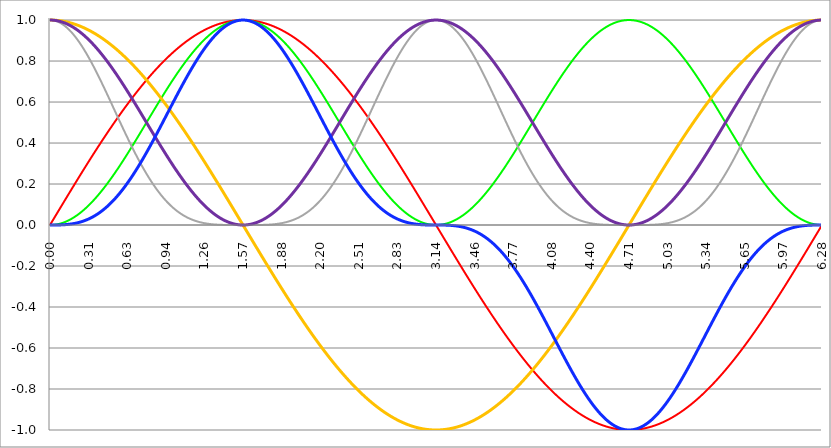
| Category | Series 1 | Series 0 | Series 2 | Series 3 | Series 4 | Series 5 |
|---|---|---|---|---|---|---|
| 0.0 | 0 | 0 | 1 | 1 | 1 | 0 |
| 0.00314159265358979 | 0.003 | 0 | 1 | 1 | 1 | 0 |
| 0.00628318530717958 | 0.006 | 0 | 1 | 1 | 1 | 0 |
| 0.00942477796076938 | 0.009 | 0 | 1 | 1 | 1 | 0 |
| 0.0125663706143592 | 0.013 | 0 | 1 | 1 | 1 | 0 |
| 0.015707963267949 | 0.016 | 0 | 1 | 1 | 1 | 0 |
| 0.0188495559215388 | 0.019 | 0 | 0.999 | 1 | 1 | 0 |
| 0.0219911485751285 | 0.022 | 0 | 0.999 | 1 | 1 | 0 |
| 0.0251327412287183 | 0.025 | 0.001 | 0.999 | 1 | 0.999 | 0 |
| 0.0282743338823081 | 0.028 | 0.001 | 0.998 | 1 | 0.999 | 0 |
| 0.0314159265358979 | 0.031 | 0.001 | 0.998 | 1 | 0.999 | 0 |
| 0.0345575191894877 | 0.035 | 0.001 | 0.998 | 0.999 | 0.999 | 0 |
| 0.0376991118430775 | 0.038 | 0.001 | 0.997 | 0.999 | 0.999 | 0 |
| 0.0408407044966673 | 0.041 | 0.002 | 0.997 | 0.999 | 0.998 | 0 |
| 0.0439822971502571 | 0.044 | 0.002 | 0.996 | 0.999 | 0.998 | 0 |
| 0.0471238898038469 | 0.047 | 0.002 | 0.996 | 0.999 | 0.998 | 0 |
| 0.0502654824574367 | 0.05 | 0.003 | 0.995 | 0.999 | 0.997 | 0 |
| 0.0534070751110265 | 0.053 | 0.003 | 0.994 | 0.999 | 0.997 | 0 |
| 0.0565486677646163 | 0.057 | 0.003 | 0.994 | 0.998 | 0.997 | 0 |
| 0.059690260418206 | 0.06 | 0.004 | 0.993 | 0.998 | 0.996 | 0 |
| 0.0628318530717958 | 0.063 | 0.004 | 0.992 | 0.998 | 0.996 | 0 |
| 0.0659734457253856 | 0.066 | 0.004 | 0.991 | 0.998 | 0.996 | 0 |
| 0.0691150383789754 | 0.069 | 0.005 | 0.99 | 0.998 | 0.995 | 0 |
| 0.0722566310325652 | 0.072 | 0.005 | 0.99 | 0.997 | 0.995 | 0 |
| 0.075398223686155 | 0.075 | 0.006 | 0.989 | 0.997 | 0.994 | 0 |
| 0.0785398163397448 | 0.078 | 0.006 | 0.988 | 0.997 | 0.994 | 0 |
| 0.0816814089933346 | 0.082 | 0.007 | 0.987 | 0.997 | 0.993 | 0.001 |
| 0.0848230016469244 | 0.085 | 0.007 | 0.986 | 0.996 | 0.993 | 0.001 |
| 0.0879645943005142 | 0.088 | 0.008 | 0.985 | 0.996 | 0.992 | 0.001 |
| 0.091106186954104 | 0.091 | 0.008 | 0.984 | 0.996 | 0.992 | 0.001 |
| 0.0942477796076937 | 0.094 | 0.009 | 0.982 | 0.996 | 0.991 | 0.001 |
| 0.0973893722612835 | 0.097 | 0.009 | 0.981 | 0.995 | 0.991 | 0.001 |
| 0.100530964914873 | 0.1 | 0.01 | 0.98 | 0.995 | 0.99 | 0.001 |
| 0.103672557568463 | 0.103 | 0.011 | 0.979 | 0.995 | 0.989 | 0.001 |
| 0.106814150222053 | 0.107 | 0.011 | 0.977 | 0.994 | 0.989 | 0.001 |
| 0.109955742875643 | 0.11 | 0.012 | 0.976 | 0.994 | 0.988 | 0.001 |
| 0.113097335529233 | 0.113 | 0.013 | 0.975 | 0.994 | 0.987 | 0.001 |
| 0.116238928182822 | 0.116 | 0.013 | 0.973 | 0.993 | 0.987 | 0.002 |
| 0.119380520836412 | 0.119 | 0.014 | 0.972 | 0.993 | 0.986 | 0.002 |
| 0.122522113490002 | 0.122 | 0.015 | 0.97 | 0.993 | 0.985 | 0.002 |
| 0.125663706143592 | 0.125 | 0.016 | 0.969 | 0.992 | 0.984 | 0.002 |
| 0.128805298797181 | 0.128 | 0.016 | 0.967 | 0.992 | 0.984 | 0.002 |
| 0.131946891450771 | 0.132 | 0.017 | 0.966 | 0.991 | 0.983 | 0.002 |
| 0.135088484104361 | 0.135 | 0.018 | 0.964 | 0.991 | 0.982 | 0.002 |
| 0.138230076757951 | 0.138 | 0.019 | 0.962 | 0.99 | 0.981 | 0.003 |
| 0.141371669411541 | 0.141 | 0.02 | 0.961 | 0.99 | 0.98 | 0.003 |
| 0.14451326206513 | 0.144 | 0.021 | 0.959 | 0.99 | 0.979 | 0.003 |
| 0.14765485471872 | 0.147 | 0.022 | 0.957 | 0.989 | 0.978 | 0.003 |
| 0.15079644737231 | 0.15 | 0.023 | 0.955 | 0.989 | 0.977 | 0.003 |
| 0.1539380400259 | 0.153 | 0.024 | 0.954 | 0.988 | 0.976 | 0.004 |
| 0.15707963267949 | 0.156 | 0.024 | 0.952 | 0.988 | 0.976 | 0.004 |
| 0.160221225333079 | 0.16 | 0.025 | 0.95 | 0.987 | 0.975 | 0.004 |
| 0.163362817986669 | 0.163 | 0.026 | 0.948 | 0.987 | 0.974 | 0.004 |
| 0.166504410640259 | 0.166 | 0.027 | 0.946 | 0.986 | 0.973 | 0.005 |
| 0.169646003293849 | 0.169 | 0.029 | 0.944 | 0.986 | 0.971 | 0.005 |
| 0.172787595947439 | 0.172 | 0.03 | 0.942 | 0.985 | 0.97 | 0.005 |
| 0.175929188601028 | 0.175 | 0.031 | 0.94 | 0.985 | 0.969 | 0.005 |
| 0.179070781254618 | 0.178 | 0.032 | 0.938 | 0.984 | 0.968 | 0.006 |
| 0.182212373908208 | 0.181 | 0.033 | 0.935 | 0.983 | 0.967 | 0.006 |
| 0.185353966561798 | 0.184 | 0.034 | 0.933 | 0.983 | 0.966 | 0.006 |
| 0.188495559215388 | 0.187 | 0.035 | 0.931 | 0.982 | 0.965 | 0.007 |
| 0.191637151868977 | 0.19 | 0.036 | 0.929 | 0.982 | 0.964 | 0.007 |
| 0.194778744522567 | 0.194 | 0.037 | 0.926 | 0.981 | 0.963 | 0.007 |
| 0.197920337176157 | 0.197 | 0.039 | 0.924 | 0.98 | 0.961 | 0.008 |
| 0.201061929829747 | 0.2 | 0.04 | 0.922 | 0.98 | 0.96 | 0.008 |
| 0.204203522483336 | 0.203 | 0.041 | 0.919 | 0.979 | 0.959 | 0.008 |
| 0.207345115136926 | 0.206 | 0.042 | 0.917 | 0.979 | 0.958 | 0.009 |
| 0.210486707790516 | 0.209 | 0.044 | 0.915 | 0.978 | 0.956 | 0.009 |
| 0.213628300444106 | 0.212 | 0.045 | 0.912 | 0.977 | 0.955 | 0.01 |
| 0.216769893097696 | 0.215 | 0.046 | 0.91 | 0.977 | 0.954 | 0.01 |
| 0.219911485751285 | 0.218 | 0.048 | 0.907 | 0.976 | 0.952 | 0.01 |
| 0.223053078404875 | 0.221 | 0.049 | 0.905 | 0.975 | 0.951 | 0.011 |
| 0.226194671058465 | 0.224 | 0.05 | 0.902 | 0.975 | 0.95 | 0.011 |
| 0.229336263712055 | 0.227 | 0.052 | 0.899 | 0.974 | 0.948 | 0.012 |
| 0.232477856365645 | 0.23 | 0.053 | 0.897 | 0.973 | 0.947 | 0.012 |
| 0.235619449019234 | 0.233 | 0.054 | 0.894 | 0.972 | 0.946 | 0.013 |
| 0.238761041672824 | 0.236 | 0.056 | 0.891 | 0.972 | 0.944 | 0.013 |
| 0.241902634326414 | 0.24 | 0.057 | 0.889 | 0.971 | 0.943 | 0.014 |
| 0.245044226980004 | 0.243 | 0.059 | 0.886 | 0.97 | 0.941 | 0.014 |
| 0.248185819633594 | 0.246 | 0.06 | 0.883 | 0.969 | 0.94 | 0.015 |
| 0.251327412287183 | 0.249 | 0.062 | 0.88 | 0.969 | 0.938 | 0.015 |
| 0.254469004940773 | 0.252 | 0.063 | 0.877 | 0.968 | 0.937 | 0.016 |
| 0.257610597594363 | 0.255 | 0.065 | 0.874 | 0.967 | 0.935 | 0.017 |
| 0.260752190247953 | 0.258 | 0.066 | 0.871 | 0.966 | 0.934 | 0.017 |
| 0.263893782901543 | 0.261 | 0.068 | 0.869 | 0.965 | 0.932 | 0.018 |
| 0.267035375555132 | 0.264 | 0.07 | 0.866 | 0.965 | 0.93 | 0.018 |
| 0.270176968208722 | 0.267 | 0.071 | 0.863 | 0.964 | 0.929 | 0.019 |
| 0.273318560862312 | 0.27 | 0.073 | 0.86 | 0.963 | 0.927 | 0.02 |
| 0.276460153515902 | 0.273 | 0.075 | 0.857 | 0.962 | 0.925 | 0.02 |
| 0.279601746169492 | 0.276 | 0.076 | 0.853 | 0.961 | 0.924 | 0.021 |
| 0.282743338823082 | 0.279 | 0.078 | 0.85 | 0.96 | 0.922 | 0.022 |
| 0.285884931476671 | 0.282 | 0.08 | 0.847 | 0.959 | 0.92 | 0.022 |
| 0.289026524130261 | 0.285 | 0.081 | 0.844 | 0.959 | 0.919 | 0.023 |
| 0.292168116783851 | 0.288 | 0.083 | 0.841 | 0.958 | 0.917 | 0.024 |
| 0.295309709437441 | 0.291 | 0.085 | 0.838 | 0.957 | 0.915 | 0.025 |
| 0.298451302091031 | 0.294 | 0.086 | 0.835 | 0.956 | 0.914 | 0.025 |
| 0.30159289474462 | 0.297 | 0.088 | 0.831 | 0.955 | 0.912 | 0.026 |
| 0.30473448739821 | 0.3 | 0.09 | 0.828 | 0.954 | 0.91 | 0.027 |
| 0.3078760800518 | 0.303 | 0.092 | 0.825 | 0.953 | 0.908 | 0.028 |
| 0.31101767270539 | 0.306 | 0.094 | 0.821 | 0.952 | 0.906 | 0.029 |
| 0.31415926535898 | 0.309 | 0.095 | 0.818 | 0.951 | 0.905 | 0.03 |
| 0.31730085801257 | 0.312 | 0.097 | 0.815 | 0.95 | 0.903 | 0.03 |
| 0.320442450666159 | 0.315 | 0.099 | 0.811 | 0.949 | 0.901 | 0.031 |
| 0.323584043319749 | 0.318 | 0.101 | 0.808 | 0.948 | 0.899 | 0.032 |
| 0.326725635973339 | 0.321 | 0.103 | 0.805 | 0.947 | 0.897 | 0.033 |
| 0.329867228626929 | 0.324 | 0.105 | 0.801 | 0.946 | 0.895 | 0.034 |
| 0.333008821280519 | 0.327 | 0.107 | 0.798 | 0.945 | 0.893 | 0.035 |
| 0.336150413934108 | 0.33 | 0.109 | 0.794 | 0.944 | 0.891 | 0.036 |
| 0.339292006587698 | 0.333 | 0.111 | 0.791 | 0.943 | 0.889 | 0.037 |
| 0.342433599241288 | 0.336 | 0.113 | 0.787 | 0.942 | 0.887 | 0.038 |
| 0.345575191894878 | 0.339 | 0.115 | 0.784 | 0.941 | 0.885 | 0.039 |
| 0.348716784548468 | 0.342 | 0.117 | 0.78 | 0.94 | 0.883 | 0.04 |
| 0.351858377202058 | 0.345 | 0.119 | 0.777 | 0.939 | 0.881 | 0.041 |
| 0.354999969855647 | 0.348 | 0.121 | 0.773 | 0.938 | 0.879 | 0.042 |
| 0.358141562509237 | 0.351 | 0.123 | 0.769 | 0.937 | 0.877 | 0.043 |
| 0.361283155162827 | 0.353 | 0.125 | 0.766 | 0.935 | 0.875 | 0.044 |
| 0.364424747816417 | 0.356 | 0.127 | 0.762 | 0.934 | 0.873 | 0.045 |
| 0.367566340470007 | 0.359 | 0.129 | 0.758 | 0.933 | 0.871 | 0.046 |
| 0.370707933123597 | 0.362 | 0.131 | 0.755 | 0.932 | 0.869 | 0.048 |
| 0.373849525777186 | 0.365 | 0.133 | 0.751 | 0.931 | 0.867 | 0.049 |
| 0.376991118430776 | 0.368 | 0.136 | 0.747 | 0.93 | 0.864 | 0.05 |
| 0.380132711084366 | 0.371 | 0.138 | 0.744 | 0.929 | 0.862 | 0.051 |
| 0.383274303737956 | 0.374 | 0.14 | 0.74 | 0.927 | 0.86 | 0.052 |
| 0.386415896391546 | 0.377 | 0.142 | 0.736 | 0.926 | 0.858 | 0.054 |
| 0.389557489045135 | 0.38 | 0.144 | 0.732 | 0.925 | 0.856 | 0.055 |
| 0.392699081698725 | 0.383 | 0.146 | 0.729 | 0.924 | 0.854 | 0.056 |
| 0.395840674352315 | 0.386 | 0.149 | 0.725 | 0.923 | 0.851 | 0.057 |
| 0.398982267005905 | 0.388 | 0.151 | 0.721 | 0.921 | 0.849 | 0.059 |
| 0.402123859659495 | 0.391 | 0.153 | 0.717 | 0.92 | 0.847 | 0.06 |
| 0.405265452313085 | 0.394 | 0.155 | 0.713 | 0.919 | 0.845 | 0.061 |
| 0.408407044966674 | 0.397 | 0.158 | 0.709 | 0.918 | 0.842 | 0.063 |
| 0.411548637620264 | 0.4 | 0.16 | 0.706 | 0.917 | 0.84 | 0.064 |
| 0.414690230273854 | 0.403 | 0.162 | 0.702 | 0.915 | 0.838 | 0.065 |
| 0.417831822927444 | 0.406 | 0.165 | 0.698 | 0.914 | 0.835 | 0.067 |
| 0.420973415581034 | 0.409 | 0.167 | 0.694 | 0.913 | 0.833 | 0.068 |
| 0.424115008234623 | 0.412 | 0.169 | 0.69 | 0.911 | 0.831 | 0.07 |
| 0.427256600888213 | 0.414 | 0.172 | 0.686 | 0.91 | 0.828 | 0.071 |
| 0.430398193541803 | 0.417 | 0.174 | 0.682 | 0.909 | 0.826 | 0.073 |
| 0.433539786195393 | 0.42 | 0.176 | 0.678 | 0.907 | 0.824 | 0.074 |
| 0.436681378848983 | 0.423 | 0.179 | 0.674 | 0.906 | 0.821 | 0.076 |
| 0.439822971502573 | 0.426 | 0.181 | 0.67 | 0.905 | 0.819 | 0.077 |
| 0.442964564156162 | 0.429 | 0.184 | 0.666 | 0.903 | 0.816 | 0.079 |
| 0.446106156809752 | 0.431 | 0.186 | 0.662 | 0.902 | 0.814 | 0.08 |
| 0.449247749463342 | 0.434 | 0.189 | 0.658 | 0.901 | 0.811 | 0.082 |
| 0.452389342116932 | 0.437 | 0.191 | 0.654 | 0.899 | 0.809 | 0.084 |
| 0.455530934770522 | 0.44 | 0.194 | 0.65 | 0.898 | 0.806 | 0.085 |
| 0.458672527424111 | 0.443 | 0.196 | 0.646 | 0.897 | 0.804 | 0.087 |
| 0.461814120077701 | 0.446 | 0.199 | 0.642 | 0.895 | 0.801 | 0.088 |
| 0.464955712731291 | 0.448 | 0.201 | 0.638 | 0.894 | 0.799 | 0.09 |
| 0.468097305384881 | 0.451 | 0.204 | 0.634 | 0.892 | 0.796 | 0.092 |
| 0.471238898038471 | 0.454 | 0.206 | 0.63 | 0.891 | 0.794 | 0.094 |
| 0.474380490692061 | 0.457 | 0.209 | 0.626 | 0.89 | 0.791 | 0.095 |
| 0.47752208334565 | 0.46 | 0.211 | 0.622 | 0.888 | 0.789 | 0.097 |
| 0.48066367599924 | 0.462 | 0.214 | 0.618 | 0.887 | 0.786 | 0.099 |
| 0.48380526865283 | 0.465 | 0.216 | 0.614 | 0.885 | 0.784 | 0.101 |
| 0.48694686130642 | 0.468 | 0.219 | 0.61 | 0.884 | 0.781 | 0.102 |
| 0.49008845396001 | 0.471 | 0.222 | 0.606 | 0.882 | 0.778 | 0.104 |
| 0.493230046613599 | 0.473 | 0.224 | 0.602 | 0.881 | 0.776 | 0.106 |
| 0.496371639267189 | 0.476 | 0.227 | 0.598 | 0.879 | 0.773 | 0.108 |
| 0.499513231920779 | 0.479 | 0.229 | 0.594 | 0.878 | 0.771 | 0.11 |
| 0.502654824574369 | 0.482 | 0.232 | 0.59 | 0.876 | 0.768 | 0.112 |
| 0.505796417227959 | 0.485 | 0.235 | 0.586 | 0.875 | 0.765 | 0.114 |
| 0.508938009881549 | 0.487 | 0.237 | 0.582 | 0.873 | 0.763 | 0.116 |
| 0.512079602535138 | 0.49 | 0.24 | 0.577 | 0.872 | 0.76 | 0.118 |
| 0.515221195188728 | 0.493 | 0.243 | 0.573 | 0.87 | 0.757 | 0.12 |
| 0.518362787842318 | 0.495 | 0.245 | 0.569 | 0.869 | 0.755 | 0.122 |
| 0.521504380495908 | 0.498 | 0.248 | 0.565 | 0.867 | 0.752 | 0.124 |
| 0.524645973149498 | 0.501 | 0.251 | 0.561 | 0.866 | 0.749 | 0.126 |
| 0.527787565803087 | 0.504 | 0.254 | 0.557 | 0.864 | 0.746 | 0.128 |
| 0.530929158456677 | 0.506 | 0.256 | 0.553 | 0.862 | 0.744 | 0.13 |
| 0.534070751110267 | 0.509 | 0.259 | 0.549 | 0.861 | 0.741 | 0.132 |
| 0.537212343763857 | 0.512 | 0.262 | 0.545 | 0.859 | 0.738 | 0.134 |
| 0.540353936417447 | 0.514 | 0.265 | 0.541 | 0.858 | 0.735 | 0.136 |
| 0.543495529071037 | 0.517 | 0.267 | 0.537 | 0.856 | 0.733 | 0.138 |
| 0.546637121724626 | 0.52 | 0.27 | 0.533 | 0.854 | 0.73 | 0.14 |
| 0.549778714378216 | 0.522 | 0.273 | 0.529 | 0.853 | 0.727 | 0.143 |
| 0.552920307031806 | 0.525 | 0.276 | 0.524 | 0.851 | 0.724 | 0.145 |
| 0.556061899685396 | 0.528 | 0.279 | 0.52 | 0.849 | 0.721 | 0.147 |
| 0.559203492338986 | 0.531 | 0.281 | 0.516 | 0.848 | 0.719 | 0.149 |
| 0.562345084992576 | 0.533 | 0.284 | 0.512 | 0.846 | 0.716 | 0.152 |
| 0.565486677646165 | 0.536 | 0.287 | 0.508 | 0.844 | 0.713 | 0.154 |
| 0.568628270299755 | 0.538 | 0.29 | 0.504 | 0.843 | 0.71 | 0.156 |
| 0.571769862953345 | 0.541 | 0.293 | 0.5 | 0.841 | 0.707 | 0.158 |
| 0.574911455606935 | 0.544 | 0.296 | 0.496 | 0.839 | 0.704 | 0.161 |
| 0.578053048260525 | 0.546 | 0.299 | 0.492 | 0.838 | 0.701 | 0.163 |
| 0.581194640914114 | 0.549 | 0.301 | 0.488 | 0.836 | 0.699 | 0.165 |
| 0.584336233567704 | 0.552 | 0.304 | 0.484 | 0.834 | 0.696 | 0.168 |
| 0.587477826221294 | 0.554 | 0.307 | 0.48 | 0.832 | 0.693 | 0.17 |
| 0.590619418874884 | 0.557 | 0.31 | 0.476 | 0.831 | 0.69 | 0.173 |
| 0.593761011528474 | 0.559 | 0.313 | 0.472 | 0.829 | 0.687 | 0.175 |
| 0.596902604182064 | 0.562 | 0.316 | 0.468 | 0.827 | 0.684 | 0.178 |
| 0.600044196835653 | 0.565 | 0.319 | 0.464 | 0.825 | 0.681 | 0.18 |
| 0.603185789489243 | 0.567 | 0.322 | 0.46 | 0.824 | 0.678 | 0.183 |
| 0.606327382142833 | 0.57 | 0.325 | 0.456 | 0.822 | 0.675 | 0.185 |
| 0.609468974796423 | 0.572 | 0.328 | 0.452 | 0.82 | 0.672 | 0.188 |
| 0.612610567450013 | 0.575 | 0.331 | 0.448 | 0.818 | 0.669 | 0.19 |
| 0.615752160103602 | 0.578 | 0.334 | 0.444 | 0.816 | 0.666 | 0.193 |
| 0.618893752757192 | 0.58 | 0.337 | 0.44 | 0.815 | 0.663 | 0.195 |
| 0.622035345410782 | 0.583 | 0.34 | 0.436 | 0.813 | 0.66 | 0.198 |
| 0.625176938064372 | 0.585 | 0.343 | 0.432 | 0.811 | 0.657 | 0.2 |
| 0.628318530717962 | 0.588 | 0.345 | 0.428 | 0.809 | 0.655 | 0.203 |
| 0.631460123371551 | 0.59 | 0.348 | 0.424 | 0.807 | 0.652 | 0.206 |
| 0.634601716025141 | 0.593 | 0.351 | 0.421 | 0.805 | 0.649 | 0.208 |
| 0.637743308678731 | 0.595 | 0.354 | 0.417 | 0.803 | 0.646 | 0.211 |
| 0.640884901332321 | 0.598 | 0.357 | 0.413 | 0.802 | 0.643 | 0.214 |
| 0.644026493985911 | 0.6 | 0.361 | 0.409 | 0.8 | 0.639 | 0.216 |
| 0.647168086639501 | 0.603 | 0.364 | 0.405 | 0.798 | 0.636 | 0.219 |
| 0.65030967929309 | 0.605 | 0.367 | 0.401 | 0.796 | 0.633 | 0.222 |
| 0.65345127194668 | 0.608 | 0.37 | 0.397 | 0.794 | 0.63 | 0.225 |
| 0.65659286460027 | 0.61 | 0.373 | 0.394 | 0.792 | 0.627 | 0.227 |
| 0.65973445725386 | 0.613 | 0.376 | 0.39 | 0.79 | 0.624 | 0.23 |
| 0.66287604990745 | 0.615 | 0.379 | 0.386 | 0.788 | 0.621 | 0.233 |
| 0.666017642561039 | 0.618 | 0.382 | 0.382 | 0.786 | 0.618 | 0.236 |
| 0.669159235214629 | 0.62 | 0.385 | 0.378 | 0.784 | 0.615 | 0.239 |
| 0.672300827868219 | 0.623 | 0.388 | 0.375 | 0.782 | 0.612 | 0.242 |
| 0.675442420521809 | 0.625 | 0.391 | 0.371 | 0.78 | 0.609 | 0.244 |
| 0.678584013175399 | 0.628 | 0.394 | 0.367 | 0.778 | 0.606 | 0.247 |
| 0.681725605828989 | 0.63 | 0.397 | 0.364 | 0.776 | 0.603 | 0.25 |
| 0.684867198482578 | 0.633 | 0.4 | 0.36 | 0.775 | 0.6 | 0.253 |
| 0.688008791136168 | 0.635 | 0.403 | 0.356 | 0.773 | 0.597 | 0.256 |
| 0.691150383789758 | 0.637 | 0.406 | 0.352 | 0.771 | 0.594 | 0.259 |
| 0.694291976443348 | 0.64 | 0.409 | 0.349 | 0.769 | 0.591 | 0.262 |
| 0.697433569096938 | 0.642 | 0.412 | 0.345 | 0.766 | 0.588 | 0.265 |
| 0.700575161750528 | 0.645 | 0.416 | 0.342 | 0.764 | 0.584 | 0.268 |
| 0.703716754404117 | 0.647 | 0.419 | 0.338 | 0.762 | 0.581 | 0.271 |
| 0.706858347057707 | 0.649 | 0.422 | 0.334 | 0.76 | 0.578 | 0.274 |
| 0.709999939711297 | 0.652 | 0.425 | 0.331 | 0.758 | 0.575 | 0.277 |
| 0.713141532364887 | 0.654 | 0.428 | 0.327 | 0.756 | 0.572 | 0.28 |
| 0.716283125018477 | 0.657 | 0.431 | 0.324 | 0.754 | 0.569 | 0.283 |
| 0.719424717672066 | 0.659 | 0.434 | 0.32 | 0.752 | 0.566 | 0.286 |
| 0.722566310325656 | 0.661 | 0.437 | 0.317 | 0.75 | 0.563 | 0.289 |
| 0.725707902979246 | 0.664 | 0.44 | 0.313 | 0.748 | 0.56 | 0.292 |
| 0.728849495632836 | 0.666 | 0.444 | 0.31 | 0.746 | 0.556 | 0.295 |
| 0.731991088286426 | 0.668 | 0.447 | 0.306 | 0.744 | 0.553 | 0.299 |
| 0.735132680940016 | 0.671 | 0.45 | 0.303 | 0.742 | 0.55 | 0.302 |
| 0.738274273593605 | 0.673 | 0.453 | 0.299 | 0.74 | 0.547 | 0.305 |
| 0.741415866247195 | 0.675 | 0.456 | 0.296 | 0.738 | 0.544 | 0.308 |
| 0.744557458900785 | 0.678 | 0.459 | 0.292 | 0.735 | 0.541 | 0.311 |
| 0.747699051554375 | 0.68 | 0.462 | 0.289 | 0.733 | 0.538 | 0.314 |
| 0.750840644207965 | 0.682 | 0.465 | 0.286 | 0.731 | 0.535 | 0.318 |
| 0.753982236861554 | 0.685 | 0.469 | 0.282 | 0.729 | 0.531 | 0.321 |
| 0.757123829515144 | 0.687 | 0.472 | 0.279 | 0.727 | 0.528 | 0.324 |
| 0.760265422168734 | 0.689 | 0.475 | 0.276 | 0.725 | 0.525 | 0.327 |
| 0.763407014822324 | 0.691 | 0.478 | 0.272 | 0.722 | 0.522 | 0.33 |
| 0.766548607475914 | 0.694 | 0.481 | 0.269 | 0.72 | 0.519 | 0.334 |
| 0.769690200129504 | 0.696 | 0.484 | 0.266 | 0.718 | 0.516 | 0.337 |
| 0.772831792783093 | 0.698 | 0.487 | 0.263 | 0.716 | 0.513 | 0.34 |
| 0.775973385436683 | 0.7 | 0.491 | 0.26 | 0.714 | 0.509 | 0.344 |
| 0.779114978090273 | 0.703 | 0.494 | 0.256 | 0.712 | 0.506 | 0.347 |
| 0.782256570743863 | 0.705 | 0.497 | 0.253 | 0.709 | 0.503 | 0.35 |
| 0.785398163397453 | 0.707 | 0.5 | 0.25 | 0.707 | 0.5 | 0.354 |
| 0.788539756051042 | 0.709 | 0.503 | 0.247 | 0.705 | 0.497 | 0.357 |
| 0.791681348704632 | 0.712 | 0.506 | 0.244 | 0.703 | 0.494 | 0.36 |
| 0.794822941358222 | 0.714 | 0.509 | 0.241 | 0.7 | 0.491 | 0.364 |
| 0.797964534011812 | 0.716 | 0.513 | 0.238 | 0.698 | 0.487 | 0.367 |
| 0.801106126665402 | 0.718 | 0.516 | 0.235 | 0.696 | 0.484 | 0.37 |
| 0.804247719318992 | 0.72 | 0.519 | 0.232 | 0.694 | 0.481 | 0.374 |
| 0.807389311972581 | 0.722 | 0.522 | 0.228 | 0.691 | 0.478 | 0.377 |
| 0.810530904626171 | 0.725 | 0.525 | 0.226 | 0.689 | 0.475 | 0.381 |
| 0.813672497279761 | 0.727 | 0.528 | 0.223 | 0.687 | 0.472 | 0.384 |
| 0.816814089933351 | 0.729 | 0.531 | 0.22 | 0.685 | 0.469 | 0.387 |
| 0.819955682586941 | 0.731 | 0.535 | 0.217 | 0.682 | 0.465 | 0.391 |
| 0.823097275240531 | 0.733 | 0.538 | 0.214 | 0.68 | 0.462 | 0.394 |
| 0.82623886789412 | 0.735 | 0.541 | 0.211 | 0.678 | 0.459 | 0.398 |
| 0.82938046054771 | 0.738 | 0.544 | 0.208 | 0.675 | 0.456 | 0.401 |
| 0.8325220532013 | 0.74 | 0.547 | 0.205 | 0.673 | 0.453 | 0.405 |
| 0.83566364585489 | 0.742 | 0.55 | 0.202 | 0.671 | 0.45 | 0.408 |
| 0.83880523850848 | 0.744 | 0.553 | 0.2 | 0.668 | 0.447 | 0.412 |
| 0.841946831162069 | 0.746 | 0.556 | 0.197 | 0.666 | 0.444 | 0.415 |
| 0.845088423815659 | 0.748 | 0.56 | 0.194 | 0.664 | 0.44 | 0.419 |
| 0.848230016469249 | 0.75 | 0.563 | 0.191 | 0.661 | 0.437 | 0.422 |
| 0.851371609122839 | 0.752 | 0.566 | 0.189 | 0.659 | 0.434 | 0.426 |
| 0.854513201776429 | 0.754 | 0.569 | 0.186 | 0.657 | 0.431 | 0.429 |
| 0.857654794430019 | 0.756 | 0.572 | 0.183 | 0.654 | 0.428 | 0.433 |
| 0.860796387083608 | 0.758 | 0.575 | 0.181 | 0.652 | 0.425 | 0.436 |
| 0.863937979737198 | 0.76 | 0.578 | 0.178 | 0.649 | 0.422 | 0.44 |
| 0.867079572390788 | 0.762 | 0.581 | 0.175 | 0.647 | 0.419 | 0.443 |
| 0.870221165044378 | 0.764 | 0.584 | 0.173 | 0.645 | 0.416 | 0.447 |
| 0.873362757697968 | 0.766 | 0.588 | 0.17 | 0.642 | 0.412 | 0.45 |
| 0.876504350351557 | 0.769 | 0.591 | 0.168 | 0.64 | 0.409 | 0.454 |
| 0.879645943005147 | 0.771 | 0.594 | 0.165 | 0.637 | 0.406 | 0.457 |
| 0.882787535658737 | 0.773 | 0.597 | 0.163 | 0.635 | 0.403 | 0.461 |
| 0.885929128312327 | 0.775 | 0.6 | 0.16 | 0.633 | 0.4 | 0.465 |
| 0.889070720965917 | 0.776 | 0.603 | 0.158 | 0.63 | 0.397 | 0.468 |
| 0.892212313619507 | 0.778 | 0.606 | 0.155 | 0.628 | 0.394 | 0.472 |
| 0.895353906273096 | 0.78 | 0.609 | 0.153 | 0.625 | 0.391 | 0.475 |
| 0.898495498926686 | 0.782 | 0.612 | 0.15 | 0.623 | 0.388 | 0.479 |
| 0.901637091580276 | 0.784 | 0.615 | 0.148 | 0.62 | 0.385 | 0.483 |
| 0.904778684233866 | 0.786 | 0.618 | 0.146 | 0.618 | 0.382 | 0.486 |
| 0.907920276887456 | 0.788 | 0.621 | 0.143 | 0.615 | 0.379 | 0.49 |
| 0.911061869541045 | 0.79 | 0.624 | 0.141 | 0.613 | 0.376 | 0.493 |
| 0.914203462194635 | 0.792 | 0.627 | 0.139 | 0.61 | 0.373 | 0.497 |
| 0.917345054848225 | 0.794 | 0.63 | 0.137 | 0.608 | 0.37 | 0.501 |
| 0.920486647501815 | 0.796 | 0.633 | 0.134 | 0.605 | 0.367 | 0.504 |
| 0.923628240155405 | 0.798 | 0.636 | 0.132 | 0.603 | 0.364 | 0.508 |
| 0.926769832808995 | 0.8 | 0.639 | 0.13 | 0.6 | 0.361 | 0.511 |
| 0.929911425462584 | 0.802 | 0.643 | 0.128 | 0.598 | 0.357 | 0.515 |
| 0.933053018116174 | 0.803 | 0.646 | 0.126 | 0.595 | 0.354 | 0.519 |
| 0.936194610769764 | 0.805 | 0.649 | 0.124 | 0.593 | 0.351 | 0.522 |
| 0.939336203423354 | 0.807 | 0.652 | 0.121 | 0.59 | 0.348 | 0.526 |
| 0.942477796076944 | 0.809 | 0.655 | 0.119 | 0.588 | 0.345 | 0.53 |
| 0.945619388730533 | 0.811 | 0.657 | 0.117 | 0.585 | 0.343 | 0.533 |
| 0.948760981384123 | 0.813 | 0.66 | 0.115 | 0.583 | 0.34 | 0.537 |
| 0.951902574037713 | 0.815 | 0.663 | 0.113 | 0.58 | 0.337 | 0.54 |
| 0.955044166691303 | 0.816 | 0.666 | 0.111 | 0.578 | 0.334 | 0.544 |
| 0.958185759344893 | 0.818 | 0.669 | 0.109 | 0.575 | 0.331 | 0.548 |
| 0.961327351998483 | 0.82 | 0.672 | 0.107 | 0.572 | 0.328 | 0.551 |
| 0.964468944652072 | 0.822 | 0.675 | 0.105 | 0.57 | 0.325 | 0.555 |
| 0.967610537305662 | 0.824 | 0.678 | 0.104 | 0.567 | 0.322 | 0.559 |
| 0.970752129959252 | 0.825 | 0.681 | 0.102 | 0.565 | 0.319 | 0.562 |
| 0.973893722612842 | 0.827 | 0.684 | 0.1 | 0.562 | 0.316 | 0.566 |
| 0.977035315266432 | 0.829 | 0.687 | 0.098 | 0.559 | 0.313 | 0.569 |
| 0.980176907920022 | 0.831 | 0.69 | 0.096 | 0.557 | 0.31 | 0.573 |
| 0.983318500573611 | 0.832 | 0.693 | 0.094 | 0.554 | 0.307 | 0.577 |
| 0.986460093227201 | 0.834 | 0.696 | 0.093 | 0.552 | 0.304 | 0.58 |
| 0.989601685880791 | 0.836 | 0.699 | 0.091 | 0.549 | 0.301 | 0.584 |
| 0.992743278534381 | 0.838 | 0.701 | 0.089 | 0.546 | 0.299 | 0.587 |
| 0.995884871187971 | 0.839 | 0.704 | 0.087 | 0.544 | 0.296 | 0.591 |
| 0.99902646384156 | 0.841 | 0.707 | 0.086 | 0.541 | 0.293 | 0.595 |
| 1.00216805649515 | 0.843 | 0.71 | 0.084 | 0.538 | 0.29 | 0.598 |
| 1.00530964914874 | 0.844 | 0.713 | 0.082 | 0.536 | 0.287 | 0.602 |
| 1.00845124180233 | 0.846 | 0.716 | 0.081 | 0.533 | 0.284 | 0.606 |
| 1.01159283445592 | 0.848 | 0.719 | 0.079 | 0.531 | 0.281 | 0.609 |
| 1.01473442710951 | 0.849 | 0.721 | 0.078 | 0.528 | 0.279 | 0.613 |
| 1.017876019763099 | 0.851 | 0.724 | 0.076 | 0.525 | 0.276 | 0.616 |
| 1.021017612416689 | 0.853 | 0.727 | 0.075 | 0.522 | 0.273 | 0.62 |
| 1.02415920507028 | 0.854 | 0.73 | 0.073 | 0.52 | 0.27 | 0.623 |
| 1.027300797723869 | 0.856 | 0.733 | 0.072 | 0.517 | 0.267 | 0.627 |
| 1.030442390377459 | 0.858 | 0.735 | 0.07 | 0.514 | 0.265 | 0.631 |
| 1.033583983031048 | 0.859 | 0.738 | 0.069 | 0.512 | 0.262 | 0.634 |
| 1.036725575684638 | 0.861 | 0.741 | 0.067 | 0.509 | 0.259 | 0.638 |
| 1.039867168338228 | 0.862 | 0.744 | 0.066 | 0.506 | 0.256 | 0.641 |
| 1.043008760991818 | 0.864 | 0.746 | 0.064 | 0.504 | 0.254 | 0.645 |
| 1.046150353645408 | 0.866 | 0.749 | 0.063 | 0.501 | 0.251 | 0.648 |
| 1.049291946298998 | 0.867 | 0.752 | 0.062 | 0.498 | 0.248 | 0.652 |
| 1.052433538952587 | 0.869 | 0.755 | 0.06 | 0.495 | 0.245 | 0.655 |
| 1.055575131606177 | 0.87 | 0.757 | 0.059 | 0.493 | 0.243 | 0.659 |
| 1.058716724259767 | 0.872 | 0.76 | 0.058 | 0.49 | 0.24 | 0.662 |
| 1.061858316913357 | 0.873 | 0.763 | 0.056 | 0.487 | 0.237 | 0.666 |
| 1.064999909566947 | 0.875 | 0.765 | 0.055 | 0.485 | 0.235 | 0.669 |
| 1.068141502220536 | 0.876 | 0.768 | 0.054 | 0.482 | 0.232 | 0.673 |
| 1.071283094874126 | 0.878 | 0.771 | 0.053 | 0.479 | 0.229 | 0.676 |
| 1.074424687527716 | 0.879 | 0.773 | 0.051 | 0.476 | 0.227 | 0.68 |
| 1.077566280181306 | 0.881 | 0.776 | 0.05 | 0.473 | 0.224 | 0.683 |
| 1.080707872834896 | 0.882 | 0.778 | 0.049 | 0.471 | 0.222 | 0.687 |
| 1.083849465488486 | 0.884 | 0.781 | 0.048 | 0.468 | 0.219 | 0.69 |
| 1.086991058142075 | 0.885 | 0.784 | 0.047 | 0.465 | 0.216 | 0.694 |
| 1.090132650795665 | 0.887 | 0.786 | 0.046 | 0.462 | 0.214 | 0.697 |
| 1.093274243449255 | 0.888 | 0.789 | 0.045 | 0.46 | 0.211 | 0.701 |
| 1.096415836102845 | 0.89 | 0.791 | 0.044 | 0.457 | 0.209 | 0.704 |
| 1.099557428756435 | 0.891 | 0.794 | 0.042 | 0.454 | 0.206 | 0.707 |
| 1.102699021410025 | 0.892 | 0.796 | 0.041 | 0.451 | 0.204 | 0.711 |
| 1.105840614063614 | 0.894 | 0.799 | 0.04 | 0.448 | 0.201 | 0.714 |
| 1.108982206717204 | 0.895 | 0.801 | 0.039 | 0.446 | 0.199 | 0.718 |
| 1.112123799370794 | 0.897 | 0.804 | 0.038 | 0.443 | 0.196 | 0.721 |
| 1.115265392024384 | 0.898 | 0.806 | 0.037 | 0.44 | 0.194 | 0.724 |
| 1.118406984677974 | 0.899 | 0.809 | 0.037 | 0.437 | 0.191 | 0.728 |
| 1.121548577331563 | 0.901 | 0.811 | 0.036 | 0.434 | 0.189 | 0.731 |
| 1.124690169985153 | 0.902 | 0.814 | 0.035 | 0.431 | 0.186 | 0.734 |
| 1.127831762638743 | 0.903 | 0.816 | 0.034 | 0.429 | 0.184 | 0.738 |
| 1.130973355292333 | 0.905 | 0.819 | 0.033 | 0.426 | 0.181 | 0.741 |
| 1.134114947945923 | 0.906 | 0.821 | 0.032 | 0.423 | 0.179 | 0.744 |
| 1.137256540599513 | 0.907 | 0.824 | 0.031 | 0.42 | 0.176 | 0.747 |
| 1.140398133253102 | 0.909 | 0.826 | 0.03 | 0.417 | 0.174 | 0.751 |
| 1.143539725906692 | 0.91 | 0.828 | 0.029 | 0.414 | 0.172 | 0.754 |
| 1.146681318560282 | 0.911 | 0.831 | 0.029 | 0.412 | 0.169 | 0.757 |
| 1.149822911213872 | 0.913 | 0.833 | 0.028 | 0.409 | 0.167 | 0.76 |
| 1.152964503867462 | 0.914 | 0.835 | 0.027 | 0.406 | 0.165 | 0.763 |
| 1.156106096521051 | 0.915 | 0.838 | 0.026 | 0.403 | 0.162 | 0.767 |
| 1.159247689174641 | 0.917 | 0.84 | 0.026 | 0.4 | 0.16 | 0.77 |
| 1.162389281828231 | 0.918 | 0.842 | 0.025 | 0.397 | 0.158 | 0.773 |
| 1.165530874481821 | 0.919 | 0.845 | 0.024 | 0.394 | 0.155 | 0.776 |
| 1.168672467135411 | 0.92 | 0.847 | 0.023 | 0.391 | 0.153 | 0.779 |
| 1.171814059789001 | 0.921 | 0.849 | 0.023 | 0.388 | 0.151 | 0.782 |
| 1.17495565244259 | 0.923 | 0.851 | 0.022 | 0.386 | 0.149 | 0.785 |
| 1.17809724509618 | 0.924 | 0.854 | 0.021 | 0.383 | 0.146 | 0.789 |
| 1.18123883774977 | 0.925 | 0.856 | 0.021 | 0.38 | 0.144 | 0.792 |
| 1.18438043040336 | 0.926 | 0.858 | 0.02 | 0.377 | 0.142 | 0.795 |
| 1.18752202305695 | 0.927 | 0.86 | 0.02 | 0.374 | 0.14 | 0.798 |
| 1.190663615710539 | 0.929 | 0.862 | 0.019 | 0.371 | 0.138 | 0.801 |
| 1.193805208364129 | 0.93 | 0.864 | 0.018 | 0.368 | 0.136 | 0.804 |
| 1.19694680101772 | 0.931 | 0.867 | 0.018 | 0.365 | 0.133 | 0.807 |
| 1.200088393671309 | 0.932 | 0.869 | 0.017 | 0.362 | 0.131 | 0.81 |
| 1.203229986324899 | 0.933 | 0.871 | 0.017 | 0.359 | 0.129 | 0.813 |
| 1.206371578978489 | 0.934 | 0.873 | 0.016 | 0.356 | 0.127 | 0.816 |
| 1.209513171632078 | 0.935 | 0.875 | 0.016 | 0.353 | 0.125 | 0.819 |
| 1.212654764285668 | 0.937 | 0.877 | 0.015 | 0.351 | 0.123 | 0.821 |
| 1.215796356939258 | 0.938 | 0.879 | 0.015 | 0.348 | 0.121 | 0.824 |
| 1.218937949592848 | 0.939 | 0.881 | 0.014 | 0.345 | 0.119 | 0.827 |
| 1.222079542246438 | 0.94 | 0.883 | 0.014 | 0.342 | 0.117 | 0.83 |
| 1.225221134900027 | 0.941 | 0.885 | 0.013 | 0.339 | 0.115 | 0.833 |
| 1.228362727553617 | 0.942 | 0.887 | 0.013 | 0.336 | 0.113 | 0.836 |
| 1.231504320207207 | 0.943 | 0.889 | 0.012 | 0.333 | 0.111 | 0.839 |
| 1.234645912860797 | 0.944 | 0.891 | 0.012 | 0.33 | 0.109 | 0.841 |
| 1.237787505514387 | 0.945 | 0.893 | 0.011 | 0.327 | 0.107 | 0.844 |
| 1.240929098167977 | 0.946 | 0.895 | 0.011 | 0.324 | 0.105 | 0.847 |
| 1.244070690821566 | 0.947 | 0.897 | 0.011 | 0.321 | 0.103 | 0.85 |
| 1.247212283475156 | 0.948 | 0.899 | 0.01 | 0.318 | 0.101 | 0.852 |
| 1.250353876128746 | 0.949 | 0.901 | 0.01 | 0.315 | 0.099 | 0.855 |
| 1.253495468782336 | 0.95 | 0.903 | 0.009 | 0.312 | 0.097 | 0.858 |
| 1.256637061435926 | 0.951 | 0.905 | 0.009 | 0.309 | 0.095 | 0.86 |
| 1.259778654089515 | 0.952 | 0.906 | 0.009 | 0.306 | 0.094 | 0.863 |
| 1.262920246743105 | 0.953 | 0.908 | 0.008 | 0.303 | 0.092 | 0.865 |
| 1.266061839396695 | 0.954 | 0.91 | 0.008 | 0.3 | 0.09 | 0.868 |
| 1.269203432050285 | 0.955 | 0.912 | 0.008 | 0.297 | 0.088 | 0.871 |
| 1.272345024703875 | 0.956 | 0.914 | 0.007 | 0.294 | 0.086 | 0.873 |
| 1.275486617357465 | 0.957 | 0.915 | 0.007 | 0.291 | 0.085 | 0.876 |
| 1.278628210011054 | 0.958 | 0.917 | 0.007 | 0.288 | 0.083 | 0.878 |
| 1.281769802664644 | 0.959 | 0.919 | 0.007 | 0.285 | 0.081 | 0.881 |
| 1.284911395318234 | 0.959 | 0.92 | 0.006 | 0.282 | 0.08 | 0.883 |
| 1.288052987971824 | 0.96 | 0.922 | 0.006 | 0.279 | 0.078 | 0.886 |
| 1.291194580625414 | 0.961 | 0.924 | 0.006 | 0.276 | 0.076 | 0.888 |
| 1.294336173279003 | 0.962 | 0.925 | 0.006 | 0.273 | 0.075 | 0.89 |
| 1.297477765932593 | 0.963 | 0.927 | 0.005 | 0.27 | 0.073 | 0.893 |
| 1.300619358586183 | 0.964 | 0.929 | 0.005 | 0.267 | 0.071 | 0.895 |
| 1.303760951239773 | 0.965 | 0.93 | 0.005 | 0.264 | 0.07 | 0.897 |
| 1.306902543893363 | 0.965 | 0.932 | 0.005 | 0.261 | 0.068 | 0.9 |
| 1.310044136546953 | 0.966 | 0.934 | 0.004 | 0.258 | 0.066 | 0.902 |
| 1.313185729200542 | 0.967 | 0.935 | 0.004 | 0.255 | 0.065 | 0.904 |
| 1.316327321854132 | 0.968 | 0.937 | 0.004 | 0.252 | 0.063 | 0.906 |
| 1.319468914507722 | 0.969 | 0.938 | 0.004 | 0.249 | 0.062 | 0.909 |
| 1.322610507161312 | 0.969 | 0.94 | 0.004 | 0.246 | 0.06 | 0.911 |
| 1.325752099814902 | 0.97 | 0.941 | 0.003 | 0.243 | 0.059 | 0.913 |
| 1.328893692468491 | 0.971 | 0.943 | 0.003 | 0.24 | 0.057 | 0.915 |
| 1.332035285122081 | 0.972 | 0.944 | 0.003 | 0.236 | 0.056 | 0.917 |
| 1.335176877775671 | 0.972 | 0.946 | 0.003 | 0.233 | 0.054 | 0.919 |
| 1.338318470429261 | 0.973 | 0.947 | 0.003 | 0.23 | 0.053 | 0.921 |
| 1.341460063082851 | 0.974 | 0.948 | 0.003 | 0.227 | 0.052 | 0.923 |
| 1.344601655736441 | 0.975 | 0.95 | 0.003 | 0.224 | 0.05 | 0.926 |
| 1.34774324839003 | 0.975 | 0.951 | 0.002 | 0.221 | 0.049 | 0.928 |
| 1.35088484104362 | 0.976 | 0.952 | 0.002 | 0.218 | 0.048 | 0.929 |
| 1.35402643369721 | 0.977 | 0.954 | 0.002 | 0.215 | 0.046 | 0.931 |
| 1.3571680263508 | 0.977 | 0.955 | 0.002 | 0.212 | 0.045 | 0.933 |
| 1.36030961900439 | 0.978 | 0.956 | 0.002 | 0.209 | 0.044 | 0.935 |
| 1.363451211657979 | 0.979 | 0.958 | 0.002 | 0.206 | 0.042 | 0.937 |
| 1.36659280431157 | 0.979 | 0.959 | 0.002 | 0.203 | 0.041 | 0.939 |
| 1.369734396965159 | 0.98 | 0.96 | 0.002 | 0.2 | 0.04 | 0.941 |
| 1.372875989618749 | 0.98 | 0.961 | 0.001 | 0.197 | 0.039 | 0.943 |
| 1.376017582272339 | 0.981 | 0.963 | 0.001 | 0.194 | 0.037 | 0.944 |
| 1.379159174925929 | 0.982 | 0.964 | 0.001 | 0.19 | 0.036 | 0.946 |
| 1.382300767579518 | 0.982 | 0.965 | 0.001 | 0.187 | 0.035 | 0.948 |
| 1.385442360233108 | 0.983 | 0.966 | 0.001 | 0.184 | 0.034 | 0.949 |
| 1.388583952886698 | 0.983 | 0.967 | 0.001 | 0.181 | 0.033 | 0.951 |
| 1.391725545540288 | 0.984 | 0.968 | 0.001 | 0.178 | 0.032 | 0.953 |
| 1.394867138193878 | 0.985 | 0.969 | 0.001 | 0.175 | 0.031 | 0.954 |
| 1.398008730847468 | 0.985 | 0.97 | 0.001 | 0.172 | 0.03 | 0.956 |
| 1.401150323501057 | 0.986 | 0.971 | 0.001 | 0.169 | 0.029 | 0.958 |
| 1.404291916154647 | 0.986 | 0.973 | 0.001 | 0.166 | 0.027 | 0.959 |
| 1.407433508808237 | 0.987 | 0.974 | 0.001 | 0.163 | 0.026 | 0.961 |
| 1.410575101461827 | 0.987 | 0.975 | 0.001 | 0.16 | 0.025 | 0.962 |
| 1.413716694115417 | 0.988 | 0.976 | 0.001 | 0.156 | 0.024 | 0.964 |
| 1.416858286769006 | 0.988 | 0.976 | 0.001 | 0.153 | 0.024 | 0.965 |
| 1.419999879422596 | 0.989 | 0.977 | 0.001 | 0.15 | 0.023 | 0.966 |
| 1.423141472076186 | 0.989 | 0.978 | 0 | 0.147 | 0.022 | 0.968 |
| 1.426283064729776 | 0.99 | 0.979 | 0 | 0.144 | 0.021 | 0.969 |
| 1.429424657383366 | 0.99 | 0.98 | 0 | 0.141 | 0.02 | 0.97 |
| 1.432566250036956 | 0.99 | 0.981 | 0 | 0.138 | 0.019 | 0.972 |
| 1.435707842690545 | 0.991 | 0.982 | 0 | 0.135 | 0.018 | 0.973 |
| 1.438849435344135 | 0.991 | 0.983 | 0 | 0.132 | 0.017 | 0.974 |
| 1.441991027997725 | 0.992 | 0.984 | 0 | 0.128 | 0.016 | 0.975 |
| 1.445132620651315 | 0.992 | 0.984 | 0 | 0.125 | 0.016 | 0.977 |
| 1.448274213304905 | 0.993 | 0.985 | 0 | 0.122 | 0.015 | 0.978 |
| 1.451415805958494 | 0.993 | 0.986 | 0 | 0.119 | 0.014 | 0.979 |
| 1.454557398612084 | 0.993 | 0.987 | 0 | 0.116 | 0.013 | 0.98 |
| 1.457698991265674 | 0.994 | 0.987 | 0 | 0.113 | 0.013 | 0.981 |
| 1.460840583919264 | 0.994 | 0.988 | 0 | 0.11 | 0.012 | 0.982 |
| 1.463982176572854 | 0.994 | 0.989 | 0 | 0.107 | 0.011 | 0.983 |
| 1.467123769226444 | 0.995 | 0.989 | 0 | 0.103 | 0.011 | 0.984 |
| 1.470265361880033 | 0.995 | 0.99 | 0 | 0.1 | 0.01 | 0.985 |
| 1.473406954533623 | 0.995 | 0.991 | 0 | 0.097 | 0.009 | 0.986 |
| 1.476548547187213 | 0.996 | 0.991 | 0 | 0.094 | 0.009 | 0.987 |
| 1.479690139840803 | 0.996 | 0.992 | 0 | 0.091 | 0.008 | 0.988 |
| 1.482831732494393 | 0.996 | 0.992 | 0 | 0.088 | 0.008 | 0.988 |
| 1.485973325147982 | 0.996 | 0.993 | 0 | 0.085 | 0.007 | 0.989 |
| 1.489114917801572 | 0.997 | 0.993 | 0 | 0.082 | 0.007 | 0.99 |
| 1.492256510455162 | 0.997 | 0.994 | 0 | 0.078 | 0.006 | 0.991 |
| 1.495398103108752 | 0.997 | 0.994 | 0 | 0.075 | 0.006 | 0.992 |
| 1.498539695762342 | 0.997 | 0.995 | 0 | 0.072 | 0.005 | 0.992 |
| 1.501681288415932 | 0.998 | 0.995 | 0 | 0.069 | 0.005 | 0.993 |
| 1.504822881069521 | 0.998 | 0.996 | 0 | 0.066 | 0.004 | 0.993 |
| 1.507964473723111 | 0.998 | 0.996 | 0 | 0.063 | 0.004 | 0.994 |
| 1.511106066376701 | 0.998 | 0.996 | 0 | 0.06 | 0.004 | 0.995 |
| 1.514247659030291 | 0.998 | 0.997 | 0 | 0.057 | 0.003 | 0.995 |
| 1.517389251683881 | 0.999 | 0.997 | 0 | 0.053 | 0.003 | 0.996 |
| 1.520530844337471 | 0.999 | 0.997 | 0 | 0.05 | 0.003 | 0.996 |
| 1.52367243699106 | 0.999 | 0.998 | 0 | 0.047 | 0.002 | 0.997 |
| 1.52681402964465 | 0.999 | 0.998 | 0 | 0.044 | 0.002 | 0.997 |
| 1.52995562229824 | 0.999 | 0.998 | 0 | 0.041 | 0.002 | 0.998 |
| 1.53309721495183 | 0.999 | 0.999 | 0 | 0.038 | 0.001 | 0.998 |
| 1.53623880760542 | 0.999 | 0.999 | 0 | 0.035 | 0.001 | 0.998 |
| 1.539380400259009 | 1 | 0.999 | 0 | 0.031 | 0.001 | 0.999 |
| 1.542521992912599 | 1 | 0.999 | 0 | 0.028 | 0.001 | 0.999 |
| 1.545663585566189 | 1 | 0.999 | 0 | 0.025 | 0.001 | 0.999 |
| 1.548805178219779 | 1 | 1 | 0 | 0.022 | 0 | 0.999 |
| 1.551946770873369 | 1 | 1 | 0 | 0.019 | 0 | 0.999 |
| 1.555088363526959 | 1 | 1 | 0 | 0.016 | 0 | 1 |
| 1.558229956180548 | 1 | 1 | 0 | 0.013 | 0 | 1 |
| 1.561371548834138 | 1 | 1 | 0 | 0.009 | 0 | 1 |
| 1.564513141487728 | 1 | 1 | 0 | 0.006 | 0 | 1 |
| 1.567654734141318 | 1 | 1 | 0 | 0.003 | 0 | 1 |
| 1.570796326794908 | 1 | 1 | 0 | 0 | 0 | 1 |
| 1.573937919448497 | 1 | 1 | 0 | -0.003 | 0 | 1 |
| 1.577079512102087 | 1 | 1 | 0 | -0.006 | 0 | 1 |
| 1.580221104755677 | 1 | 1 | 0 | -0.009 | 0 | 1 |
| 1.583362697409267 | 1 | 1 | 0 | -0.013 | 0 | 1 |
| 1.586504290062857 | 1 | 1 | 0 | -0.016 | 0 | 1 |
| 1.589645882716447 | 1 | 1 | 0 | -0.019 | 0 | 0.999 |
| 1.592787475370036 | 1 | 1 | 0 | -0.022 | 0 | 0.999 |
| 1.595929068023626 | 1 | 0.999 | 0 | -0.025 | 0.001 | 0.999 |
| 1.599070660677216 | 1 | 0.999 | 0 | -0.028 | 0.001 | 0.999 |
| 1.602212253330806 | 1 | 0.999 | 0 | -0.031 | 0.001 | 0.999 |
| 1.605353845984396 | 0.999 | 0.999 | 0 | -0.035 | 0.001 | 0.998 |
| 1.608495438637985 | 0.999 | 0.999 | 0 | -0.038 | 0.001 | 0.998 |
| 1.611637031291575 | 0.999 | 0.998 | 0 | -0.041 | 0.002 | 0.998 |
| 1.614778623945165 | 0.999 | 0.998 | 0 | -0.044 | 0.002 | 0.997 |
| 1.617920216598755 | 0.999 | 0.998 | 0 | -0.047 | 0.002 | 0.997 |
| 1.621061809252345 | 0.999 | 0.997 | 0 | -0.05 | 0.003 | 0.996 |
| 1.624203401905935 | 0.999 | 0.997 | 0 | -0.053 | 0.003 | 0.996 |
| 1.627344994559524 | 0.998 | 0.997 | 0 | -0.057 | 0.003 | 0.995 |
| 1.630486587213114 | 0.998 | 0.996 | 0 | -0.06 | 0.004 | 0.995 |
| 1.633628179866704 | 0.998 | 0.996 | 0 | -0.063 | 0.004 | 0.994 |
| 1.636769772520294 | 0.998 | 0.996 | 0 | -0.066 | 0.004 | 0.993 |
| 1.639911365173884 | 0.998 | 0.995 | 0 | -0.069 | 0.005 | 0.993 |
| 1.643052957827473 | 0.997 | 0.995 | 0 | -0.072 | 0.005 | 0.992 |
| 1.646194550481063 | 0.997 | 0.994 | 0 | -0.075 | 0.006 | 0.992 |
| 1.649336143134653 | 0.997 | 0.994 | 0 | -0.078 | 0.006 | 0.991 |
| 1.652477735788243 | 0.997 | 0.993 | 0 | -0.082 | 0.007 | 0.99 |
| 1.655619328441833 | 0.996 | 0.993 | 0 | -0.085 | 0.007 | 0.989 |
| 1.658760921095423 | 0.996 | 0.992 | 0 | -0.088 | 0.008 | 0.988 |
| 1.661902513749012 | 0.996 | 0.992 | 0 | -0.091 | 0.008 | 0.988 |
| 1.665044106402602 | 0.996 | 0.991 | 0 | -0.094 | 0.009 | 0.987 |
| 1.668185699056192 | 0.995 | 0.991 | 0 | -0.097 | 0.009 | 0.986 |
| 1.671327291709782 | 0.995 | 0.99 | 0 | -0.1 | 0.01 | 0.985 |
| 1.674468884363372 | 0.995 | 0.989 | 0 | -0.103 | 0.011 | 0.984 |
| 1.677610477016961 | 0.994 | 0.989 | 0 | -0.107 | 0.011 | 0.983 |
| 1.680752069670551 | 0.994 | 0.988 | 0 | -0.11 | 0.012 | 0.982 |
| 1.683893662324141 | 0.994 | 0.987 | 0 | -0.113 | 0.013 | 0.981 |
| 1.687035254977731 | 0.993 | 0.987 | 0 | -0.116 | 0.013 | 0.98 |
| 1.690176847631321 | 0.993 | 0.986 | 0 | -0.119 | 0.014 | 0.979 |
| 1.693318440284911 | 0.993 | 0.985 | 0 | -0.122 | 0.015 | 0.978 |
| 1.6964600329385 | 0.992 | 0.984 | 0 | -0.125 | 0.016 | 0.977 |
| 1.69960162559209 | 0.992 | 0.984 | 0 | -0.128 | 0.016 | 0.975 |
| 1.70274321824568 | 0.991 | 0.983 | 0 | -0.132 | 0.017 | 0.974 |
| 1.70588481089927 | 0.991 | 0.982 | 0 | -0.135 | 0.018 | 0.973 |
| 1.70902640355286 | 0.99 | 0.981 | 0 | -0.138 | 0.019 | 0.972 |
| 1.712167996206449 | 0.99 | 0.98 | 0 | -0.141 | 0.02 | 0.97 |
| 1.715309588860039 | 0.99 | 0.979 | 0 | -0.144 | 0.021 | 0.969 |
| 1.71845118151363 | 0.989 | 0.978 | 0 | -0.147 | 0.022 | 0.968 |
| 1.721592774167219 | 0.989 | 0.977 | 0.001 | -0.15 | 0.023 | 0.966 |
| 1.724734366820809 | 0.988 | 0.976 | 0.001 | -0.153 | 0.024 | 0.965 |
| 1.727875959474399 | 0.988 | 0.976 | 0.001 | -0.156 | 0.024 | 0.964 |
| 1.731017552127988 | 0.987 | 0.975 | 0.001 | -0.16 | 0.025 | 0.962 |
| 1.734159144781578 | 0.987 | 0.974 | 0.001 | -0.163 | 0.026 | 0.961 |
| 1.737300737435168 | 0.986 | 0.973 | 0.001 | -0.166 | 0.027 | 0.959 |
| 1.740442330088758 | 0.986 | 0.971 | 0.001 | -0.169 | 0.029 | 0.958 |
| 1.743583922742348 | 0.985 | 0.97 | 0.001 | -0.172 | 0.03 | 0.956 |
| 1.746725515395937 | 0.985 | 0.969 | 0.001 | -0.175 | 0.031 | 0.954 |
| 1.749867108049527 | 0.984 | 0.968 | 0.001 | -0.178 | 0.032 | 0.953 |
| 1.753008700703117 | 0.983 | 0.967 | 0.001 | -0.181 | 0.033 | 0.951 |
| 1.756150293356707 | 0.983 | 0.966 | 0.001 | -0.184 | 0.034 | 0.949 |
| 1.759291886010297 | 0.982 | 0.965 | 0.001 | -0.187 | 0.035 | 0.948 |
| 1.762433478663887 | 0.982 | 0.964 | 0.001 | -0.19 | 0.036 | 0.946 |
| 1.765575071317476 | 0.981 | 0.963 | 0.001 | -0.194 | 0.037 | 0.944 |
| 1.768716663971066 | 0.98 | 0.961 | 0.001 | -0.197 | 0.039 | 0.943 |
| 1.771858256624656 | 0.98 | 0.96 | 0.002 | -0.2 | 0.04 | 0.941 |
| 1.774999849278246 | 0.979 | 0.959 | 0.002 | -0.203 | 0.041 | 0.939 |
| 1.778141441931836 | 0.979 | 0.958 | 0.002 | -0.206 | 0.042 | 0.937 |
| 1.781283034585426 | 0.978 | 0.956 | 0.002 | -0.209 | 0.044 | 0.935 |
| 1.784424627239015 | 0.977 | 0.955 | 0.002 | -0.212 | 0.045 | 0.933 |
| 1.787566219892605 | 0.977 | 0.954 | 0.002 | -0.215 | 0.046 | 0.931 |
| 1.790707812546195 | 0.976 | 0.952 | 0.002 | -0.218 | 0.048 | 0.929 |
| 1.793849405199785 | 0.975 | 0.951 | 0.002 | -0.221 | 0.049 | 0.928 |
| 1.796990997853375 | 0.975 | 0.95 | 0.003 | -0.224 | 0.05 | 0.926 |
| 1.800132590506964 | 0.974 | 0.948 | 0.003 | -0.227 | 0.052 | 0.923 |
| 1.803274183160554 | 0.973 | 0.947 | 0.003 | -0.23 | 0.053 | 0.921 |
| 1.806415775814144 | 0.972 | 0.946 | 0.003 | -0.233 | 0.054 | 0.919 |
| 1.809557368467734 | 0.972 | 0.944 | 0.003 | -0.236 | 0.056 | 0.917 |
| 1.812698961121324 | 0.971 | 0.943 | 0.003 | -0.24 | 0.057 | 0.915 |
| 1.815840553774914 | 0.97 | 0.941 | 0.003 | -0.243 | 0.059 | 0.913 |
| 1.818982146428503 | 0.969 | 0.94 | 0.004 | -0.246 | 0.06 | 0.911 |
| 1.822123739082093 | 0.969 | 0.938 | 0.004 | -0.249 | 0.062 | 0.909 |
| 1.825265331735683 | 0.968 | 0.937 | 0.004 | -0.252 | 0.063 | 0.906 |
| 1.828406924389273 | 0.967 | 0.935 | 0.004 | -0.255 | 0.065 | 0.904 |
| 1.831548517042863 | 0.966 | 0.934 | 0.004 | -0.258 | 0.066 | 0.902 |
| 1.834690109696452 | 0.965 | 0.932 | 0.005 | -0.261 | 0.068 | 0.9 |
| 1.837831702350042 | 0.965 | 0.93 | 0.005 | -0.264 | 0.07 | 0.897 |
| 1.840973295003632 | 0.964 | 0.929 | 0.005 | -0.267 | 0.071 | 0.895 |
| 1.844114887657222 | 0.963 | 0.927 | 0.005 | -0.27 | 0.073 | 0.893 |
| 1.847256480310812 | 0.962 | 0.925 | 0.006 | -0.273 | 0.075 | 0.89 |
| 1.850398072964402 | 0.961 | 0.924 | 0.006 | -0.276 | 0.076 | 0.888 |
| 1.853539665617991 | 0.96 | 0.922 | 0.006 | -0.279 | 0.078 | 0.886 |
| 1.856681258271581 | 0.959 | 0.92 | 0.006 | -0.282 | 0.08 | 0.883 |
| 1.859822850925171 | 0.959 | 0.919 | 0.007 | -0.285 | 0.081 | 0.881 |
| 1.862964443578761 | 0.958 | 0.917 | 0.007 | -0.288 | 0.083 | 0.878 |
| 1.866106036232351 | 0.957 | 0.915 | 0.007 | -0.291 | 0.085 | 0.876 |
| 1.86924762888594 | 0.956 | 0.914 | 0.007 | -0.294 | 0.086 | 0.873 |
| 1.87238922153953 | 0.955 | 0.912 | 0.008 | -0.297 | 0.088 | 0.871 |
| 1.87553081419312 | 0.954 | 0.91 | 0.008 | -0.3 | 0.09 | 0.868 |
| 1.87867240684671 | 0.953 | 0.908 | 0.008 | -0.303 | 0.092 | 0.865 |
| 1.8818139995003 | 0.952 | 0.906 | 0.009 | -0.306 | 0.094 | 0.863 |
| 1.88495559215389 | 0.951 | 0.905 | 0.009 | -0.309 | 0.095 | 0.86 |
| 1.888097184807479 | 0.95 | 0.903 | 0.009 | -0.312 | 0.097 | 0.858 |
| 1.891238777461069 | 0.949 | 0.901 | 0.01 | -0.315 | 0.099 | 0.855 |
| 1.89438037011466 | 0.948 | 0.899 | 0.01 | -0.318 | 0.101 | 0.852 |
| 1.897521962768249 | 0.947 | 0.897 | 0.011 | -0.321 | 0.103 | 0.85 |
| 1.900663555421839 | 0.946 | 0.895 | 0.011 | -0.324 | 0.105 | 0.847 |
| 1.903805148075429 | 0.945 | 0.893 | 0.011 | -0.327 | 0.107 | 0.844 |
| 1.906946740729018 | 0.944 | 0.891 | 0.012 | -0.33 | 0.109 | 0.841 |
| 1.910088333382608 | 0.943 | 0.889 | 0.012 | -0.333 | 0.111 | 0.839 |
| 1.913229926036198 | 0.942 | 0.887 | 0.013 | -0.336 | 0.113 | 0.836 |
| 1.916371518689788 | 0.941 | 0.885 | 0.013 | -0.339 | 0.115 | 0.833 |
| 1.919513111343378 | 0.94 | 0.883 | 0.014 | -0.342 | 0.117 | 0.83 |
| 1.922654703996967 | 0.939 | 0.881 | 0.014 | -0.345 | 0.119 | 0.827 |
| 1.925796296650557 | 0.938 | 0.879 | 0.015 | -0.348 | 0.121 | 0.824 |
| 1.928937889304147 | 0.937 | 0.877 | 0.015 | -0.351 | 0.123 | 0.821 |
| 1.932079481957737 | 0.935 | 0.875 | 0.016 | -0.353 | 0.125 | 0.819 |
| 1.935221074611327 | 0.934 | 0.873 | 0.016 | -0.356 | 0.127 | 0.816 |
| 1.938362667264917 | 0.933 | 0.871 | 0.017 | -0.359 | 0.129 | 0.813 |
| 1.941504259918506 | 0.932 | 0.869 | 0.017 | -0.362 | 0.131 | 0.81 |
| 1.944645852572096 | 0.931 | 0.867 | 0.018 | -0.365 | 0.133 | 0.807 |
| 1.947787445225686 | 0.93 | 0.864 | 0.018 | -0.368 | 0.136 | 0.804 |
| 1.950929037879276 | 0.929 | 0.862 | 0.019 | -0.371 | 0.138 | 0.801 |
| 1.954070630532866 | 0.927 | 0.86 | 0.02 | -0.374 | 0.14 | 0.798 |
| 1.957212223186455 | 0.926 | 0.858 | 0.02 | -0.377 | 0.142 | 0.795 |
| 1.960353815840045 | 0.925 | 0.856 | 0.021 | -0.38 | 0.144 | 0.792 |
| 1.963495408493635 | 0.924 | 0.854 | 0.021 | -0.383 | 0.146 | 0.789 |
| 1.966637001147225 | 0.923 | 0.851 | 0.022 | -0.386 | 0.149 | 0.785 |
| 1.969778593800815 | 0.921 | 0.849 | 0.023 | -0.388 | 0.151 | 0.782 |
| 1.972920186454405 | 0.92 | 0.847 | 0.023 | -0.391 | 0.153 | 0.779 |
| 1.976061779107994 | 0.919 | 0.845 | 0.024 | -0.394 | 0.155 | 0.776 |
| 1.979203371761584 | 0.918 | 0.842 | 0.025 | -0.397 | 0.158 | 0.773 |
| 1.982344964415174 | 0.917 | 0.84 | 0.026 | -0.4 | 0.16 | 0.77 |
| 1.985486557068764 | 0.915 | 0.838 | 0.026 | -0.403 | 0.162 | 0.767 |
| 1.988628149722354 | 0.914 | 0.835 | 0.027 | -0.406 | 0.165 | 0.763 |
| 1.991769742375943 | 0.913 | 0.833 | 0.028 | -0.409 | 0.167 | 0.76 |
| 1.994911335029533 | 0.911 | 0.831 | 0.029 | -0.412 | 0.169 | 0.757 |
| 1.998052927683123 | 0.91 | 0.828 | 0.029 | -0.414 | 0.172 | 0.754 |
| 2.001194520336712 | 0.909 | 0.826 | 0.03 | -0.417 | 0.174 | 0.751 |
| 2.004336112990302 | 0.907 | 0.824 | 0.031 | -0.42 | 0.176 | 0.747 |
| 2.007477705643892 | 0.906 | 0.821 | 0.032 | -0.423 | 0.179 | 0.744 |
| 2.010619298297482 | 0.905 | 0.819 | 0.033 | -0.426 | 0.181 | 0.741 |
| 2.013760890951071 | 0.903 | 0.816 | 0.034 | -0.429 | 0.184 | 0.738 |
| 2.016902483604661 | 0.902 | 0.814 | 0.035 | -0.431 | 0.186 | 0.734 |
| 2.02004407625825 | 0.901 | 0.811 | 0.036 | -0.434 | 0.189 | 0.731 |
| 2.02318566891184 | 0.899 | 0.809 | 0.037 | -0.437 | 0.191 | 0.728 |
| 2.02632726156543 | 0.898 | 0.806 | 0.037 | -0.44 | 0.194 | 0.724 |
| 2.029468854219019 | 0.897 | 0.804 | 0.038 | -0.443 | 0.196 | 0.721 |
| 2.032610446872609 | 0.895 | 0.801 | 0.039 | -0.446 | 0.199 | 0.718 |
| 2.035752039526198 | 0.894 | 0.799 | 0.04 | -0.448 | 0.201 | 0.714 |
| 2.038893632179788 | 0.892 | 0.796 | 0.041 | -0.451 | 0.204 | 0.711 |
| 2.042035224833378 | 0.891 | 0.794 | 0.042 | -0.454 | 0.206 | 0.707 |
| 2.045176817486967 | 0.89 | 0.791 | 0.044 | -0.457 | 0.209 | 0.704 |
| 2.048318410140557 | 0.888 | 0.789 | 0.045 | -0.46 | 0.211 | 0.701 |
| 2.051460002794146 | 0.887 | 0.786 | 0.046 | -0.462 | 0.214 | 0.697 |
| 2.054601595447736 | 0.885 | 0.784 | 0.047 | -0.465 | 0.216 | 0.694 |
| 2.057743188101325 | 0.884 | 0.781 | 0.048 | -0.468 | 0.219 | 0.69 |
| 2.060884780754915 | 0.882 | 0.778 | 0.049 | -0.471 | 0.222 | 0.687 |
| 2.064026373408505 | 0.881 | 0.776 | 0.05 | -0.473 | 0.224 | 0.683 |
| 2.067167966062094 | 0.879 | 0.773 | 0.051 | -0.476 | 0.227 | 0.68 |
| 2.070309558715684 | 0.878 | 0.771 | 0.053 | -0.479 | 0.229 | 0.676 |
| 2.073451151369273 | 0.876 | 0.768 | 0.054 | -0.482 | 0.232 | 0.673 |
| 2.076592744022863 | 0.875 | 0.765 | 0.055 | -0.485 | 0.235 | 0.669 |
| 2.079734336676452 | 0.873 | 0.763 | 0.056 | -0.487 | 0.237 | 0.666 |
| 2.082875929330042 | 0.872 | 0.76 | 0.058 | -0.49 | 0.24 | 0.662 |
| 2.086017521983632 | 0.87 | 0.757 | 0.059 | -0.493 | 0.243 | 0.659 |
| 2.089159114637221 | 0.869 | 0.755 | 0.06 | -0.495 | 0.245 | 0.655 |
| 2.092300707290811 | 0.867 | 0.752 | 0.062 | -0.498 | 0.248 | 0.652 |
| 2.095442299944401 | 0.866 | 0.749 | 0.063 | -0.501 | 0.251 | 0.648 |
| 2.09858389259799 | 0.864 | 0.746 | 0.064 | -0.504 | 0.254 | 0.645 |
| 2.10172548525158 | 0.862 | 0.744 | 0.066 | -0.506 | 0.256 | 0.641 |
| 2.104867077905169 | 0.861 | 0.741 | 0.067 | -0.509 | 0.259 | 0.638 |
| 2.108008670558759 | 0.859 | 0.738 | 0.069 | -0.512 | 0.262 | 0.634 |
| 2.111150263212349 | 0.858 | 0.735 | 0.07 | -0.514 | 0.265 | 0.631 |
| 2.114291855865938 | 0.856 | 0.733 | 0.072 | -0.517 | 0.267 | 0.627 |
| 2.117433448519528 | 0.854 | 0.73 | 0.073 | -0.52 | 0.27 | 0.623 |
| 2.120575041173117 | 0.853 | 0.727 | 0.075 | -0.522 | 0.273 | 0.62 |
| 2.123716633826707 | 0.851 | 0.724 | 0.076 | -0.525 | 0.276 | 0.616 |
| 2.126858226480297 | 0.849 | 0.721 | 0.078 | -0.528 | 0.279 | 0.613 |
| 2.129999819133886 | 0.848 | 0.719 | 0.079 | -0.531 | 0.281 | 0.609 |
| 2.133141411787476 | 0.846 | 0.716 | 0.081 | -0.533 | 0.284 | 0.606 |
| 2.136283004441065 | 0.844 | 0.713 | 0.082 | -0.536 | 0.287 | 0.602 |
| 2.139424597094655 | 0.843 | 0.71 | 0.084 | -0.538 | 0.29 | 0.598 |
| 2.142566189748245 | 0.841 | 0.707 | 0.086 | -0.541 | 0.293 | 0.595 |
| 2.145707782401834 | 0.839 | 0.704 | 0.087 | -0.544 | 0.296 | 0.591 |
| 2.148849375055424 | 0.838 | 0.701 | 0.089 | -0.546 | 0.299 | 0.587 |
| 2.151990967709013 | 0.836 | 0.699 | 0.091 | -0.549 | 0.301 | 0.584 |
| 2.155132560362603 | 0.834 | 0.696 | 0.093 | -0.552 | 0.304 | 0.58 |
| 2.158274153016193 | 0.832 | 0.693 | 0.094 | -0.554 | 0.307 | 0.577 |
| 2.161415745669782 | 0.831 | 0.69 | 0.096 | -0.557 | 0.31 | 0.573 |
| 2.164557338323372 | 0.829 | 0.687 | 0.098 | -0.559 | 0.313 | 0.569 |
| 2.167698930976961 | 0.827 | 0.684 | 0.1 | -0.562 | 0.316 | 0.566 |
| 2.170840523630551 | 0.825 | 0.681 | 0.102 | -0.565 | 0.319 | 0.562 |
| 2.173982116284141 | 0.824 | 0.678 | 0.104 | -0.567 | 0.322 | 0.559 |
| 2.17712370893773 | 0.822 | 0.675 | 0.105 | -0.57 | 0.325 | 0.555 |
| 2.18026530159132 | 0.82 | 0.672 | 0.107 | -0.572 | 0.328 | 0.551 |
| 2.183406894244909 | 0.818 | 0.669 | 0.109 | -0.575 | 0.331 | 0.548 |
| 2.186548486898499 | 0.816 | 0.666 | 0.111 | -0.578 | 0.334 | 0.544 |
| 2.189690079552089 | 0.815 | 0.663 | 0.113 | -0.58 | 0.337 | 0.54 |
| 2.192831672205678 | 0.813 | 0.66 | 0.115 | -0.583 | 0.34 | 0.537 |
| 2.195973264859268 | 0.811 | 0.657 | 0.117 | -0.585 | 0.343 | 0.533 |
| 2.199114857512857 | 0.809 | 0.655 | 0.119 | -0.588 | 0.345 | 0.53 |
| 2.202256450166447 | 0.807 | 0.652 | 0.121 | -0.59 | 0.348 | 0.526 |
| 2.205398042820036 | 0.805 | 0.649 | 0.124 | -0.593 | 0.351 | 0.522 |
| 2.208539635473626 | 0.803 | 0.646 | 0.126 | -0.595 | 0.354 | 0.519 |
| 2.211681228127216 | 0.802 | 0.643 | 0.128 | -0.598 | 0.357 | 0.515 |
| 2.214822820780805 | 0.8 | 0.639 | 0.13 | -0.6 | 0.361 | 0.511 |
| 2.217964413434395 | 0.798 | 0.636 | 0.132 | -0.603 | 0.364 | 0.508 |
| 2.221106006087984 | 0.796 | 0.633 | 0.134 | -0.605 | 0.367 | 0.504 |
| 2.224247598741574 | 0.794 | 0.63 | 0.137 | -0.608 | 0.37 | 0.501 |
| 2.227389191395164 | 0.792 | 0.627 | 0.139 | -0.61 | 0.373 | 0.497 |
| 2.230530784048753 | 0.79 | 0.624 | 0.141 | -0.613 | 0.376 | 0.493 |
| 2.233672376702343 | 0.788 | 0.621 | 0.143 | -0.615 | 0.379 | 0.49 |
| 2.236813969355933 | 0.786 | 0.618 | 0.146 | -0.618 | 0.382 | 0.486 |
| 2.239955562009522 | 0.784 | 0.615 | 0.148 | -0.62 | 0.385 | 0.483 |
| 2.243097154663112 | 0.782 | 0.612 | 0.15 | -0.623 | 0.388 | 0.479 |
| 2.246238747316701 | 0.78 | 0.609 | 0.153 | -0.625 | 0.391 | 0.475 |
| 2.249380339970291 | 0.778 | 0.606 | 0.155 | -0.628 | 0.394 | 0.472 |
| 2.252521932623881 | 0.776 | 0.603 | 0.158 | -0.63 | 0.397 | 0.468 |
| 2.25566352527747 | 0.775 | 0.6 | 0.16 | -0.633 | 0.4 | 0.465 |
| 2.25880511793106 | 0.773 | 0.597 | 0.163 | -0.635 | 0.403 | 0.461 |
| 2.261946710584649 | 0.771 | 0.594 | 0.165 | -0.637 | 0.406 | 0.457 |
| 2.265088303238239 | 0.769 | 0.591 | 0.168 | -0.64 | 0.409 | 0.454 |
| 2.268229895891829 | 0.766 | 0.588 | 0.17 | -0.642 | 0.412 | 0.45 |
| 2.271371488545418 | 0.764 | 0.584 | 0.173 | -0.645 | 0.416 | 0.447 |
| 2.274513081199008 | 0.762 | 0.581 | 0.175 | -0.647 | 0.419 | 0.443 |
| 2.277654673852597 | 0.76 | 0.578 | 0.178 | -0.649 | 0.422 | 0.44 |
| 2.280796266506186 | 0.758 | 0.575 | 0.181 | -0.652 | 0.425 | 0.436 |
| 2.283937859159776 | 0.756 | 0.572 | 0.183 | -0.654 | 0.428 | 0.433 |
| 2.287079451813366 | 0.754 | 0.569 | 0.186 | -0.657 | 0.431 | 0.429 |
| 2.290221044466955 | 0.752 | 0.566 | 0.189 | -0.659 | 0.434 | 0.426 |
| 2.293362637120545 | 0.75 | 0.563 | 0.191 | -0.661 | 0.437 | 0.422 |
| 2.296504229774135 | 0.748 | 0.56 | 0.194 | -0.664 | 0.44 | 0.419 |
| 2.299645822427724 | 0.746 | 0.556 | 0.197 | -0.666 | 0.444 | 0.415 |
| 2.302787415081314 | 0.744 | 0.553 | 0.2 | -0.668 | 0.447 | 0.412 |
| 2.305929007734904 | 0.742 | 0.55 | 0.202 | -0.671 | 0.45 | 0.408 |
| 2.309070600388493 | 0.74 | 0.547 | 0.205 | -0.673 | 0.453 | 0.405 |
| 2.312212193042083 | 0.738 | 0.544 | 0.208 | -0.675 | 0.456 | 0.401 |
| 2.315353785695672 | 0.735 | 0.541 | 0.211 | -0.678 | 0.459 | 0.398 |
| 2.318495378349262 | 0.733 | 0.538 | 0.214 | -0.68 | 0.462 | 0.394 |
| 2.321636971002852 | 0.731 | 0.535 | 0.217 | -0.682 | 0.465 | 0.391 |
| 2.324778563656441 | 0.729 | 0.531 | 0.22 | -0.685 | 0.469 | 0.387 |
| 2.327920156310031 | 0.727 | 0.528 | 0.223 | -0.687 | 0.472 | 0.384 |
| 2.33106174896362 | 0.725 | 0.525 | 0.226 | -0.689 | 0.475 | 0.381 |
| 2.33420334161721 | 0.722 | 0.522 | 0.228 | -0.691 | 0.478 | 0.377 |
| 2.3373449342708 | 0.72 | 0.519 | 0.232 | -0.694 | 0.481 | 0.374 |
| 2.340486526924389 | 0.718 | 0.516 | 0.235 | -0.696 | 0.484 | 0.37 |
| 2.343628119577979 | 0.716 | 0.513 | 0.238 | -0.698 | 0.487 | 0.367 |
| 2.346769712231568 | 0.714 | 0.509 | 0.241 | -0.7 | 0.491 | 0.364 |
| 2.349911304885158 | 0.712 | 0.506 | 0.244 | -0.703 | 0.494 | 0.36 |
| 2.353052897538748 | 0.709 | 0.503 | 0.247 | -0.705 | 0.497 | 0.357 |
| 2.356194490192337 | 0.707 | 0.5 | 0.25 | -0.707 | 0.5 | 0.354 |
| 2.359336082845927 | 0.705 | 0.497 | 0.253 | -0.709 | 0.503 | 0.35 |
| 2.362477675499516 | 0.703 | 0.494 | 0.256 | -0.712 | 0.506 | 0.347 |
| 2.365619268153106 | 0.7 | 0.491 | 0.26 | -0.714 | 0.509 | 0.344 |
| 2.368760860806696 | 0.698 | 0.487 | 0.263 | -0.716 | 0.513 | 0.34 |
| 2.371902453460285 | 0.696 | 0.484 | 0.266 | -0.718 | 0.516 | 0.337 |
| 2.375044046113875 | 0.694 | 0.481 | 0.269 | -0.72 | 0.519 | 0.334 |
| 2.378185638767464 | 0.691 | 0.478 | 0.272 | -0.722 | 0.522 | 0.33 |
| 2.381327231421054 | 0.689 | 0.475 | 0.276 | -0.725 | 0.525 | 0.327 |
| 2.384468824074644 | 0.687 | 0.472 | 0.279 | -0.727 | 0.528 | 0.324 |
| 2.387610416728233 | 0.685 | 0.469 | 0.282 | -0.729 | 0.531 | 0.321 |
| 2.390752009381823 | 0.682 | 0.465 | 0.286 | -0.731 | 0.535 | 0.318 |
| 2.393893602035412 | 0.68 | 0.462 | 0.289 | -0.733 | 0.538 | 0.314 |
| 2.397035194689002 | 0.678 | 0.459 | 0.292 | -0.735 | 0.541 | 0.311 |
| 2.400176787342591 | 0.675 | 0.456 | 0.296 | -0.738 | 0.544 | 0.308 |
| 2.403318379996181 | 0.673 | 0.453 | 0.299 | -0.74 | 0.547 | 0.305 |
| 2.406459972649771 | 0.671 | 0.45 | 0.303 | -0.742 | 0.55 | 0.302 |
| 2.40960156530336 | 0.668 | 0.447 | 0.306 | -0.744 | 0.553 | 0.299 |
| 2.41274315795695 | 0.666 | 0.444 | 0.31 | -0.746 | 0.556 | 0.295 |
| 2.41588475061054 | 0.664 | 0.44 | 0.313 | -0.748 | 0.56 | 0.292 |
| 2.419026343264129 | 0.661 | 0.437 | 0.317 | -0.75 | 0.563 | 0.289 |
| 2.422167935917719 | 0.659 | 0.434 | 0.32 | -0.752 | 0.566 | 0.286 |
| 2.425309528571308 | 0.657 | 0.431 | 0.324 | -0.754 | 0.569 | 0.283 |
| 2.428451121224898 | 0.654 | 0.428 | 0.327 | -0.756 | 0.572 | 0.28 |
| 2.431592713878488 | 0.652 | 0.425 | 0.331 | -0.758 | 0.575 | 0.277 |
| 2.434734306532077 | 0.649 | 0.422 | 0.334 | -0.76 | 0.578 | 0.274 |
| 2.437875899185667 | 0.647 | 0.419 | 0.338 | -0.762 | 0.581 | 0.271 |
| 2.441017491839256 | 0.645 | 0.416 | 0.342 | -0.764 | 0.584 | 0.268 |
| 2.444159084492846 | 0.642 | 0.412 | 0.345 | -0.766 | 0.588 | 0.265 |
| 2.447300677146435 | 0.64 | 0.409 | 0.349 | -0.769 | 0.591 | 0.262 |
| 2.450442269800025 | 0.637 | 0.406 | 0.352 | -0.771 | 0.594 | 0.259 |
| 2.453583862453615 | 0.635 | 0.403 | 0.356 | -0.773 | 0.597 | 0.256 |
| 2.456725455107204 | 0.633 | 0.4 | 0.36 | -0.775 | 0.6 | 0.253 |
| 2.459867047760794 | 0.63 | 0.397 | 0.364 | -0.776 | 0.603 | 0.25 |
| 2.463008640414384 | 0.628 | 0.394 | 0.367 | -0.778 | 0.606 | 0.247 |
| 2.466150233067973 | 0.625 | 0.391 | 0.371 | -0.78 | 0.609 | 0.244 |
| 2.469291825721563 | 0.623 | 0.388 | 0.375 | -0.782 | 0.612 | 0.242 |
| 2.472433418375152 | 0.62 | 0.385 | 0.378 | -0.784 | 0.615 | 0.239 |
| 2.475575011028742 | 0.618 | 0.382 | 0.382 | -0.786 | 0.618 | 0.236 |
| 2.478716603682332 | 0.615 | 0.379 | 0.386 | -0.788 | 0.621 | 0.233 |
| 2.481858196335921 | 0.613 | 0.376 | 0.39 | -0.79 | 0.624 | 0.23 |
| 2.48499978898951 | 0.61 | 0.373 | 0.394 | -0.792 | 0.627 | 0.227 |
| 2.4881413816431 | 0.608 | 0.37 | 0.397 | -0.794 | 0.63 | 0.225 |
| 2.49128297429669 | 0.605 | 0.367 | 0.401 | -0.796 | 0.633 | 0.222 |
| 2.49442456695028 | 0.603 | 0.364 | 0.405 | -0.798 | 0.636 | 0.219 |
| 2.497566159603869 | 0.6 | 0.361 | 0.409 | -0.8 | 0.639 | 0.216 |
| 2.500707752257458 | 0.598 | 0.357 | 0.413 | -0.802 | 0.643 | 0.214 |
| 2.503849344911048 | 0.595 | 0.354 | 0.417 | -0.803 | 0.646 | 0.211 |
| 2.506990937564638 | 0.593 | 0.351 | 0.421 | -0.805 | 0.649 | 0.208 |
| 2.510132530218228 | 0.59 | 0.348 | 0.424 | -0.807 | 0.652 | 0.206 |
| 2.513274122871817 | 0.588 | 0.345 | 0.428 | -0.809 | 0.655 | 0.203 |
| 2.516415715525407 | 0.585 | 0.343 | 0.432 | -0.811 | 0.657 | 0.2 |
| 2.519557308178996 | 0.583 | 0.34 | 0.436 | -0.813 | 0.66 | 0.198 |
| 2.522698900832586 | 0.58 | 0.337 | 0.44 | -0.815 | 0.663 | 0.195 |
| 2.525840493486176 | 0.578 | 0.334 | 0.444 | -0.816 | 0.666 | 0.193 |
| 2.528982086139765 | 0.575 | 0.331 | 0.448 | -0.818 | 0.669 | 0.19 |
| 2.532123678793355 | 0.572 | 0.328 | 0.452 | -0.82 | 0.672 | 0.188 |
| 2.535265271446944 | 0.57 | 0.325 | 0.456 | -0.822 | 0.675 | 0.185 |
| 2.538406864100534 | 0.567 | 0.322 | 0.46 | -0.824 | 0.678 | 0.183 |
| 2.541548456754124 | 0.565 | 0.319 | 0.464 | -0.825 | 0.681 | 0.18 |
| 2.544690049407713 | 0.562 | 0.316 | 0.468 | -0.827 | 0.684 | 0.178 |
| 2.547831642061302 | 0.559 | 0.313 | 0.472 | -0.829 | 0.687 | 0.175 |
| 2.550973234714892 | 0.557 | 0.31 | 0.476 | -0.831 | 0.69 | 0.173 |
| 2.554114827368482 | 0.554 | 0.307 | 0.48 | -0.832 | 0.693 | 0.17 |
| 2.557256420022072 | 0.552 | 0.304 | 0.484 | -0.834 | 0.696 | 0.168 |
| 2.560398012675661 | 0.549 | 0.301 | 0.488 | -0.836 | 0.699 | 0.165 |
| 2.563539605329251 | 0.546 | 0.299 | 0.492 | -0.838 | 0.701 | 0.163 |
| 2.56668119798284 | 0.544 | 0.296 | 0.496 | -0.839 | 0.704 | 0.161 |
| 2.56982279063643 | 0.541 | 0.293 | 0.5 | -0.841 | 0.707 | 0.158 |
| 2.57296438329002 | 0.538 | 0.29 | 0.504 | -0.843 | 0.71 | 0.156 |
| 2.576105975943609 | 0.536 | 0.287 | 0.508 | -0.844 | 0.713 | 0.154 |
| 2.579247568597199 | 0.533 | 0.284 | 0.512 | -0.846 | 0.716 | 0.152 |
| 2.582389161250788 | 0.531 | 0.281 | 0.516 | -0.848 | 0.719 | 0.149 |
| 2.585530753904377 | 0.528 | 0.279 | 0.52 | -0.849 | 0.721 | 0.147 |
| 2.588672346557967 | 0.525 | 0.276 | 0.524 | -0.851 | 0.724 | 0.145 |
| 2.591813939211557 | 0.522 | 0.273 | 0.529 | -0.853 | 0.727 | 0.143 |
| 2.594955531865147 | 0.52 | 0.27 | 0.533 | -0.854 | 0.73 | 0.14 |
| 2.598097124518736 | 0.517 | 0.267 | 0.537 | -0.856 | 0.733 | 0.138 |
| 2.601238717172326 | 0.514 | 0.265 | 0.541 | -0.858 | 0.735 | 0.136 |
| 2.604380309825915 | 0.512 | 0.262 | 0.545 | -0.859 | 0.738 | 0.134 |
| 2.607521902479505 | 0.509 | 0.259 | 0.549 | -0.861 | 0.741 | 0.132 |
| 2.610663495133095 | 0.506 | 0.256 | 0.553 | -0.862 | 0.744 | 0.13 |
| 2.613805087786684 | 0.504 | 0.254 | 0.557 | -0.864 | 0.746 | 0.128 |
| 2.616946680440274 | 0.501 | 0.251 | 0.561 | -0.866 | 0.749 | 0.126 |
| 2.620088273093863 | 0.498 | 0.248 | 0.565 | -0.867 | 0.752 | 0.124 |
| 2.623229865747452 | 0.495 | 0.245 | 0.569 | -0.869 | 0.755 | 0.122 |
| 2.626371458401042 | 0.493 | 0.243 | 0.573 | -0.87 | 0.757 | 0.12 |
| 2.629513051054632 | 0.49 | 0.24 | 0.577 | -0.872 | 0.76 | 0.118 |
| 2.632654643708222 | 0.487 | 0.237 | 0.582 | -0.873 | 0.763 | 0.116 |
| 2.635796236361811 | 0.485 | 0.235 | 0.586 | -0.875 | 0.765 | 0.114 |
| 2.638937829015401 | 0.482 | 0.232 | 0.59 | -0.876 | 0.768 | 0.112 |
| 2.642079421668991 | 0.479 | 0.229 | 0.594 | -0.878 | 0.771 | 0.11 |
| 2.64522101432258 | 0.476 | 0.227 | 0.598 | -0.879 | 0.773 | 0.108 |
| 2.64836260697617 | 0.473 | 0.224 | 0.602 | -0.881 | 0.776 | 0.106 |
| 2.651504199629759 | 0.471 | 0.222 | 0.606 | -0.882 | 0.778 | 0.104 |
| 2.654645792283349 | 0.468 | 0.219 | 0.61 | -0.884 | 0.781 | 0.102 |
| 2.657787384936938 | 0.465 | 0.216 | 0.614 | -0.885 | 0.784 | 0.101 |
| 2.660928977590528 | 0.462 | 0.214 | 0.618 | -0.887 | 0.786 | 0.099 |
| 2.664070570244118 | 0.46 | 0.211 | 0.622 | -0.888 | 0.789 | 0.097 |
| 2.667212162897707 | 0.457 | 0.209 | 0.626 | -0.89 | 0.791 | 0.095 |
| 2.670353755551297 | 0.454 | 0.206 | 0.63 | -0.891 | 0.794 | 0.094 |
| 2.673495348204887 | 0.451 | 0.204 | 0.634 | -0.892 | 0.796 | 0.092 |
| 2.676636940858476 | 0.448 | 0.201 | 0.638 | -0.894 | 0.799 | 0.09 |
| 2.679778533512066 | 0.446 | 0.199 | 0.642 | -0.895 | 0.801 | 0.088 |
| 2.682920126165655 | 0.443 | 0.196 | 0.646 | -0.897 | 0.804 | 0.087 |
| 2.686061718819245 | 0.44 | 0.194 | 0.65 | -0.898 | 0.806 | 0.085 |
| 2.689203311472835 | 0.437 | 0.191 | 0.654 | -0.899 | 0.809 | 0.084 |
| 2.692344904126424 | 0.434 | 0.189 | 0.658 | -0.901 | 0.811 | 0.082 |
| 2.695486496780014 | 0.431 | 0.186 | 0.662 | -0.902 | 0.814 | 0.08 |
| 2.698628089433603 | 0.429 | 0.184 | 0.666 | -0.903 | 0.816 | 0.079 |
| 2.701769682087193 | 0.426 | 0.181 | 0.67 | -0.905 | 0.819 | 0.077 |
| 2.704911274740782 | 0.423 | 0.179 | 0.674 | -0.906 | 0.821 | 0.076 |
| 2.708052867394372 | 0.42 | 0.176 | 0.678 | -0.907 | 0.824 | 0.074 |
| 2.711194460047962 | 0.417 | 0.174 | 0.682 | -0.909 | 0.826 | 0.073 |
| 2.714336052701551 | 0.414 | 0.172 | 0.686 | -0.91 | 0.828 | 0.071 |
| 2.717477645355141 | 0.412 | 0.169 | 0.69 | -0.911 | 0.831 | 0.07 |
| 2.720619238008731 | 0.409 | 0.167 | 0.694 | -0.913 | 0.833 | 0.068 |
| 2.72376083066232 | 0.406 | 0.165 | 0.698 | -0.914 | 0.835 | 0.067 |
| 2.72690242331591 | 0.403 | 0.162 | 0.702 | -0.915 | 0.838 | 0.065 |
| 2.730044015969499 | 0.4 | 0.16 | 0.706 | -0.917 | 0.84 | 0.064 |
| 2.733185608623089 | 0.397 | 0.158 | 0.709 | -0.918 | 0.842 | 0.063 |
| 2.736327201276678 | 0.394 | 0.155 | 0.713 | -0.919 | 0.845 | 0.061 |
| 2.739468793930268 | 0.391 | 0.153 | 0.717 | -0.92 | 0.847 | 0.06 |
| 2.742610386583858 | 0.388 | 0.151 | 0.721 | -0.921 | 0.849 | 0.059 |
| 2.745751979237447 | 0.386 | 0.149 | 0.725 | -0.923 | 0.851 | 0.057 |
| 2.748893571891036 | 0.383 | 0.146 | 0.729 | -0.924 | 0.854 | 0.056 |
| 2.752035164544627 | 0.38 | 0.144 | 0.732 | -0.925 | 0.856 | 0.055 |
| 2.755176757198216 | 0.377 | 0.142 | 0.736 | -0.926 | 0.858 | 0.054 |
| 2.758318349851806 | 0.374 | 0.14 | 0.74 | -0.927 | 0.86 | 0.052 |
| 2.761459942505395 | 0.371 | 0.138 | 0.744 | -0.929 | 0.862 | 0.051 |
| 2.764601535158985 | 0.368 | 0.136 | 0.747 | -0.93 | 0.864 | 0.05 |
| 2.767743127812574 | 0.365 | 0.133 | 0.751 | -0.931 | 0.867 | 0.049 |
| 2.770884720466164 | 0.362 | 0.131 | 0.755 | -0.932 | 0.869 | 0.048 |
| 2.774026313119754 | 0.359 | 0.129 | 0.758 | -0.933 | 0.871 | 0.046 |
| 2.777167905773343 | 0.356 | 0.127 | 0.762 | -0.934 | 0.873 | 0.045 |
| 2.780309498426932 | 0.353 | 0.125 | 0.766 | -0.935 | 0.875 | 0.044 |
| 2.783451091080522 | 0.351 | 0.123 | 0.769 | -0.937 | 0.877 | 0.043 |
| 2.786592683734112 | 0.348 | 0.121 | 0.773 | -0.938 | 0.879 | 0.042 |
| 2.789734276387701 | 0.345 | 0.119 | 0.777 | -0.939 | 0.881 | 0.041 |
| 2.792875869041291 | 0.342 | 0.117 | 0.78 | -0.94 | 0.883 | 0.04 |
| 2.796017461694881 | 0.339 | 0.115 | 0.784 | -0.941 | 0.885 | 0.039 |
| 2.79915905434847 | 0.336 | 0.113 | 0.787 | -0.942 | 0.887 | 0.038 |
| 2.80230064700206 | 0.333 | 0.111 | 0.791 | -0.943 | 0.889 | 0.037 |
| 2.80544223965565 | 0.33 | 0.109 | 0.794 | -0.944 | 0.891 | 0.036 |
| 2.808583832309239 | 0.327 | 0.107 | 0.798 | -0.945 | 0.893 | 0.035 |
| 2.811725424962829 | 0.324 | 0.105 | 0.801 | -0.946 | 0.895 | 0.034 |
| 2.814867017616419 | 0.321 | 0.103 | 0.805 | -0.947 | 0.897 | 0.033 |
| 2.818008610270008 | 0.318 | 0.101 | 0.808 | -0.948 | 0.899 | 0.032 |
| 2.821150202923598 | 0.315 | 0.099 | 0.811 | -0.949 | 0.901 | 0.031 |
| 2.824291795577187 | 0.312 | 0.097 | 0.815 | -0.95 | 0.903 | 0.03 |
| 2.827433388230777 | 0.309 | 0.095 | 0.818 | -0.951 | 0.905 | 0.03 |
| 2.830574980884366 | 0.306 | 0.094 | 0.821 | -0.952 | 0.906 | 0.029 |
| 2.833716573537956 | 0.303 | 0.092 | 0.825 | -0.953 | 0.908 | 0.028 |
| 2.836858166191546 | 0.3 | 0.09 | 0.828 | -0.954 | 0.91 | 0.027 |
| 2.839999758845135 | 0.297 | 0.088 | 0.831 | -0.955 | 0.912 | 0.026 |
| 2.843141351498725 | 0.294 | 0.086 | 0.835 | -0.956 | 0.914 | 0.025 |
| 2.846282944152314 | 0.291 | 0.085 | 0.838 | -0.957 | 0.915 | 0.025 |
| 2.849424536805904 | 0.288 | 0.083 | 0.841 | -0.958 | 0.917 | 0.024 |
| 2.852566129459494 | 0.285 | 0.081 | 0.844 | -0.959 | 0.919 | 0.023 |
| 2.855707722113083 | 0.282 | 0.08 | 0.847 | -0.959 | 0.92 | 0.022 |
| 2.858849314766673 | 0.279 | 0.078 | 0.85 | -0.96 | 0.922 | 0.022 |
| 2.861990907420262 | 0.276 | 0.076 | 0.853 | -0.961 | 0.924 | 0.021 |
| 2.865132500073852 | 0.273 | 0.075 | 0.857 | -0.962 | 0.925 | 0.02 |
| 2.868274092727442 | 0.27 | 0.073 | 0.86 | -0.963 | 0.927 | 0.02 |
| 2.871415685381031 | 0.267 | 0.071 | 0.863 | -0.964 | 0.929 | 0.019 |
| 2.874557278034621 | 0.264 | 0.07 | 0.866 | -0.965 | 0.93 | 0.018 |
| 2.87769887068821 | 0.261 | 0.068 | 0.869 | -0.965 | 0.932 | 0.018 |
| 2.8808404633418 | 0.258 | 0.066 | 0.871 | -0.966 | 0.934 | 0.017 |
| 2.88398205599539 | 0.255 | 0.065 | 0.874 | -0.967 | 0.935 | 0.017 |
| 2.88712364864898 | 0.252 | 0.063 | 0.877 | -0.968 | 0.937 | 0.016 |
| 2.890265241302569 | 0.249 | 0.062 | 0.88 | -0.969 | 0.938 | 0.015 |
| 2.893406833956158 | 0.246 | 0.06 | 0.883 | -0.969 | 0.94 | 0.015 |
| 2.896548426609748 | 0.243 | 0.059 | 0.886 | -0.97 | 0.941 | 0.014 |
| 2.899690019263338 | 0.24 | 0.057 | 0.889 | -0.971 | 0.943 | 0.014 |
| 2.902831611916927 | 0.236 | 0.056 | 0.891 | -0.972 | 0.944 | 0.013 |
| 2.905973204570517 | 0.233 | 0.054 | 0.894 | -0.972 | 0.946 | 0.013 |
| 2.909114797224106 | 0.23 | 0.053 | 0.897 | -0.973 | 0.947 | 0.012 |
| 2.912256389877696 | 0.227 | 0.052 | 0.899 | -0.974 | 0.948 | 0.012 |
| 2.915397982531286 | 0.224 | 0.05 | 0.902 | -0.975 | 0.95 | 0.011 |
| 2.918539575184875 | 0.221 | 0.049 | 0.905 | -0.975 | 0.951 | 0.011 |
| 2.921681167838465 | 0.218 | 0.048 | 0.907 | -0.976 | 0.952 | 0.01 |
| 2.924822760492054 | 0.215 | 0.046 | 0.91 | -0.977 | 0.954 | 0.01 |
| 2.927964353145644 | 0.212 | 0.045 | 0.912 | -0.977 | 0.955 | 0.01 |
| 2.931105945799234 | 0.209 | 0.044 | 0.915 | -0.978 | 0.956 | 0.009 |
| 2.934247538452823 | 0.206 | 0.042 | 0.917 | -0.979 | 0.958 | 0.009 |
| 2.937389131106413 | 0.203 | 0.041 | 0.919 | -0.979 | 0.959 | 0.008 |
| 2.940530723760002 | 0.2 | 0.04 | 0.922 | -0.98 | 0.96 | 0.008 |
| 2.943672316413592 | 0.197 | 0.039 | 0.924 | -0.98 | 0.961 | 0.008 |
| 2.946813909067182 | 0.194 | 0.037 | 0.926 | -0.981 | 0.963 | 0.007 |
| 2.949955501720771 | 0.19 | 0.036 | 0.929 | -0.982 | 0.964 | 0.007 |
| 2.953097094374361 | 0.187 | 0.035 | 0.931 | -0.982 | 0.965 | 0.007 |
| 2.95623868702795 | 0.184 | 0.034 | 0.933 | -0.983 | 0.966 | 0.006 |
| 2.95938027968154 | 0.181 | 0.033 | 0.935 | -0.983 | 0.967 | 0.006 |
| 2.96252187233513 | 0.178 | 0.032 | 0.938 | -0.984 | 0.968 | 0.006 |
| 2.965663464988719 | 0.175 | 0.031 | 0.94 | -0.985 | 0.969 | 0.005 |
| 2.968805057642309 | 0.172 | 0.03 | 0.942 | -0.985 | 0.97 | 0.005 |
| 2.971946650295898 | 0.169 | 0.029 | 0.944 | -0.986 | 0.971 | 0.005 |
| 2.975088242949488 | 0.166 | 0.027 | 0.946 | -0.986 | 0.973 | 0.005 |
| 2.978229835603078 | 0.163 | 0.026 | 0.948 | -0.987 | 0.974 | 0.004 |
| 2.981371428256667 | 0.16 | 0.025 | 0.95 | -0.987 | 0.975 | 0.004 |
| 2.984513020910257 | 0.156 | 0.024 | 0.952 | -0.988 | 0.976 | 0.004 |
| 2.987654613563846 | 0.153 | 0.024 | 0.954 | -0.988 | 0.976 | 0.004 |
| 2.990796206217436 | 0.15 | 0.023 | 0.955 | -0.989 | 0.977 | 0.003 |
| 2.993937798871025 | 0.147 | 0.022 | 0.957 | -0.989 | 0.978 | 0.003 |
| 2.997079391524615 | 0.144 | 0.021 | 0.959 | -0.99 | 0.979 | 0.003 |
| 3.000220984178205 | 0.141 | 0.02 | 0.961 | -0.99 | 0.98 | 0.003 |
| 3.003362576831794 | 0.138 | 0.019 | 0.962 | -0.99 | 0.981 | 0.003 |
| 3.006504169485384 | 0.135 | 0.018 | 0.964 | -0.991 | 0.982 | 0.002 |
| 3.009645762138974 | 0.132 | 0.017 | 0.966 | -0.991 | 0.983 | 0.002 |
| 3.012787354792563 | 0.128 | 0.016 | 0.967 | -0.992 | 0.984 | 0.002 |
| 3.015928947446153 | 0.125 | 0.016 | 0.969 | -0.992 | 0.984 | 0.002 |
| 3.019070540099742 | 0.122 | 0.015 | 0.97 | -0.993 | 0.985 | 0.002 |
| 3.022212132753332 | 0.119 | 0.014 | 0.972 | -0.993 | 0.986 | 0.002 |
| 3.025353725406922 | 0.116 | 0.013 | 0.973 | -0.993 | 0.987 | 0.002 |
| 3.028495318060511 | 0.113 | 0.013 | 0.975 | -0.994 | 0.987 | 0.001 |
| 3.031636910714101 | 0.11 | 0.012 | 0.976 | -0.994 | 0.988 | 0.001 |
| 3.03477850336769 | 0.107 | 0.011 | 0.977 | -0.994 | 0.989 | 0.001 |
| 3.03792009602128 | 0.103 | 0.011 | 0.979 | -0.995 | 0.989 | 0.001 |
| 3.04106168867487 | 0.1 | 0.01 | 0.98 | -0.995 | 0.99 | 0.001 |
| 3.04420328132846 | 0.097 | 0.009 | 0.981 | -0.995 | 0.991 | 0.001 |
| 3.047344873982049 | 0.094 | 0.009 | 0.982 | -0.996 | 0.991 | 0.001 |
| 3.050486466635638 | 0.091 | 0.008 | 0.984 | -0.996 | 0.992 | 0.001 |
| 3.053628059289228 | 0.088 | 0.008 | 0.985 | -0.996 | 0.992 | 0.001 |
| 3.056769651942818 | 0.085 | 0.007 | 0.986 | -0.996 | 0.993 | 0.001 |
| 3.059911244596407 | 0.082 | 0.007 | 0.987 | -0.997 | 0.993 | 0.001 |
| 3.063052837249997 | 0.078 | 0.006 | 0.988 | -0.997 | 0.994 | 0 |
| 3.066194429903586 | 0.075 | 0.006 | 0.989 | -0.997 | 0.994 | 0 |
| 3.069336022557176 | 0.072 | 0.005 | 0.99 | -0.997 | 0.995 | 0 |
| 3.072477615210766 | 0.069 | 0.005 | 0.99 | -0.998 | 0.995 | 0 |
| 3.075619207864355 | 0.066 | 0.004 | 0.991 | -0.998 | 0.996 | 0 |
| 3.078760800517945 | 0.063 | 0.004 | 0.992 | -0.998 | 0.996 | 0 |
| 3.081902393171534 | 0.06 | 0.004 | 0.993 | -0.998 | 0.996 | 0 |
| 3.085043985825124 | 0.057 | 0.003 | 0.994 | -0.998 | 0.997 | 0 |
| 3.088185578478713 | 0.053 | 0.003 | 0.994 | -0.999 | 0.997 | 0 |
| 3.091327171132303 | 0.05 | 0.003 | 0.995 | -0.999 | 0.997 | 0 |
| 3.094468763785893 | 0.047 | 0.002 | 0.996 | -0.999 | 0.998 | 0 |
| 3.097610356439482 | 0.044 | 0.002 | 0.996 | -0.999 | 0.998 | 0 |
| 3.100751949093072 | 0.041 | 0.002 | 0.997 | -0.999 | 0.998 | 0 |
| 3.103893541746661 | 0.038 | 0.001 | 0.997 | -0.999 | 0.999 | 0 |
| 3.107035134400251 | 0.035 | 0.001 | 0.998 | -0.999 | 0.999 | 0 |
| 3.110176727053841 | 0.031 | 0.001 | 0.998 | -1 | 0.999 | 0 |
| 3.11331831970743 | 0.028 | 0.001 | 0.998 | -1 | 0.999 | 0 |
| 3.11645991236102 | 0.025 | 0.001 | 0.999 | -1 | 0.999 | 0 |
| 3.11960150501461 | 0.022 | 0 | 0.999 | -1 | 1 | 0 |
| 3.122743097668199 | 0.019 | 0 | 0.999 | -1 | 1 | 0 |
| 3.125884690321789 | 0.016 | 0 | 1 | -1 | 1 | 0 |
| 3.129026282975378 | 0.013 | 0 | 1 | -1 | 1 | 0 |
| 3.132167875628968 | 0.009 | 0 | 1 | -1 | 1 | 0 |
| 3.135309468282557 | 0.006 | 0 | 1 | -1 | 1 | 0 |
| 3.138451060936147 | 0.003 | 0 | 1 | -1 | 1 | 0 |
| 3.141592653589737 | 0 | 0 | 1 | -1 | 1 | 0 |
| 3.144734246243326 | -0.003 | 0 | 1 | -1 | 1 | 0 |
| 3.147875838896916 | -0.006 | 0 | 1 | -1 | 1 | 0 |
| 3.151017431550505 | -0.009 | 0 | 1 | -1 | 1 | 0 |
| 3.154159024204095 | -0.013 | 0 | 1 | -1 | 1 | 0 |
| 3.157300616857685 | -0.016 | 0 | 1 | -1 | 1 | 0 |
| 3.160442209511274 | -0.019 | 0 | 0.999 | -1 | 1 | 0 |
| 3.163583802164864 | -0.022 | 0 | 0.999 | -1 | 1 | 0 |
| 3.166725394818453 | -0.025 | 0.001 | 0.999 | -1 | 0.999 | 0 |
| 3.169866987472043 | -0.028 | 0.001 | 0.998 | -1 | 0.999 | 0 |
| 3.173008580125633 | -0.031 | 0.001 | 0.998 | -1 | 0.999 | 0 |
| 3.176150172779222 | -0.035 | 0.001 | 0.998 | -0.999 | 0.999 | 0 |
| 3.179291765432812 | -0.038 | 0.001 | 0.997 | -0.999 | 0.999 | 0 |
| 3.182433358086401 | -0.041 | 0.002 | 0.997 | -0.999 | 0.998 | 0 |
| 3.185574950739991 | -0.044 | 0.002 | 0.996 | -0.999 | 0.998 | 0 |
| 3.188716543393581 | -0.047 | 0.002 | 0.996 | -0.999 | 0.998 | 0 |
| 3.19185813604717 | -0.05 | 0.003 | 0.995 | -0.999 | 0.997 | 0 |
| 3.19499972870076 | -0.053 | 0.003 | 0.994 | -0.999 | 0.997 | 0 |
| 3.198141321354349 | -0.057 | 0.003 | 0.994 | -0.998 | 0.997 | 0 |
| 3.20128291400794 | -0.06 | 0.004 | 0.993 | -0.998 | 0.996 | 0 |
| 3.204424506661528 | -0.063 | 0.004 | 0.992 | -0.998 | 0.996 | 0 |
| 3.207566099315118 | -0.066 | 0.004 | 0.991 | -0.998 | 0.996 | 0 |
| 3.210707691968708 | -0.069 | 0.005 | 0.99 | -0.998 | 0.995 | 0 |
| 3.213849284622297 | -0.072 | 0.005 | 0.99 | -0.997 | 0.995 | 0 |
| 3.216990877275887 | -0.075 | 0.006 | 0.989 | -0.997 | 0.994 | 0 |
| 3.220132469929476 | -0.078 | 0.006 | 0.988 | -0.997 | 0.994 | 0 |
| 3.223274062583066 | -0.082 | 0.007 | 0.987 | -0.997 | 0.993 | -0.001 |
| 3.226415655236656 | -0.085 | 0.007 | 0.986 | -0.996 | 0.993 | -0.001 |
| 3.229557247890245 | -0.088 | 0.008 | 0.985 | -0.996 | 0.992 | -0.001 |
| 3.232698840543835 | -0.091 | 0.008 | 0.984 | -0.996 | 0.992 | -0.001 |
| 3.235840433197425 | -0.094 | 0.009 | 0.982 | -0.996 | 0.991 | -0.001 |
| 3.238982025851014 | -0.097 | 0.009 | 0.981 | -0.995 | 0.991 | -0.001 |
| 3.242123618504604 | -0.1 | 0.01 | 0.98 | -0.995 | 0.99 | -0.001 |
| 3.245265211158193 | -0.103 | 0.011 | 0.979 | -0.995 | 0.989 | -0.001 |
| 3.248406803811783 | -0.107 | 0.011 | 0.977 | -0.994 | 0.989 | -0.001 |
| 3.251548396465373 | -0.11 | 0.012 | 0.976 | -0.994 | 0.988 | -0.001 |
| 3.254689989118962 | -0.113 | 0.013 | 0.975 | -0.994 | 0.987 | -0.001 |
| 3.257831581772551 | -0.116 | 0.013 | 0.973 | -0.993 | 0.987 | -0.002 |
| 3.260973174426141 | -0.119 | 0.014 | 0.972 | -0.993 | 0.986 | -0.002 |
| 3.26411476707973 | -0.122 | 0.015 | 0.97 | -0.993 | 0.985 | -0.002 |
| 3.267256359733321 | -0.125 | 0.016 | 0.969 | -0.992 | 0.984 | -0.002 |
| 3.27039795238691 | -0.128 | 0.016 | 0.967 | -0.992 | 0.984 | -0.002 |
| 3.2735395450405 | -0.132 | 0.017 | 0.966 | -0.991 | 0.983 | -0.002 |
| 3.276681137694089 | -0.135 | 0.018 | 0.964 | -0.991 | 0.982 | -0.002 |
| 3.279822730347679 | -0.138 | 0.019 | 0.962 | -0.99 | 0.981 | -0.003 |
| 3.282964323001269 | -0.141 | 0.02 | 0.961 | -0.99 | 0.98 | -0.003 |
| 3.286105915654858 | -0.144 | 0.021 | 0.959 | -0.99 | 0.979 | -0.003 |
| 3.289247508308448 | -0.147 | 0.022 | 0.957 | -0.989 | 0.978 | -0.003 |
| 3.292389100962037 | -0.15 | 0.023 | 0.955 | -0.989 | 0.977 | -0.003 |
| 3.295530693615627 | -0.153 | 0.024 | 0.954 | -0.988 | 0.976 | -0.004 |
| 3.298672286269217 | -0.156 | 0.024 | 0.952 | -0.988 | 0.976 | -0.004 |
| 3.301813878922806 | -0.16 | 0.025 | 0.95 | -0.987 | 0.975 | -0.004 |
| 3.304955471576396 | -0.163 | 0.026 | 0.948 | -0.987 | 0.974 | -0.004 |
| 3.308097064229985 | -0.166 | 0.027 | 0.946 | -0.986 | 0.973 | -0.005 |
| 3.311238656883575 | -0.169 | 0.029 | 0.944 | -0.986 | 0.971 | -0.005 |
| 3.314380249537165 | -0.172 | 0.03 | 0.942 | -0.985 | 0.97 | -0.005 |
| 3.317521842190754 | -0.175 | 0.031 | 0.94 | -0.985 | 0.969 | -0.005 |
| 3.320663434844344 | -0.178 | 0.032 | 0.938 | -0.984 | 0.968 | -0.006 |
| 3.323805027497933 | -0.181 | 0.033 | 0.935 | -0.983 | 0.967 | -0.006 |
| 3.326946620151523 | -0.184 | 0.034 | 0.933 | -0.983 | 0.966 | -0.006 |
| 3.330088212805113 | -0.187 | 0.035 | 0.931 | -0.982 | 0.965 | -0.007 |
| 3.333229805458702 | -0.19 | 0.036 | 0.929 | -0.982 | 0.964 | -0.007 |
| 3.336371398112292 | -0.194 | 0.037 | 0.926 | -0.981 | 0.963 | -0.007 |
| 3.339512990765881 | -0.197 | 0.039 | 0.924 | -0.98 | 0.961 | -0.008 |
| 3.342654583419471 | -0.2 | 0.04 | 0.922 | -0.98 | 0.96 | -0.008 |
| 3.345796176073061 | -0.203 | 0.041 | 0.919 | -0.979 | 0.959 | -0.008 |
| 3.34893776872665 | -0.206 | 0.042 | 0.917 | -0.979 | 0.958 | -0.009 |
| 3.35207936138024 | -0.209 | 0.044 | 0.915 | -0.978 | 0.956 | -0.009 |
| 3.355220954033829 | -0.212 | 0.045 | 0.912 | -0.977 | 0.955 | -0.01 |
| 3.358362546687419 | -0.215 | 0.046 | 0.91 | -0.977 | 0.954 | -0.01 |
| 3.361504139341009 | -0.218 | 0.048 | 0.907 | -0.976 | 0.952 | -0.01 |
| 3.364645731994598 | -0.221 | 0.049 | 0.905 | -0.975 | 0.951 | -0.011 |
| 3.367787324648188 | -0.224 | 0.05 | 0.902 | -0.975 | 0.95 | -0.011 |
| 3.370928917301777 | -0.227 | 0.052 | 0.899 | -0.974 | 0.948 | -0.012 |
| 3.374070509955367 | -0.23 | 0.053 | 0.897 | -0.973 | 0.947 | -0.012 |
| 3.377212102608956 | -0.233 | 0.054 | 0.894 | -0.972 | 0.946 | -0.013 |
| 3.380353695262546 | -0.236 | 0.056 | 0.891 | -0.972 | 0.944 | -0.013 |
| 3.383495287916136 | -0.24 | 0.057 | 0.889 | -0.971 | 0.943 | -0.014 |
| 3.386636880569725 | -0.243 | 0.059 | 0.886 | -0.97 | 0.941 | -0.014 |
| 3.389778473223315 | -0.246 | 0.06 | 0.883 | -0.969 | 0.94 | -0.015 |
| 3.392920065876904 | -0.249 | 0.062 | 0.88 | -0.969 | 0.938 | -0.015 |
| 3.396061658530494 | -0.252 | 0.063 | 0.877 | -0.968 | 0.937 | -0.016 |
| 3.399203251184084 | -0.255 | 0.065 | 0.874 | -0.967 | 0.935 | -0.017 |
| 3.402344843837673 | -0.258 | 0.066 | 0.871 | -0.966 | 0.934 | -0.017 |
| 3.405486436491263 | -0.261 | 0.068 | 0.869 | -0.965 | 0.932 | -0.018 |
| 3.408628029144852 | -0.264 | 0.07 | 0.866 | -0.965 | 0.93 | -0.018 |
| 3.411769621798442 | -0.267 | 0.071 | 0.863 | -0.964 | 0.929 | -0.019 |
| 3.414911214452032 | -0.27 | 0.073 | 0.86 | -0.963 | 0.927 | -0.02 |
| 3.418052807105621 | -0.273 | 0.075 | 0.857 | -0.962 | 0.925 | -0.02 |
| 3.421194399759211 | -0.276 | 0.076 | 0.853 | -0.961 | 0.924 | -0.021 |
| 3.4243359924128 | -0.279 | 0.078 | 0.85 | -0.96 | 0.922 | -0.022 |
| 3.42747758506639 | -0.282 | 0.08 | 0.847 | -0.959 | 0.92 | -0.022 |
| 3.43061917771998 | -0.285 | 0.081 | 0.844 | -0.959 | 0.919 | -0.023 |
| 3.433760770373569 | -0.288 | 0.083 | 0.841 | -0.958 | 0.917 | -0.024 |
| 3.436902363027159 | -0.291 | 0.085 | 0.838 | -0.957 | 0.915 | -0.025 |
| 3.440043955680748 | -0.294 | 0.086 | 0.835 | -0.956 | 0.914 | -0.025 |
| 3.443185548334338 | -0.297 | 0.088 | 0.831 | -0.955 | 0.912 | -0.026 |
| 3.446327140987927 | -0.3 | 0.09 | 0.828 | -0.954 | 0.91 | -0.027 |
| 3.449468733641517 | -0.303 | 0.092 | 0.825 | -0.953 | 0.908 | -0.028 |
| 3.452610326295107 | -0.306 | 0.094 | 0.821 | -0.952 | 0.906 | -0.029 |
| 3.455751918948696 | -0.309 | 0.095 | 0.818 | -0.951 | 0.905 | -0.03 |
| 3.458893511602286 | -0.312 | 0.097 | 0.815 | -0.95 | 0.903 | -0.03 |
| 3.462035104255876 | -0.315 | 0.099 | 0.811 | -0.949 | 0.901 | -0.031 |
| 3.465176696909465 | -0.318 | 0.101 | 0.808 | -0.948 | 0.899 | -0.032 |
| 3.468318289563055 | -0.321 | 0.103 | 0.805 | -0.947 | 0.897 | -0.033 |
| 3.471459882216644 | -0.324 | 0.105 | 0.801 | -0.946 | 0.895 | -0.034 |
| 3.474601474870234 | -0.327 | 0.107 | 0.798 | -0.945 | 0.893 | -0.035 |
| 3.477743067523824 | -0.33 | 0.109 | 0.794 | -0.944 | 0.891 | -0.036 |
| 3.480884660177413 | -0.333 | 0.111 | 0.791 | -0.943 | 0.889 | -0.037 |
| 3.484026252831002 | -0.336 | 0.113 | 0.787 | -0.942 | 0.887 | -0.038 |
| 3.487167845484592 | -0.339 | 0.115 | 0.784 | -0.941 | 0.885 | -0.039 |
| 3.490309438138182 | -0.342 | 0.117 | 0.78 | -0.94 | 0.883 | -0.04 |
| 3.493451030791772 | -0.345 | 0.119 | 0.777 | -0.939 | 0.881 | -0.041 |
| 3.496592623445361 | -0.348 | 0.121 | 0.773 | -0.938 | 0.879 | -0.042 |
| 3.499734216098951 | -0.351 | 0.123 | 0.769 | -0.937 | 0.877 | -0.043 |
| 3.50287580875254 | -0.353 | 0.125 | 0.766 | -0.935 | 0.875 | -0.044 |
| 3.50601740140613 | -0.356 | 0.127 | 0.762 | -0.934 | 0.873 | -0.045 |
| 3.50915899405972 | -0.359 | 0.129 | 0.758 | -0.933 | 0.871 | -0.046 |
| 3.512300586713309 | -0.362 | 0.131 | 0.755 | -0.932 | 0.869 | -0.048 |
| 3.515442179366899 | -0.365 | 0.133 | 0.751 | -0.931 | 0.867 | -0.049 |
| 3.518583772020488 | -0.368 | 0.136 | 0.747 | -0.93 | 0.864 | -0.05 |
| 3.521725364674078 | -0.371 | 0.138 | 0.744 | -0.929 | 0.862 | -0.051 |
| 3.524866957327668 | -0.374 | 0.14 | 0.74 | -0.927 | 0.86 | -0.052 |
| 3.528008549981257 | -0.377 | 0.142 | 0.736 | -0.926 | 0.858 | -0.054 |
| 3.531150142634847 | -0.38 | 0.144 | 0.732 | -0.925 | 0.856 | -0.055 |
| 3.534291735288436 | -0.383 | 0.146 | 0.729 | -0.924 | 0.854 | -0.056 |
| 3.537433327942026 | -0.386 | 0.149 | 0.725 | -0.923 | 0.851 | -0.057 |
| 3.540574920595616 | -0.388 | 0.151 | 0.721 | -0.921 | 0.849 | -0.059 |
| 3.543716513249205 | -0.391 | 0.153 | 0.717 | -0.92 | 0.847 | -0.06 |
| 3.546858105902795 | -0.394 | 0.155 | 0.713 | -0.919 | 0.845 | -0.061 |
| 3.549999698556384 | -0.397 | 0.158 | 0.709 | -0.918 | 0.842 | -0.063 |
| 3.553141291209974 | -0.4 | 0.16 | 0.706 | -0.917 | 0.84 | -0.064 |
| 3.556282883863564 | -0.403 | 0.162 | 0.702 | -0.915 | 0.838 | -0.065 |
| 3.559424476517153 | -0.406 | 0.165 | 0.698 | -0.914 | 0.835 | -0.067 |
| 3.562566069170743 | -0.409 | 0.167 | 0.694 | -0.913 | 0.833 | -0.068 |
| 3.565707661824332 | -0.412 | 0.169 | 0.69 | -0.911 | 0.831 | -0.07 |
| 3.568849254477922 | -0.414 | 0.172 | 0.686 | -0.91 | 0.828 | -0.071 |
| 3.571990847131511 | -0.417 | 0.174 | 0.682 | -0.909 | 0.826 | -0.073 |
| 3.575132439785101 | -0.42 | 0.176 | 0.678 | -0.907 | 0.824 | -0.074 |
| 3.578274032438691 | -0.423 | 0.179 | 0.674 | -0.906 | 0.821 | -0.076 |
| 3.58141562509228 | -0.426 | 0.181 | 0.67 | -0.905 | 0.819 | -0.077 |
| 3.58455721774587 | -0.429 | 0.184 | 0.666 | -0.903 | 0.816 | -0.079 |
| 3.58769881039946 | -0.431 | 0.186 | 0.662 | -0.902 | 0.814 | -0.08 |
| 3.590840403053049 | -0.434 | 0.189 | 0.658 | -0.901 | 0.811 | -0.082 |
| 3.593981995706639 | -0.437 | 0.191 | 0.654 | -0.899 | 0.809 | -0.084 |
| 3.597123588360228 | -0.44 | 0.194 | 0.65 | -0.898 | 0.806 | -0.085 |
| 3.600265181013818 | -0.443 | 0.196 | 0.646 | -0.897 | 0.804 | -0.087 |
| 3.603406773667407 | -0.446 | 0.199 | 0.642 | -0.895 | 0.801 | -0.088 |
| 3.606548366320997 | -0.448 | 0.201 | 0.638 | -0.894 | 0.799 | -0.09 |
| 3.609689958974587 | -0.451 | 0.204 | 0.634 | -0.892 | 0.796 | -0.092 |
| 3.612831551628176 | -0.454 | 0.206 | 0.63 | -0.891 | 0.794 | -0.094 |
| 3.615973144281766 | -0.457 | 0.209 | 0.626 | -0.89 | 0.791 | -0.095 |
| 3.619114736935355 | -0.46 | 0.211 | 0.622 | -0.888 | 0.789 | -0.097 |
| 3.622256329588945 | -0.462 | 0.214 | 0.618 | -0.887 | 0.786 | -0.099 |
| 3.625397922242534 | -0.465 | 0.216 | 0.614 | -0.885 | 0.784 | -0.101 |
| 3.628539514896124 | -0.468 | 0.219 | 0.61 | -0.884 | 0.781 | -0.102 |
| 3.631681107549714 | -0.471 | 0.222 | 0.606 | -0.882 | 0.778 | -0.104 |
| 3.634822700203303 | -0.473 | 0.224 | 0.602 | -0.881 | 0.776 | -0.106 |
| 3.637964292856893 | -0.476 | 0.227 | 0.598 | -0.879 | 0.773 | -0.108 |
| 3.641105885510483 | -0.479 | 0.229 | 0.594 | -0.878 | 0.771 | -0.11 |
| 3.644247478164072 | -0.482 | 0.232 | 0.59 | -0.876 | 0.768 | -0.112 |
| 3.647389070817662 | -0.485 | 0.235 | 0.586 | -0.875 | 0.765 | -0.114 |
| 3.650530663471251 | -0.487 | 0.237 | 0.582 | -0.873 | 0.763 | -0.116 |
| 3.653672256124841 | -0.49 | 0.24 | 0.577 | -0.872 | 0.76 | -0.118 |
| 3.656813848778431 | -0.493 | 0.243 | 0.573 | -0.87 | 0.757 | -0.12 |
| 3.65995544143202 | -0.495 | 0.245 | 0.569 | -0.869 | 0.755 | -0.122 |
| 3.66309703408561 | -0.498 | 0.248 | 0.565 | -0.867 | 0.752 | -0.124 |
| 3.666238626739199 | -0.501 | 0.251 | 0.561 | -0.866 | 0.749 | -0.126 |
| 3.66938021939279 | -0.504 | 0.254 | 0.557 | -0.864 | 0.746 | -0.128 |
| 3.672521812046378 | -0.506 | 0.256 | 0.553 | -0.862 | 0.744 | -0.13 |
| 3.675663404699968 | -0.509 | 0.259 | 0.549 | -0.861 | 0.741 | -0.132 |
| 3.678804997353558 | -0.512 | 0.262 | 0.545 | -0.859 | 0.738 | -0.134 |
| 3.681946590007147 | -0.514 | 0.265 | 0.541 | -0.858 | 0.735 | -0.136 |
| 3.685088182660737 | -0.517 | 0.267 | 0.537 | -0.856 | 0.733 | -0.138 |
| 3.688229775314326 | -0.52 | 0.27 | 0.533 | -0.854 | 0.73 | -0.14 |
| 3.691371367967916 | -0.522 | 0.273 | 0.529 | -0.853 | 0.727 | -0.143 |
| 3.694512960621506 | -0.525 | 0.276 | 0.524 | -0.851 | 0.724 | -0.145 |
| 3.697654553275095 | -0.528 | 0.279 | 0.52 | -0.849 | 0.721 | -0.147 |
| 3.700796145928685 | -0.531 | 0.281 | 0.516 | -0.848 | 0.719 | -0.149 |
| 3.703937738582274 | -0.533 | 0.284 | 0.512 | -0.846 | 0.716 | -0.152 |
| 3.707079331235864 | -0.536 | 0.287 | 0.508 | -0.844 | 0.713 | -0.154 |
| 3.710220923889454 | -0.538 | 0.29 | 0.504 | -0.843 | 0.71 | -0.156 |
| 3.713362516543043 | -0.541 | 0.293 | 0.5 | -0.841 | 0.707 | -0.158 |
| 3.716504109196633 | -0.544 | 0.296 | 0.496 | -0.839 | 0.704 | -0.161 |
| 3.719645701850223 | -0.546 | 0.299 | 0.492 | -0.838 | 0.701 | -0.163 |
| 3.722787294503812 | -0.549 | 0.301 | 0.488 | -0.836 | 0.699 | -0.165 |
| 3.725928887157402 | -0.552 | 0.304 | 0.484 | -0.834 | 0.696 | -0.168 |
| 3.729070479810991 | -0.554 | 0.307 | 0.48 | -0.832 | 0.693 | -0.17 |
| 3.732212072464581 | -0.557 | 0.31 | 0.476 | -0.831 | 0.69 | -0.173 |
| 3.735353665118171 | -0.559 | 0.313 | 0.472 | -0.829 | 0.687 | -0.175 |
| 3.73849525777176 | -0.562 | 0.316 | 0.468 | -0.827 | 0.684 | -0.178 |
| 3.74163685042535 | -0.565 | 0.319 | 0.464 | -0.825 | 0.681 | -0.18 |
| 3.744778443078939 | -0.567 | 0.322 | 0.46 | -0.824 | 0.678 | -0.183 |
| 3.747920035732529 | -0.57 | 0.325 | 0.456 | -0.822 | 0.675 | -0.185 |
| 3.751061628386119 | -0.572 | 0.328 | 0.452 | -0.82 | 0.672 | -0.188 |
| 3.754203221039708 | -0.575 | 0.331 | 0.448 | -0.818 | 0.669 | -0.19 |
| 3.757344813693298 | -0.578 | 0.334 | 0.444 | -0.816 | 0.666 | -0.193 |
| 3.760486406346887 | -0.58 | 0.337 | 0.44 | -0.815 | 0.663 | -0.195 |
| 3.763627999000477 | -0.583 | 0.34 | 0.436 | -0.813 | 0.66 | -0.198 |
| 3.766769591654067 | -0.585 | 0.343 | 0.432 | -0.811 | 0.657 | -0.2 |
| 3.769911184307656 | -0.588 | 0.345 | 0.428 | -0.809 | 0.655 | -0.203 |
| 3.773052776961246 | -0.59 | 0.348 | 0.424 | -0.807 | 0.652 | -0.206 |
| 3.776194369614835 | -0.593 | 0.351 | 0.421 | -0.805 | 0.649 | -0.208 |
| 3.779335962268425 | -0.595 | 0.354 | 0.417 | -0.803 | 0.646 | -0.211 |
| 3.782477554922014 | -0.598 | 0.357 | 0.413 | -0.802 | 0.643 | -0.214 |
| 3.785619147575604 | -0.6 | 0.361 | 0.409 | -0.8 | 0.639 | -0.216 |
| 3.788760740229193 | -0.603 | 0.364 | 0.405 | -0.798 | 0.636 | -0.219 |
| 3.791902332882783 | -0.605 | 0.367 | 0.401 | -0.796 | 0.633 | -0.222 |
| 3.795043925536373 | -0.608 | 0.37 | 0.397 | -0.794 | 0.63 | -0.225 |
| 3.798185518189962 | -0.61 | 0.373 | 0.394 | -0.792 | 0.627 | -0.227 |
| 3.801327110843552 | -0.613 | 0.376 | 0.39 | -0.79 | 0.624 | -0.23 |
| 3.804468703497142 | -0.615 | 0.379 | 0.386 | -0.788 | 0.621 | -0.233 |
| 3.807610296150731 | -0.618 | 0.382 | 0.382 | -0.786 | 0.618 | -0.236 |
| 3.810751888804321 | -0.62 | 0.385 | 0.378 | -0.784 | 0.615 | -0.239 |
| 3.813893481457911 | -0.623 | 0.388 | 0.375 | -0.782 | 0.612 | -0.242 |
| 3.8170350741115 | -0.625 | 0.391 | 0.371 | -0.78 | 0.609 | -0.244 |
| 3.82017666676509 | -0.628 | 0.394 | 0.367 | -0.778 | 0.606 | -0.247 |
| 3.823318259418679 | -0.63 | 0.397 | 0.364 | -0.776 | 0.603 | -0.25 |
| 3.826459852072269 | -0.633 | 0.4 | 0.36 | -0.775 | 0.6 | -0.253 |
| 3.829601444725859 | -0.635 | 0.403 | 0.356 | -0.773 | 0.597 | -0.256 |
| 3.832743037379448 | -0.637 | 0.406 | 0.352 | -0.771 | 0.594 | -0.259 |
| 3.835884630033038 | -0.64 | 0.409 | 0.349 | -0.769 | 0.591 | -0.262 |
| 3.839026222686627 | -0.642 | 0.412 | 0.345 | -0.766 | 0.588 | -0.265 |
| 3.842167815340217 | -0.645 | 0.416 | 0.342 | -0.764 | 0.584 | -0.268 |
| 3.845309407993807 | -0.647 | 0.419 | 0.338 | -0.762 | 0.581 | -0.271 |
| 3.848451000647396 | -0.649 | 0.422 | 0.334 | -0.76 | 0.578 | -0.274 |
| 3.851592593300986 | -0.652 | 0.425 | 0.331 | -0.758 | 0.575 | -0.277 |
| 3.854734185954575 | -0.654 | 0.428 | 0.327 | -0.756 | 0.572 | -0.28 |
| 3.857875778608165 | -0.657 | 0.431 | 0.324 | -0.754 | 0.569 | -0.283 |
| 3.861017371261755 | -0.659 | 0.434 | 0.32 | -0.752 | 0.566 | -0.286 |
| 3.864158963915344 | -0.661 | 0.437 | 0.317 | -0.75 | 0.563 | -0.289 |
| 3.867300556568933 | -0.664 | 0.44 | 0.313 | -0.748 | 0.56 | -0.292 |
| 3.870442149222523 | -0.666 | 0.444 | 0.31 | -0.746 | 0.556 | -0.295 |
| 3.873583741876112 | -0.668 | 0.447 | 0.306 | -0.744 | 0.553 | -0.299 |
| 3.876725334529703 | -0.671 | 0.45 | 0.303 | -0.742 | 0.55 | -0.302 |
| 3.879866927183292 | -0.673 | 0.453 | 0.299 | -0.74 | 0.547 | -0.305 |
| 3.883008519836882 | -0.675 | 0.456 | 0.296 | -0.738 | 0.544 | -0.308 |
| 3.886150112490471 | -0.678 | 0.459 | 0.292 | -0.735 | 0.541 | -0.311 |
| 3.889291705144061 | -0.68 | 0.462 | 0.289 | -0.733 | 0.538 | -0.314 |
| 3.892433297797651 | -0.682 | 0.465 | 0.286 | -0.731 | 0.535 | -0.318 |
| 3.89557489045124 | -0.685 | 0.469 | 0.282 | -0.729 | 0.531 | -0.321 |
| 3.89871648310483 | -0.687 | 0.472 | 0.279 | -0.727 | 0.528 | -0.324 |
| 3.901858075758419 | -0.689 | 0.475 | 0.276 | -0.725 | 0.525 | -0.327 |
| 3.904999668412009 | -0.691 | 0.478 | 0.272 | -0.722 | 0.522 | -0.33 |
| 3.908141261065598 | -0.694 | 0.481 | 0.269 | -0.72 | 0.519 | -0.334 |
| 3.911282853719188 | -0.696 | 0.484 | 0.266 | -0.718 | 0.516 | -0.337 |
| 3.914424446372778 | -0.698 | 0.487 | 0.263 | -0.716 | 0.513 | -0.34 |
| 3.917566039026367 | -0.7 | 0.491 | 0.26 | -0.714 | 0.509 | -0.344 |
| 3.920707631679957 | -0.703 | 0.494 | 0.256 | -0.712 | 0.506 | -0.347 |
| 3.923849224333547 | -0.705 | 0.497 | 0.253 | -0.709 | 0.503 | -0.35 |
| 3.926990816987136 | -0.707 | 0.5 | 0.25 | -0.707 | 0.5 | -0.354 |
| 3.930132409640726 | -0.709 | 0.503 | 0.247 | -0.705 | 0.497 | -0.357 |
| 3.933274002294315 | -0.712 | 0.506 | 0.244 | -0.703 | 0.494 | -0.36 |
| 3.936415594947905 | -0.714 | 0.509 | 0.241 | -0.7 | 0.491 | -0.364 |
| 3.939557187601495 | -0.716 | 0.513 | 0.238 | -0.698 | 0.487 | -0.367 |
| 3.942698780255084 | -0.718 | 0.516 | 0.235 | -0.696 | 0.484 | -0.37 |
| 3.945840372908674 | -0.72 | 0.519 | 0.232 | -0.694 | 0.481 | -0.374 |
| 3.948981965562263 | -0.722 | 0.522 | 0.228 | -0.691 | 0.478 | -0.377 |
| 3.952123558215853 | -0.725 | 0.525 | 0.226 | -0.689 | 0.475 | -0.381 |
| 3.955265150869442 | -0.727 | 0.528 | 0.223 | -0.687 | 0.472 | -0.384 |
| 3.958406743523032 | -0.729 | 0.531 | 0.22 | -0.685 | 0.469 | -0.387 |
| 3.961548336176622 | -0.731 | 0.535 | 0.217 | -0.682 | 0.465 | -0.391 |
| 3.964689928830211 | -0.733 | 0.538 | 0.214 | -0.68 | 0.462 | -0.394 |
| 3.967831521483801 | -0.735 | 0.541 | 0.211 | -0.678 | 0.459 | -0.398 |
| 3.97097311413739 | -0.738 | 0.544 | 0.208 | -0.675 | 0.456 | -0.401 |
| 3.97411470679098 | -0.74 | 0.547 | 0.205 | -0.673 | 0.453 | -0.405 |
| 3.97725629944457 | -0.742 | 0.55 | 0.202 | -0.671 | 0.45 | -0.408 |
| 3.98039789209816 | -0.744 | 0.553 | 0.2 | -0.668 | 0.447 | -0.412 |
| 3.983539484751749 | -0.746 | 0.556 | 0.197 | -0.666 | 0.444 | -0.415 |
| 3.986681077405338 | -0.748 | 0.56 | 0.194 | -0.664 | 0.44 | -0.419 |
| 3.989822670058928 | -0.75 | 0.563 | 0.191 | -0.661 | 0.437 | -0.422 |
| 3.992964262712517 | -0.752 | 0.566 | 0.189 | -0.659 | 0.434 | -0.426 |
| 3.996105855366107 | -0.754 | 0.569 | 0.186 | -0.657 | 0.431 | -0.429 |
| 3.999247448019697 | -0.756 | 0.572 | 0.183 | -0.654 | 0.428 | -0.433 |
| 4.002389040673287 | -0.758 | 0.575 | 0.181 | -0.652 | 0.425 | -0.436 |
| 4.005530633326877 | -0.76 | 0.578 | 0.178 | -0.649 | 0.422 | -0.44 |
| 4.008672225980466 | -0.762 | 0.581 | 0.175 | -0.647 | 0.419 | -0.443 |
| 4.011813818634056 | -0.764 | 0.584 | 0.173 | -0.645 | 0.416 | -0.447 |
| 4.014955411287645 | -0.766 | 0.588 | 0.17 | -0.642 | 0.412 | -0.45 |
| 4.018097003941234 | -0.769 | 0.591 | 0.168 | -0.64 | 0.409 | -0.454 |
| 4.021238596594824 | -0.771 | 0.594 | 0.165 | -0.637 | 0.406 | -0.457 |
| 4.024380189248414 | -0.773 | 0.597 | 0.163 | -0.635 | 0.403 | -0.461 |
| 4.027521781902004 | -0.775 | 0.6 | 0.16 | -0.633 | 0.4 | -0.465 |
| 4.030663374555593 | -0.776 | 0.603 | 0.158 | -0.63 | 0.397 | -0.468 |
| 4.033804967209183 | -0.778 | 0.606 | 0.155 | -0.628 | 0.394 | -0.472 |
| 4.036946559862773 | -0.78 | 0.609 | 0.153 | -0.625 | 0.391 | -0.475 |
| 4.040088152516362 | -0.782 | 0.612 | 0.15 | -0.623 | 0.388 | -0.479 |
| 4.043229745169951 | -0.784 | 0.615 | 0.148 | -0.62 | 0.385 | -0.483 |
| 4.046371337823541 | -0.786 | 0.618 | 0.146 | -0.618 | 0.382 | -0.486 |
| 4.049512930477131 | -0.788 | 0.621 | 0.143 | -0.615 | 0.379 | -0.49 |
| 4.05265452313072 | -0.79 | 0.624 | 0.141 | -0.613 | 0.376 | -0.493 |
| 4.05579611578431 | -0.792 | 0.627 | 0.139 | -0.61 | 0.373 | -0.497 |
| 4.0589377084379 | -0.794 | 0.63 | 0.137 | -0.608 | 0.37 | -0.501 |
| 4.062079301091489 | -0.796 | 0.633 | 0.134 | -0.605 | 0.367 | -0.504 |
| 4.065220893745079 | -0.798 | 0.636 | 0.132 | -0.603 | 0.364 | -0.508 |
| 4.068362486398668 | -0.8 | 0.639 | 0.13 | -0.6 | 0.361 | -0.511 |
| 4.071504079052258 | -0.802 | 0.643 | 0.128 | -0.598 | 0.357 | -0.515 |
| 4.074645671705848 | -0.803 | 0.646 | 0.126 | -0.595 | 0.354 | -0.519 |
| 4.077787264359437 | -0.805 | 0.649 | 0.124 | -0.593 | 0.351 | -0.522 |
| 4.080928857013027 | -0.807 | 0.652 | 0.121 | -0.59 | 0.348 | -0.526 |
| 4.084070449666616 | -0.809 | 0.655 | 0.119 | -0.588 | 0.345 | -0.53 |
| 4.087212042320206 | -0.811 | 0.657 | 0.117 | -0.585 | 0.343 | -0.533 |
| 4.090353634973795 | -0.813 | 0.66 | 0.115 | -0.583 | 0.34 | -0.537 |
| 4.093495227627385 | -0.815 | 0.663 | 0.113 | -0.58 | 0.337 | -0.54 |
| 4.096636820280975 | -0.816 | 0.666 | 0.111 | -0.578 | 0.334 | -0.544 |
| 4.099778412934564 | -0.818 | 0.669 | 0.109 | -0.575 | 0.331 | -0.548 |
| 4.102920005588154 | -0.82 | 0.672 | 0.107 | -0.572 | 0.328 | -0.551 |
| 4.106061598241744 | -0.822 | 0.675 | 0.105 | -0.57 | 0.325 | -0.555 |
| 4.109203190895333 | -0.824 | 0.678 | 0.104 | -0.567 | 0.322 | -0.559 |
| 4.112344783548923 | -0.825 | 0.681 | 0.102 | -0.565 | 0.319 | -0.562 |
| 4.115486376202512 | -0.827 | 0.684 | 0.1 | -0.562 | 0.316 | -0.566 |
| 4.118627968856102 | -0.829 | 0.687 | 0.098 | -0.559 | 0.313 | -0.569 |
| 4.121769561509692 | -0.831 | 0.69 | 0.096 | -0.557 | 0.31 | -0.573 |
| 4.124911154163281 | -0.832 | 0.693 | 0.094 | -0.554 | 0.307 | -0.577 |
| 4.128052746816871 | -0.834 | 0.696 | 0.093 | -0.552 | 0.304 | -0.58 |
| 4.13119433947046 | -0.836 | 0.699 | 0.091 | -0.549 | 0.301 | -0.584 |
| 4.13433593212405 | -0.838 | 0.701 | 0.089 | -0.546 | 0.299 | -0.587 |
| 4.13747752477764 | -0.839 | 0.704 | 0.087 | -0.544 | 0.296 | -0.591 |
| 4.14061911743123 | -0.841 | 0.707 | 0.086 | -0.541 | 0.293 | -0.595 |
| 4.143760710084818 | -0.843 | 0.71 | 0.084 | -0.538 | 0.29 | -0.598 |
| 4.146902302738408 | -0.844 | 0.713 | 0.082 | -0.536 | 0.287 | -0.602 |
| 4.150043895391998 | -0.846 | 0.716 | 0.081 | -0.533 | 0.284 | -0.606 |
| 4.153185488045588 | -0.848 | 0.719 | 0.079 | -0.531 | 0.281 | -0.609 |
| 4.156327080699177 | -0.849 | 0.721 | 0.078 | -0.528 | 0.279 | -0.613 |
| 4.159468673352766 | -0.851 | 0.724 | 0.076 | -0.525 | 0.276 | -0.616 |
| 4.162610266006356 | -0.853 | 0.727 | 0.075 | -0.522 | 0.273 | -0.62 |
| 4.165751858659946 | -0.854 | 0.73 | 0.073 | -0.52 | 0.27 | -0.623 |
| 4.168893451313535 | -0.856 | 0.733 | 0.072 | -0.517 | 0.267 | -0.627 |
| 4.172035043967125 | -0.858 | 0.735 | 0.07 | -0.514 | 0.265 | -0.631 |
| 4.175176636620715 | -0.859 | 0.738 | 0.069 | -0.512 | 0.262 | -0.634 |
| 4.178318229274304 | -0.861 | 0.741 | 0.067 | -0.509 | 0.259 | -0.638 |
| 4.181459821927894 | -0.862 | 0.744 | 0.066 | -0.506 | 0.256 | -0.641 |
| 4.184601414581484 | -0.864 | 0.746 | 0.064 | -0.504 | 0.254 | -0.645 |
| 4.187743007235073 | -0.866 | 0.749 | 0.063 | -0.501 | 0.251 | -0.648 |
| 4.190884599888663 | -0.867 | 0.752 | 0.062 | -0.498 | 0.248 | -0.652 |
| 4.194026192542252 | -0.869 | 0.755 | 0.06 | -0.495 | 0.245 | -0.655 |
| 4.197167785195842 | -0.87 | 0.757 | 0.059 | -0.493 | 0.243 | -0.659 |
| 4.200309377849432 | -0.872 | 0.76 | 0.058 | -0.49 | 0.24 | -0.662 |
| 4.203450970503021 | -0.873 | 0.763 | 0.056 | -0.487 | 0.237 | -0.666 |
| 4.206592563156611 | -0.875 | 0.765 | 0.055 | -0.485 | 0.235 | -0.669 |
| 4.2097341558102 | -0.876 | 0.768 | 0.054 | -0.482 | 0.232 | -0.673 |
| 4.21287574846379 | -0.878 | 0.771 | 0.053 | -0.479 | 0.229 | -0.676 |
| 4.21601734111738 | -0.879 | 0.773 | 0.051 | -0.476 | 0.227 | -0.68 |
| 4.21915893377097 | -0.881 | 0.776 | 0.05 | -0.473 | 0.224 | -0.683 |
| 4.222300526424559 | -0.882 | 0.778 | 0.049 | -0.471 | 0.222 | -0.687 |
| 4.225442119078148 | -0.884 | 0.781 | 0.048 | -0.468 | 0.219 | -0.69 |
| 4.228583711731738 | -0.885 | 0.784 | 0.047 | -0.465 | 0.216 | -0.694 |
| 4.231725304385327 | -0.887 | 0.786 | 0.046 | -0.462 | 0.214 | -0.697 |
| 4.234866897038917 | -0.888 | 0.789 | 0.045 | -0.46 | 0.211 | -0.701 |
| 4.238008489692506 | -0.89 | 0.791 | 0.044 | -0.457 | 0.209 | -0.704 |
| 4.241150082346096 | -0.891 | 0.794 | 0.042 | -0.454 | 0.206 | -0.707 |
| 4.244291674999685 | -0.892 | 0.796 | 0.041 | -0.451 | 0.204 | -0.711 |
| 4.247433267653276 | -0.894 | 0.799 | 0.04 | -0.448 | 0.201 | -0.714 |
| 4.250574860306865 | -0.895 | 0.801 | 0.039 | -0.446 | 0.199 | -0.718 |
| 4.253716452960455 | -0.897 | 0.804 | 0.038 | -0.443 | 0.196 | -0.721 |
| 4.256858045614044 | -0.898 | 0.806 | 0.037 | -0.44 | 0.194 | -0.724 |
| 4.259999638267634 | -0.899 | 0.809 | 0.037 | -0.437 | 0.191 | -0.728 |
| 4.263141230921224 | -0.901 | 0.811 | 0.036 | -0.434 | 0.189 | -0.731 |
| 4.266282823574813 | -0.902 | 0.814 | 0.035 | -0.431 | 0.186 | -0.734 |
| 4.269424416228403 | -0.903 | 0.816 | 0.034 | -0.429 | 0.184 | -0.738 |
| 4.272566008881992 | -0.905 | 0.819 | 0.033 | -0.426 | 0.181 | -0.741 |
| 4.275707601535582 | -0.906 | 0.821 | 0.032 | -0.423 | 0.179 | -0.744 |
| 4.27884919418917 | -0.907 | 0.824 | 0.031 | -0.42 | 0.176 | -0.747 |
| 4.28199078684276 | -0.909 | 0.826 | 0.03 | -0.417 | 0.174 | -0.751 |
| 4.285132379496351 | -0.91 | 0.828 | 0.029 | -0.414 | 0.172 | -0.754 |
| 4.28827397214994 | -0.911 | 0.831 | 0.029 | -0.412 | 0.169 | -0.757 |
| 4.29141556480353 | -0.913 | 0.833 | 0.028 | -0.409 | 0.167 | -0.76 |
| 4.294557157457119 | -0.914 | 0.835 | 0.027 | -0.406 | 0.165 | -0.763 |
| 4.29769875011071 | -0.915 | 0.838 | 0.026 | -0.403 | 0.162 | -0.767 |
| 4.300840342764299 | -0.917 | 0.84 | 0.026 | -0.4 | 0.16 | -0.77 |
| 4.303981935417888 | -0.918 | 0.842 | 0.025 | -0.397 | 0.158 | -0.773 |
| 4.307123528071478 | -0.919 | 0.845 | 0.024 | -0.394 | 0.155 | -0.776 |
| 4.310265120725067 | -0.92 | 0.847 | 0.023 | -0.391 | 0.153 | -0.779 |
| 4.313406713378657 | -0.921 | 0.849 | 0.023 | -0.388 | 0.151 | -0.782 |
| 4.316548306032247 | -0.923 | 0.851 | 0.022 | -0.386 | 0.149 | -0.785 |
| 4.319689898685836 | -0.924 | 0.854 | 0.021 | -0.383 | 0.146 | -0.789 |
| 4.322831491339426 | -0.925 | 0.856 | 0.021 | -0.38 | 0.144 | -0.792 |
| 4.325973083993015 | -0.926 | 0.858 | 0.02 | -0.377 | 0.142 | -0.795 |
| 4.329114676646605 | -0.927 | 0.86 | 0.02 | -0.374 | 0.14 | -0.798 |
| 4.332256269300195 | -0.929 | 0.862 | 0.019 | -0.371 | 0.138 | -0.801 |
| 4.335397861953784 | -0.93 | 0.864 | 0.018 | -0.368 | 0.136 | -0.804 |
| 4.338539454607374 | -0.931 | 0.867 | 0.018 | -0.365 | 0.133 | -0.807 |
| 4.341681047260963 | -0.932 | 0.869 | 0.017 | -0.362 | 0.131 | -0.81 |
| 4.344822639914553 | -0.933 | 0.871 | 0.017 | -0.359 | 0.129 | -0.813 |
| 4.347964232568143 | -0.934 | 0.873 | 0.016 | -0.356 | 0.127 | -0.816 |
| 4.351105825221732 | -0.935 | 0.875 | 0.016 | -0.353 | 0.125 | -0.819 |
| 4.354247417875322 | -0.937 | 0.877 | 0.015 | -0.351 | 0.123 | -0.821 |
| 4.357389010528911 | -0.938 | 0.879 | 0.015 | -0.348 | 0.121 | -0.824 |
| 4.360530603182501 | -0.939 | 0.881 | 0.014 | -0.345 | 0.119 | -0.827 |
| 4.36367219583609 | -0.94 | 0.883 | 0.014 | -0.342 | 0.117 | -0.83 |
| 4.36681378848968 | -0.941 | 0.885 | 0.013 | -0.339 | 0.115 | -0.833 |
| 4.36995538114327 | -0.942 | 0.887 | 0.013 | -0.336 | 0.113 | -0.836 |
| 4.373096973796859 | -0.943 | 0.889 | 0.012 | -0.333 | 0.111 | -0.839 |
| 4.376238566450449 | -0.944 | 0.891 | 0.012 | -0.33 | 0.109 | -0.841 |
| 4.379380159104038 | -0.945 | 0.893 | 0.011 | -0.327 | 0.107 | -0.844 |
| 4.382521751757628 | -0.946 | 0.895 | 0.011 | -0.324 | 0.105 | -0.847 |
| 4.385663344411217 | -0.947 | 0.897 | 0.011 | -0.321 | 0.103 | -0.85 |
| 4.388804937064807 | -0.948 | 0.899 | 0.01 | -0.318 | 0.101 | -0.852 |
| 4.391946529718397 | -0.949 | 0.901 | 0.01 | -0.315 | 0.099 | -0.855 |
| 4.395088122371987 | -0.95 | 0.903 | 0.009 | -0.312 | 0.097 | -0.858 |
| 4.398229715025576 | -0.951 | 0.905 | 0.009 | -0.309 | 0.095 | -0.86 |
| 4.401371307679165 | -0.952 | 0.906 | 0.009 | -0.306 | 0.094 | -0.863 |
| 4.404512900332755 | -0.953 | 0.908 | 0.008 | -0.303 | 0.092 | -0.865 |
| 4.407654492986345 | -0.954 | 0.91 | 0.008 | -0.3 | 0.09 | -0.868 |
| 4.410796085639934 | -0.955 | 0.912 | 0.008 | -0.297 | 0.088 | -0.871 |
| 4.413937678293524 | -0.956 | 0.914 | 0.007 | -0.294 | 0.086 | -0.873 |
| 4.417079270947114 | -0.957 | 0.915 | 0.007 | -0.291 | 0.085 | -0.876 |
| 4.420220863600703 | -0.958 | 0.917 | 0.007 | -0.288 | 0.083 | -0.878 |
| 4.423362456254293 | -0.959 | 0.919 | 0.007 | -0.285 | 0.081 | -0.881 |
| 4.426504048907883 | -0.959 | 0.92 | 0.006 | -0.282 | 0.08 | -0.883 |
| 4.429645641561472 | -0.96 | 0.922 | 0.006 | -0.279 | 0.078 | -0.886 |
| 4.432787234215062 | -0.961 | 0.924 | 0.006 | -0.276 | 0.076 | -0.888 |
| 4.435928826868651 | -0.962 | 0.925 | 0.006 | -0.273 | 0.075 | -0.89 |
| 4.43907041952224 | -0.963 | 0.927 | 0.005 | -0.27 | 0.073 | -0.893 |
| 4.44221201217583 | -0.964 | 0.929 | 0.005 | -0.267 | 0.071 | -0.895 |
| 4.44535360482942 | -0.965 | 0.93 | 0.005 | -0.264 | 0.07 | -0.897 |
| 4.44849519748301 | -0.965 | 0.932 | 0.005 | -0.261 | 0.068 | -0.9 |
| 4.4516367901366 | -0.966 | 0.934 | 0.004 | -0.258 | 0.066 | -0.902 |
| 4.454778382790188 | -0.967 | 0.935 | 0.004 | -0.255 | 0.065 | -0.904 |
| 4.457919975443779 | -0.968 | 0.937 | 0.004 | -0.252 | 0.063 | -0.906 |
| 4.461061568097368 | -0.969 | 0.938 | 0.004 | -0.249 | 0.062 | -0.909 |
| 4.464203160750958 | -0.969 | 0.94 | 0.004 | -0.246 | 0.06 | -0.911 |
| 4.467344753404547 | -0.97 | 0.941 | 0.003 | -0.243 | 0.059 | -0.913 |
| 4.470486346058137 | -0.971 | 0.943 | 0.003 | -0.24 | 0.057 | -0.915 |
| 4.473627938711726 | -0.972 | 0.944 | 0.003 | -0.236 | 0.056 | -0.917 |
| 4.476769531365316 | -0.972 | 0.946 | 0.003 | -0.233 | 0.054 | -0.919 |
| 4.479911124018905 | -0.973 | 0.947 | 0.003 | -0.23 | 0.053 | -0.921 |
| 4.483052716672495 | -0.974 | 0.948 | 0.003 | -0.227 | 0.052 | -0.923 |
| 4.486194309326085 | -0.975 | 0.95 | 0.003 | -0.224 | 0.05 | -0.926 |
| 4.489335901979674 | -0.975 | 0.951 | 0.002 | -0.221 | 0.049 | -0.928 |
| 4.492477494633264 | -0.976 | 0.952 | 0.002 | -0.218 | 0.048 | -0.929 |
| 4.495619087286854 | -0.977 | 0.954 | 0.002 | -0.215 | 0.046 | -0.931 |
| 4.498760679940443 | -0.977 | 0.955 | 0.002 | -0.212 | 0.045 | -0.933 |
| 4.501902272594033 | -0.978 | 0.956 | 0.002 | -0.209 | 0.044 | -0.935 |
| 4.505043865247622 | -0.979 | 0.958 | 0.002 | -0.206 | 0.042 | -0.937 |
| 4.508185457901212 | -0.979 | 0.959 | 0.002 | -0.203 | 0.041 | -0.939 |
| 4.511327050554801 | -0.98 | 0.96 | 0.002 | -0.2 | 0.04 | -0.941 |
| 4.514468643208391 | -0.98 | 0.961 | 0.001 | -0.197 | 0.039 | -0.943 |
| 4.517610235861981 | -0.981 | 0.963 | 0.001 | -0.194 | 0.037 | -0.944 |
| 4.520751828515571 | -0.982 | 0.964 | 0.001 | -0.19 | 0.036 | -0.946 |
| 4.52389342116916 | -0.982 | 0.965 | 0.001 | -0.187 | 0.035 | -0.948 |
| 4.52703501382275 | -0.983 | 0.966 | 0.001 | -0.184 | 0.034 | -0.949 |
| 4.530176606476339 | -0.983 | 0.967 | 0.001 | -0.181 | 0.033 | -0.951 |
| 4.533318199129928 | -0.984 | 0.968 | 0.001 | -0.178 | 0.032 | -0.953 |
| 4.536459791783518 | -0.985 | 0.969 | 0.001 | -0.175 | 0.031 | -0.954 |
| 4.539601384437108 | -0.985 | 0.97 | 0.001 | -0.172 | 0.03 | -0.956 |
| 4.542742977090698 | -0.986 | 0.971 | 0.001 | -0.169 | 0.029 | -0.958 |
| 4.545884569744287 | -0.986 | 0.973 | 0.001 | -0.166 | 0.027 | -0.959 |
| 4.549026162397876 | -0.987 | 0.974 | 0.001 | -0.163 | 0.026 | -0.961 |
| 4.552167755051466 | -0.987 | 0.975 | 0.001 | -0.16 | 0.025 | -0.962 |
| 4.555309347705056 | -0.988 | 0.976 | 0.001 | -0.156 | 0.024 | -0.964 |
| 4.558450940358646 | -0.988 | 0.976 | 0.001 | -0.153 | 0.024 | -0.965 |
| 4.561592533012235 | -0.989 | 0.977 | 0.001 | -0.15 | 0.023 | -0.966 |
| 4.564734125665825 | -0.989 | 0.978 | 0 | -0.147 | 0.022 | -0.968 |
| 4.567875718319415 | -0.99 | 0.979 | 0 | -0.144 | 0.021 | -0.969 |
| 4.571017310973004 | -0.99 | 0.98 | 0 | -0.141 | 0.02 | -0.97 |
| 4.574158903626594 | -0.99 | 0.981 | 0 | -0.138 | 0.019 | -0.972 |
| 4.577300496280183 | -0.991 | 0.982 | 0 | -0.135 | 0.018 | -0.973 |
| 4.580442088933772 | -0.991 | 0.983 | 0 | -0.132 | 0.017 | -0.974 |
| 4.583583681587362 | -0.992 | 0.984 | 0 | -0.128 | 0.016 | -0.975 |
| 4.586725274240952 | -0.992 | 0.984 | 0 | -0.125 | 0.016 | -0.977 |
| 4.589866866894542 | -0.993 | 0.985 | 0 | -0.122 | 0.015 | -0.978 |
| 4.593008459548131 | -0.993 | 0.986 | 0 | -0.119 | 0.014 | -0.979 |
| 4.596150052201721 | -0.993 | 0.987 | 0 | -0.116 | 0.013 | -0.98 |
| 4.59929164485531 | -0.994 | 0.987 | 0 | -0.113 | 0.013 | -0.981 |
| 4.6024332375089 | -0.994 | 0.988 | 0 | -0.11 | 0.012 | -0.982 |
| 4.60557483016249 | -0.994 | 0.989 | 0 | -0.107 | 0.011 | -0.983 |
| 4.608716422816079 | -0.995 | 0.989 | 0 | -0.103 | 0.011 | -0.984 |
| 4.611858015469668 | -0.995 | 0.99 | 0 | -0.1 | 0.01 | -0.985 |
| 4.614999608123258 | -0.995 | 0.991 | 0 | -0.097 | 0.009 | -0.986 |
| 4.618141200776848 | -0.996 | 0.991 | 0 | -0.094 | 0.009 | -0.987 |
| 4.621282793430437 | -0.996 | 0.992 | 0 | -0.091 | 0.008 | -0.988 |
| 4.624424386084027 | -0.996 | 0.992 | 0 | -0.088 | 0.008 | -0.988 |
| 4.627565978737617 | -0.996 | 0.993 | 0 | -0.085 | 0.007 | -0.989 |
| 4.630707571391206 | -0.997 | 0.993 | 0 | -0.082 | 0.007 | -0.99 |
| 4.633849164044795 | -0.997 | 0.994 | 0 | -0.078 | 0.006 | -0.991 |
| 4.636990756698386 | -0.997 | 0.994 | 0 | -0.075 | 0.006 | -0.992 |
| 4.640132349351975 | -0.997 | 0.995 | 0 | -0.072 | 0.005 | -0.992 |
| 4.643273942005564 | -0.998 | 0.995 | 0 | -0.069 | 0.005 | -0.993 |
| 4.646415534659154 | -0.998 | 0.996 | 0 | -0.066 | 0.004 | -0.993 |
| 4.649557127312744 | -0.998 | 0.996 | 0 | -0.063 | 0.004 | -0.994 |
| 4.652698719966334 | -0.998 | 0.996 | 0 | -0.06 | 0.004 | -0.995 |
| 4.655840312619923 | -0.998 | 0.997 | 0 | -0.057 | 0.003 | -0.995 |
| 4.658981905273513 | -0.999 | 0.997 | 0 | -0.053 | 0.003 | -0.996 |
| 4.662123497927102 | -0.999 | 0.997 | 0 | -0.05 | 0.003 | -0.996 |
| 4.665265090580692 | -0.999 | 0.998 | 0 | -0.047 | 0.002 | -0.997 |
| 4.668406683234282 | -0.999 | 0.998 | 0 | -0.044 | 0.002 | -0.997 |
| 4.671548275887871 | -0.999 | 0.998 | 0 | -0.041 | 0.002 | -0.998 |
| 4.674689868541461 | -0.999 | 0.999 | 0 | -0.038 | 0.001 | -0.998 |
| 4.67783146119505 | -0.999 | 0.999 | 0 | -0.035 | 0.001 | -0.998 |
| 4.68097305384864 | -1 | 0.999 | 0 | -0.031 | 0.001 | -0.999 |
| 4.68411464650223 | -1 | 0.999 | 0 | -0.028 | 0.001 | -0.999 |
| 4.687256239155819 | -1 | 0.999 | 0 | -0.025 | 0.001 | -0.999 |
| 4.690397831809409 | -1 | 1 | 0 | -0.022 | 0 | -0.999 |
| 4.693539424462998 | -1 | 1 | 0 | -0.019 | 0 | -0.999 |
| 4.696681017116588 | -1 | 1 | 0 | -0.016 | 0 | -1 |
| 4.699822609770177 | -1 | 1 | 0 | -0.013 | 0 | -1 |
| 4.702964202423767 | -1 | 1 | 0 | -0.009 | 0 | -1 |
| 4.706105795077356 | -1 | 1 | 0 | -0.006 | 0 | -1 |
| 4.709247387730946 | -1 | 1 | 0 | -0.003 | 0 | -1 |
| 4.712388980384535 | -1 | 1 | 0 | 0 | 0 | -1 |
| 4.715530573038126 | -1 | 1 | 0 | 0.003 | 0 | -1 |
| 4.718672165691715 | -1 | 1 | 0 | 0.006 | 0 | -1 |
| 4.721813758345305 | -1 | 1 | 0 | 0.009 | 0 | -1 |
| 4.724955350998894 | -1 | 1 | 0 | 0.013 | 0 | -1 |
| 4.728096943652484 | -1 | 1 | 0 | 0.016 | 0 | -1 |
| 4.731238536306074 | -1 | 1 | 0 | 0.019 | 0 | -0.999 |
| 4.734380128959663 | -1 | 1 | 0 | 0.022 | 0 | -0.999 |
| 4.737521721613253 | -1 | 0.999 | 0 | 0.025 | 0.001 | -0.999 |
| 4.740663314266842 | -1 | 0.999 | 0 | 0.028 | 0.001 | -0.999 |
| 4.743804906920432 | -1 | 0.999 | 0 | 0.031 | 0.001 | -0.999 |
| 4.74694649957402 | -0.999 | 0.999 | 0 | 0.035 | 0.001 | -0.998 |
| 4.750088092227611 | -0.999 | 0.999 | 0 | 0.038 | 0.001 | -0.998 |
| 4.7532296848812 | -0.999 | 0.998 | 0 | 0.041 | 0.002 | -0.998 |
| 4.75637127753479 | -0.999 | 0.998 | 0 | 0.044 | 0.002 | -0.997 |
| 4.75951287018838 | -0.999 | 0.998 | 0 | 0.047 | 0.002 | -0.997 |
| 4.76265446284197 | -0.999 | 0.997 | 0 | 0.05 | 0.003 | -0.996 |
| 4.765796055495559 | -0.999 | 0.997 | 0 | 0.053 | 0.003 | -0.996 |
| 4.768937648149149 | -0.998 | 0.997 | 0 | 0.057 | 0.003 | -0.995 |
| 4.772079240802738 | -0.998 | 0.996 | 0 | 0.06 | 0.004 | -0.995 |
| 4.775220833456327 | -0.998 | 0.996 | 0 | 0.063 | 0.004 | -0.994 |
| 4.778362426109917 | -0.998 | 0.996 | 0 | 0.066 | 0.004 | -0.993 |
| 4.781504018763507 | -0.998 | 0.995 | 0 | 0.069 | 0.005 | -0.993 |
| 4.784645611417097 | -0.997 | 0.995 | 0 | 0.072 | 0.005 | -0.992 |
| 4.787787204070686 | -0.997 | 0.994 | 0 | 0.075 | 0.006 | -0.992 |
| 4.790928796724275 | -0.997 | 0.994 | 0 | 0.078 | 0.006 | -0.991 |
| 4.794070389377865 | -0.997 | 0.993 | 0 | 0.082 | 0.007 | -0.99 |
| 4.797211982031455 | -0.996 | 0.993 | 0 | 0.085 | 0.007 | -0.989 |
| 4.800353574685045 | -0.996 | 0.992 | 0 | 0.088 | 0.008 | -0.988 |
| 4.803495167338634 | -0.996 | 0.992 | 0 | 0.091 | 0.008 | -0.988 |
| 4.806636759992224 | -0.996 | 0.991 | 0 | 0.094 | 0.009 | -0.987 |
| 4.809778352645814 | -0.995 | 0.991 | 0 | 0.097 | 0.009 | -0.986 |
| 4.812919945299403 | -0.995 | 0.99 | 0 | 0.1 | 0.01 | -0.985 |
| 4.816061537952993 | -0.995 | 0.989 | 0 | 0.103 | 0.011 | -0.984 |
| 4.819203130606582 | -0.994 | 0.989 | 0 | 0.107 | 0.011 | -0.983 |
| 4.822344723260172 | -0.994 | 0.988 | 0 | 0.11 | 0.012 | -0.982 |
| 4.825486315913761 | -0.994 | 0.987 | 0 | 0.113 | 0.013 | -0.981 |
| 4.828627908567351 | -0.993 | 0.987 | 0 | 0.116 | 0.013 | -0.98 |
| 4.83176950122094 | -0.993 | 0.986 | 0 | 0.119 | 0.014 | -0.979 |
| 4.83491109387453 | -0.993 | 0.985 | 0 | 0.122 | 0.015 | -0.978 |
| 4.83805268652812 | -0.992 | 0.984 | 0 | 0.125 | 0.016 | -0.977 |
| 4.841194279181709 | -0.992 | 0.984 | 0 | 0.128 | 0.016 | -0.975 |
| 4.844335871835299 | -0.991 | 0.983 | 0 | 0.132 | 0.017 | -0.974 |
| 4.847477464488889 | -0.991 | 0.982 | 0 | 0.135 | 0.018 | -0.973 |
| 4.850619057142478 | -0.99 | 0.981 | 0 | 0.138 | 0.019 | -0.972 |
| 4.853760649796068 | -0.99 | 0.98 | 0 | 0.141 | 0.02 | -0.97 |
| 4.856902242449657 | -0.99 | 0.979 | 0 | 0.144 | 0.021 | -0.969 |
| 4.860043835103247 | -0.989 | 0.978 | 0 | 0.147 | 0.022 | -0.968 |
| 4.863185427756837 | -0.989 | 0.977 | 0.001 | 0.15 | 0.023 | -0.966 |
| 4.866327020410426 | -0.988 | 0.976 | 0.001 | 0.153 | 0.024 | -0.965 |
| 4.869468613064015 | -0.988 | 0.976 | 0.001 | 0.156 | 0.024 | -0.964 |
| 4.872610205717605 | -0.987 | 0.975 | 0.001 | 0.16 | 0.025 | -0.962 |
| 4.875751798371195 | -0.987 | 0.974 | 0.001 | 0.163 | 0.026 | -0.961 |
| 4.878893391024784 | -0.986 | 0.973 | 0.001 | 0.166 | 0.027 | -0.959 |
| 4.882034983678374 | -0.986 | 0.971 | 0.001 | 0.169 | 0.029 | -0.958 |
| 4.885176576331964 | -0.985 | 0.97 | 0.001 | 0.172 | 0.03 | -0.956 |
| 4.888318168985553 | -0.985 | 0.969 | 0.001 | 0.175 | 0.031 | -0.954 |
| 4.891459761639143 | -0.984 | 0.968 | 0.001 | 0.178 | 0.032 | -0.953 |
| 4.894601354292733 | -0.983 | 0.967 | 0.001 | 0.181 | 0.033 | -0.951 |
| 4.897742946946322 | -0.983 | 0.966 | 0.001 | 0.184 | 0.034 | -0.949 |
| 4.900884539599912 | -0.982 | 0.965 | 0.001 | 0.187 | 0.035 | -0.948 |
| 4.904026132253501 | -0.982 | 0.964 | 0.001 | 0.19 | 0.036 | -0.946 |
| 4.907167724907091 | -0.981 | 0.963 | 0.001 | 0.194 | 0.037 | -0.944 |
| 4.91030931756068 | -0.98 | 0.961 | 0.001 | 0.197 | 0.039 | -0.943 |
| 4.91345091021427 | -0.98 | 0.96 | 0.002 | 0.2 | 0.04 | -0.941 |
| 4.91659250286786 | -0.979 | 0.959 | 0.002 | 0.203 | 0.041 | -0.939 |
| 4.91973409552145 | -0.979 | 0.958 | 0.002 | 0.206 | 0.042 | -0.937 |
| 4.922875688175039 | -0.978 | 0.956 | 0.002 | 0.209 | 0.044 | -0.935 |
| 4.926017280828628 | -0.977 | 0.955 | 0.002 | 0.212 | 0.045 | -0.933 |
| 4.929158873482218 | -0.977 | 0.954 | 0.002 | 0.215 | 0.046 | -0.931 |
| 4.932300466135808 | -0.976 | 0.952 | 0.002 | 0.218 | 0.048 | -0.929 |
| 4.935442058789397 | -0.975 | 0.951 | 0.002 | 0.221 | 0.049 | -0.928 |
| 4.938583651442987 | -0.975 | 0.95 | 0.003 | 0.224 | 0.05 | -0.926 |
| 4.941725244096576 | -0.974 | 0.948 | 0.003 | 0.227 | 0.052 | -0.923 |
| 4.944866836750166 | -0.973 | 0.947 | 0.003 | 0.23 | 0.053 | -0.921 |
| 4.948008429403755 | -0.972 | 0.946 | 0.003 | 0.233 | 0.054 | -0.919 |
| 4.951150022057345 | -0.972 | 0.944 | 0.003 | 0.236 | 0.056 | -0.917 |
| 4.954291614710935 | -0.971 | 0.943 | 0.003 | 0.24 | 0.057 | -0.915 |
| 4.957433207364524 | -0.97 | 0.941 | 0.003 | 0.243 | 0.059 | -0.913 |
| 4.960574800018114 | -0.969 | 0.94 | 0.004 | 0.246 | 0.06 | -0.911 |
| 4.963716392671704 | -0.969 | 0.938 | 0.004 | 0.249 | 0.062 | -0.909 |
| 4.966857985325293 | -0.968 | 0.937 | 0.004 | 0.252 | 0.063 | -0.906 |
| 4.969999577978883 | -0.967 | 0.935 | 0.004 | 0.255 | 0.065 | -0.904 |
| 4.973141170632472 | -0.966 | 0.934 | 0.004 | 0.258 | 0.066 | -0.902 |
| 4.976282763286062 | -0.965 | 0.932 | 0.005 | 0.261 | 0.068 | -0.9 |
| 4.979424355939651 | -0.965 | 0.93 | 0.005 | 0.264 | 0.07 | -0.897 |
| 4.982565948593241 | -0.964 | 0.929 | 0.005 | 0.267 | 0.071 | -0.895 |
| 4.985707541246831 | -0.963 | 0.927 | 0.005 | 0.27 | 0.073 | -0.893 |
| 4.98884913390042 | -0.962 | 0.925 | 0.006 | 0.273 | 0.075 | -0.89 |
| 4.99199072655401 | -0.961 | 0.924 | 0.006 | 0.276 | 0.076 | -0.888 |
| 4.9951323192076 | -0.96 | 0.922 | 0.006 | 0.279 | 0.078 | -0.886 |
| 4.99827391186119 | -0.959 | 0.92 | 0.006 | 0.282 | 0.08 | -0.883 |
| 5.00141550451478 | -0.959 | 0.919 | 0.007 | 0.285 | 0.081 | -0.881 |
| 5.004557097168369 | -0.958 | 0.917 | 0.007 | 0.288 | 0.083 | -0.878 |
| 5.007698689821958 | -0.957 | 0.915 | 0.007 | 0.291 | 0.085 | -0.876 |
| 5.010840282475548 | -0.956 | 0.914 | 0.007 | 0.294 | 0.086 | -0.873 |
| 5.013981875129137 | -0.955 | 0.912 | 0.008 | 0.297 | 0.088 | -0.871 |
| 5.017123467782727 | -0.954 | 0.91 | 0.008 | 0.3 | 0.09 | -0.868 |
| 5.020265060436317 | -0.953 | 0.908 | 0.008 | 0.303 | 0.092 | -0.865 |
| 5.023406653089906 | -0.952 | 0.906 | 0.009 | 0.306 | 0.094 | -0.863 |
| 5.026548245743496 | -0.951 | 0.905 | 0.009 | 0.309 | 0.095 | -0.86 |
| 5.029689838397085 | -0.95 | 0.903 | 0.009 | 0.312 | 0.097 | -0.858 |
| 5.032831431050674 | -0.949 | 0.901 | 0.01 | 0.315 | 0.099 | -0.855 |
| 5.035973023704264 | -0.948 | 0.899 | 0.01 | 0.318 | 0.101 | -0.852 |
| 5.039114616357854 | -0.947 | 0.897 | 0.011 | 0.321 | 0.103 | -0.85 |
| 5.042256209011444 | -0.946 | 0.895 | 0.011 | 0.324 | 0.105 | -0.847 |
| 5.045397801665033 | -0.945 | 0.893 | 0.011 | 0.327 | 0.107 | -0.844 |
| 5.048539394318622 | -0.944 | 0.891 | 0.012 | 0.33 | 0.109 | -0.841 |
| 5.051680986972213 | -0.943 | 0.889 | 0.012 | 0.333 | 0.111 | -0.839 |
| 5.054822579625802 | -0.942 | 0.887 | 0.013 | 0.336 | 0.113 | -0.836 |
| 5.057964172279392 | -0.941 | 0.885 | 0.013 | 0.339 | 0.115 | -0.833 |
| 5.061105764932981 | -0.94 | 0.883 | 0.014 | 0.342 | 0.117 | -0.83 |
| 5.064247357586571 | -0.939 | 0.881 | 0.014 | 0.345 | 0.119 | -0.827 |
| 5.067388950240161 | -0.938 | 0.879 | 0.015 | 0.348 | 0.121 | -0.824 |
| 5.07053054289375 | -0.937 | 0.877 | 0.015 | 0.351 | 0.123 | -0.821 |
| 5.07367213554734 | -0.935 | 0.875 | 0.016 | 0.353 | 0.125 | -0.819 |
| 5.07681372820093 | -0.934 | 0.873 | 0.016 | 0.356 | 0.127 | -0.816 |
| 5.079955320854519 | -0.933 | 0.871 | 0.017 | 0.359 | 0.129 | -0.813 |
| 5.083096913508108 | -0.932 | 0.869 | 0.017 | 0.362 | 0.131 | -0.81 |
| 5.086238506161698 | -0.931 | 0.867 | 0.018 | 0.365 | 0.133 | -0.807 |
| 5.089380098815288 | -0.93 | 0.864 | 0.018 | 0.368 | 0.136 | -0.804 |
| 5.092521691468877 | -0.929 | 0.862 | 0.019 | 0.371 | 0.138 | -0.801 |
| 5.095663284122466 | -0.927 | 0.86 | 0.02 | 0.374 | 0.14 | -0.798 |
| 5.098804876776057 | -0.926 | 0.858 | 0.02 | 0.377 | 0.142 | -0.795 |
| 5.101946469429646 | -0.925 | 0.856 | 0.021 | 0.38 | 0.144 | -0.792 |
| 5.105088062083236 | -0.924 | 0.854 | 0.021 | 0.383 | 0.146 | -0.789 |
| 5.108229654736825 | -0.923 | 0.851 | 0.022 | 0.386 | 0.149 | -0.785 |
| 5.111371247390415 | -0.921 | 0.849 | 0.023 | 0.388 | 0.151 | -0.782 |
| 5.114512840044005 | -0.92 | 0.847 | 0.023 | 0.391 | 0.153 | -0.779 |
| 5.117654432697594 | -0.919 | 0.845 | 0.024 | 0.394 | 0.155 | -0.776 |
| 5.120796025351184 | -0.918 | 0.842 | 0.025 | 0.397 | 0.158 | -0.773 |
| 5.123937618004773 | -0.917 | 0.84 | 0.026 | 0.4 | 0.16 | -0.77 |
| 5.127079210658363 | -0.915 | 0.838 | 0.026 | 0.403 | 0.162 | -0.767 |
| 5.130220803311953 | -0.914 | 0.835 | 0.027 | 0.406 | 0.165 | -0.763 |
| 5.133362395965542 | -0.913 | 0.833 | 0.028 | 0.409 | 0.167 | -0.76 |
| 5.136503988619131 | -0.911 | 0.831 | 0.029 | 0.412 | 0.169 | -0.757 |
| 5.13964558127272 | -0.91 | 0.828 | 0.029 | 0.414 | 0.172 | -0.754 |
| 5.142787173926311 | -0.909 | 0.826 | 0.03 | 0.417 | 0.174 | -0.751 |
| 5.1459287665799 | -0.907 | 0.824 | 0.031 | 0.42 | 0.176 | -0.747 |
| 5.14907035923349 | -0.906 | 0.821 | 0.032 | 0.423 | 0.179 | -0.744 |
| 5.15221195188708 | -0.905 | 0.819 | 0.033 | 0.426 | 0.181 | -0.741 |
| 5.15535354454067 | -0.903 | 0.816 | 0.034 | 0.429 | 0.184 | -0.738 |
| 5.158495137194259 | -0.902 | 0.814 | 0.035 | 0.431 | 0.186 | -0.734 |
| 5.161636729847848 | -0.901 | 0.811 | 0.036 | 0.434 | 0.189 | -0.731 |
| 5.164778322501438 | -0.899 | 0.809 | 0.037 | 0.437 | 0.191 | -0.728 |
| 5.167919915155028 | -0.898 | 0.806 | 0.037 | 0.44 | 0.194 | -0.724 |
| 5.171061507808617 | -0.897 | 0.804 | 0.038 | 0.443 | 0.196 | -0.721 |
| 5.174203100462206 | -0.895 | 0.801 | 0.039 | 0.446 | 0.199 | -0.718 |
| 5.177344693115796 | -0.894 | 0.799 | 0.04 | 0.448 | 0.201 | -0.714 |
| 5.180486285769386 | -0.892 | 0.796 | 0.041 | 0.451 | 0.204 | -0.711 |
| 5.183627878422976 | -0.891 | 0.794 | 0.042 | 0.454 | 0.206 | -0.707 |
| 5.186769471076565 | -0.89 | 0.791 | 0.044 | 0.457 | 0.209 | -0.704 |
| 5.189911063730155 | -0.888 | 0.789 | 0.045 | 0.46 | 0.211 | -0.701 |
| 5.193052656383744 | -0.887 | 0.786 | 0.046 | 0.462 | 0.214 | -0.697 |
| 5.196194249037334 | -0.885 | 0.784 | 0.047 | 0.465 | 0.216 | -0.694 |
| 5.199335841690924 | -0.884 | 0.781 | 0.048 | 0.468 | 0.219 | -0.69 |
| 5.202477434344513 | -0.882 | 0.778 | 0.049 | 0.471 | 0.222 | -0.687 |
| 5.205619026998103 | -0.881 | 0.776 | 0.05 | 0.473 | 0.224 | -0.683 |
| 5.208760619651692 | -0.879 | 0.773 | 0.051 | 0.476 | 0.227 | -0.68 |
| 5.211902212305282 | -0.878 | 0.771 | 0.053 | 0.479 | 0.229 | -0.676 |
| 5.215043804958871 | -0.876 | 0.768 | 0.054 | 0.482 | 0.232 | -0.673 |
| 5.218185397612461 | -0.875 | 0.765 | 0.055 | 0.485 | 0.235 | -0.669 |
| 5.221326990266051 | -0.873 | 0.763 | 0.056 | 0.487 | 0.237 | -0.666 |
| 5.22446858291964 | -0.872 | 0.76 | 0.058 | 0.49 | 0.24 | -0.662 |
| 5.22761017557323 | -0.87 | 0.757 | 0.059 | 0.493 | 0.243 | -0.659 |
| 5.23075176822682 | -0.869 | 0.755 | 0.06 | 0.495 | 0.245 | -0.655 |
| 5.23389336088041 | -0.867 | 0.752 | 0.062 | 0.498 | 0.248 | -0.652 |
| 5.237034953533999 | -0.866 | 0.749 | 0.063 | 0.501 | 0.251 | -0.648 |
| 5.240176546187588 | -0.864 | 0.746 | 0.064 | 0.504 | 0.254 | -0.645 |
| 5.243318138841178 | -0.862 | 0.744 | 0.066 | 0.506 | 0.256 | -0.641 |
| 5.246459731494767 | -0.861 | 0.741 | 0.067 | 0.509 | 0.259 | -0.638 |
| 5.249601324148357 | -0.859 | 0.738 | 0.069 | 0.512 | 0.262 | -0.634 |
| 5.252742916801947 | -0.858 | 0.735 | 0.07 | 0.514 | 0.265 | -0.631 |
| 5.255884509455536 | -0.856 | 0.733 | 0.072 | 0.517 | 0.267 | -0.627 |
| 5.259026102109125 | -0.854 | 0.73 | 0.073 | 0.52 | 0.27 | -0.623 |
| 5.262167694762715 | -0.853 | 0.727 | 0.075 | 0.522 | 0.273 | -0.62 |
| 5.265309287416305 | -0.851 | 0.724 | 0.076 | 0.525 | 0.276 | -0.616 |
| 5.268450880069895 | -0.849 | 0.721 | 0.078 | 0.528 | 0.279 | -0.613 |
| 5.271592472723484 | -0.848 | 0.719 | 0.079 | 0.531 | 0.281 | -0.609 |
| 5.274734065377074 | -0.846 | 0.716 | 0.081 | 0.533 | 0.284 | -0.606 |
| 5.277875658030664 | -0.844 | 0.713 | 0.082 | 0.536 | 0.287 | -0.602 |
| 5.281017250684253 | -0.843 | 0.71 | 0.084 | 0.538 | 0.29 | -0.598 |
| 5.284158843337843 | -0.841 | 0.707 | 0.086 | 0.541 | 0.293 | -0.595 |
| 5.287300435991432 | -0.839 | 0.704 | 0.087 | 0.544 | 0.296 | -0.591 |
| 5.290442028645022 | -0.838 | 0.701 | 0.089 | 0.546 | 0.299 | -0.587 |
| 5.293583621298612 | -0.836 | 0.699 | 0.091 | 0.549 | 0.301 | -0.584 |
| 5.296725213952201 | -0.834 | 0.696 | 0.093 | 0.552 | 0.304 | -0.58 |
| 5.299866806605791 | -0.832 | 0.693 | 0.094 | 0.554 | 0.307 | -0.577 |
| 5.30300839925938 | -0.831 | 0.69 | 0.096 | 0.557 | 0.31 | -0.573 |
| 5.30614999191297 | -0.829 | 0.687 | 0.098 | 0.559 | 0.313 | -0.569 |
| 5.30929158456656 | -0.827 | 0.684 | 0.1 | 0.562 | 0.316 | -0.566 |
| 5.312433177220149 | -0.825 | 0.681 | 0.102 | 0.565 | 0.319 | -0.562 |
| 5.315574769873739 | -0.824 | 0.678 | 0.104 | 0.567 | 0.322 | -0.559 |
| 5.318716362527328 | -0.822 | 0.675 | 0.105 | 0.57 | 0.325 | -0.555 |
| 5.321857955180918 | -0.82 | 0.672 | 0.107 | 0.572 | 0.328 | -0.551 |
| 5.324999547834508 | -0.818 | 0.669 | 0.109 | 0.575 | 0.331 | -0.548 |
| 5.328141140488097 | -0.816 | 0.666 | 0.111 | 0.578 | 0.334 | -0.544 |
| 5.331282733141686 | -0.815 | 0.663 | 0.113 | 0.58 | 0.337 | -0.54 |
| 5.334424325795276 | -0.813 | 0.66 | 0.115 | 0.583 | 0.34 | -0.537 |
| 5.337565918448866 | -0.811 | 0.657 | 0.117 | 0.585 | 0.343 | -0.533 |
| 5.340707511102456 | -0.809 | 0.655 | 0.119 | 0.588 | 0.345 | -0.53 |
| 5.343849103756045 | -0.807 | 0.652 | 0.121 | 0.59 | 0.348 | -0.526 |
| 5.346990696409634 | -0.805 | 0.649 | 0.124 | 0.593 | 0.351 | -0.522 |
| 5.350132289063224 | -0.803 | 0.646 | 0.126 | 0.595 | 0.354 | -0.519 |
| 5.353273881716814 | -0.802 | 0.643 | 0.128 | 0.598 | 0.357 | -0.515 |
| 5.356415474370403 | -0.8 | 0.639 | 0.13 | 0.6 | 0.361 | -0.511 |
| 5.359557067023993 | -0.798 | 0.636 | 0.132 | 0.603 | 0.364 | -0.508 |
| 5.362698659677583 | -0.796 | 0.633 | 0.134 | 0.605 | 0.367 | -0.504 |
| 5.365840252331172 | -0.794 | 0.63 | 0.137 | 0.608 | 0.37 | -0.501 |
| 5.368981844984762 | -0.792 | 0.627 | 0.139 | 0.61 | 0.373 | -0.497 |
| 5.372123437638351 | -0.79 | 0.624 | 0.141 | 0.613 | 0.376 | -0.493 |
| 5.375265030291941 | -0.788 | 0.621 | 0.143 | 0.615 | 0.379 | -0.49 |
| 5.378406622945531 | -0.786 | 0.618 | 0.146 | 0.618 | 0.382 | -0.486 |
| 5.38154821559912 | -0.784 | 0.615 | 0.148 | 0.62 | 0.385 | -0.483 |
| 5.38468980825271 | -0.782 | 0.612 | 0.15 | 0.623 | 0.388 | -0.479 |
| 5.387831400906299 | -0.78 | 0.609 | 0.153 | 0.625 | 0.391 | -0.475 |
| 5.39097299355989 | -0.778 | 0.606 | 0.155 | 0.628 | 0.394 | -0.472 |
| 5.394114586213479 | -0.776 | 0.603 | 0.158 | 0.63 | 0.397 | -0.468 |
| 5.397256178867068 | -0.775 | 0.6 | 0.16 | 0.633 | 0.4 | -0.465 |
| 5.400397771520657 | -0.773 | 0.597 | 0.163 | 0.635 | 0.403 | -0.461 |
| 5.403539364174247 | -0.771 | 0.594 | 0.165 | 0.637 | 0.406 | -0.457 |
| 5.406680956827837 | -0.769 | 0.591 | 0.168 | 0.64 | 0.409 | -0.454 |
| 5.409822549481426 | -0.766 | 0.588 | 0.17 | 0.642 | 0.412 | -0.45 |
| 5.412964142135016 | -0.764 | 0.584 | 0.173 | 0.645 | 0.416 | -0.447 |
| 5.416105734788605 | -0.762 | 0.581 | 0.175 | 0.647 | 0.419 | -0.443 |
| 5.419247327442195 | -0.76 | 0.578 | 0.178 | 0.649 | 0.422 | -0.44 |
| 5.422388920095785 | -0.758 | 0.575 | 0.181 | 0.652 | 0.425 | -0.436 |
| 5.425530512749375 | -0.756 | 0.572 | 0.183 | 0.654 | 0.428 | -0.433 |
| 5.428672105402964 | -0.754 | 0.569 | 0.186 | 0.657 | 0.431 | -0.429 |
| 5.431813698056554 | -0.752 | 0.566 | 0.189 | 0.659 | 0.434 | -0.426 |
| 5.434955290710143 | -0.75 | 0.563 | 0.191 | 0.661 | 0.437 | -0.422 |
| 5.438096883363733 | -0.748 | 0.56 | 0.194 | 0.664 | 0.44 | -0.419 |
| 5.441238476017322 | -0.746 | 0.556 | 0.197 | 0.666 | 0.444 | -0.415 |
| 5.444380068670912 | -0.744 | 0.553 | 0.2 | 0.668 | 0.447 | -0.412 |
| 5.447521661324502 | -0.742 | 0.55 | 0.202 | 0.671 | 0.45 | -0.408 |
| 5.450663253978091 | -0.74 | 0.547 | 0.205 | 0.673 | 0.453 | -0.405 |
| 5.453804846631681 | -0.738 | 0.544 | 0.208 | 0.675 | 0.456 | -0.401 |
| 5.456946439285271 | -0.735 | 0.541 | 0.211 | 0.678 | 0.459 | -0.398 |
| 5.46008803193886 | -0.733 | 0.538 | 0.214 | 0.68 | 0.462 | -0.394 |
| 5.46322962459245 | -0.731 | 0.535 | 0.217 | 0.682 | 0.465 | -0.391 |
| 5.466371217246039 | -0.729 | 0.531 | 0.22 | 0.685 | 0.469 | -0.387 |
| 5.46951280989963 | -0.727 | 0.528 | 0.223 | 0.687 | 0.472 | -0.384 |
| 5.472654402553218 | -0.725 | 0.525 | 0.226 | 0.689 | 0.475 | -0.381 |
| 5.475795995206808 | -0.722 | 0.522 | 0.228 | 0.691 | 0.478 | -0.377 |
| 5.478937587860398 | -0.72 | 0.519 | 0.232 | 0.694 | 0.481 | -0.374 |
| 5.482079180513987 | -0.718 | 0.516 | 0.235 | 0.696 | 0.484 | -0.37 |
| 5.485220773167577 | -0.716 | 0.513 | 0.238 | 0.698 | 0.487 | -0.367 |
| 5.488362365821166 | -0.714 | 0.509 | 0.241 | 0.7 | 0.491 | -0.364 |
| 5.491503958474756 | -0.712 | 0.506 | 0.244 | 0.703 | 0.494 | -0.36 |
| 5.494645551128346 | -0.709 | 0.503 | 0.247 | 0.705 | 0.497 | -0.357 |
| 5.497787143781935 | -0.707 | 0.5 | 0.25 | 0.707 | 0.5 | -0.354 |
| 5.500928736435525 | -0.705 | 0.497 | 0.253 | 0.709 | 0.503 | -0.35 |
| 5.504070329089115 | -0.703 | 0.494 | 0.256 | 0.712 | 0.506 | -0.347 |
| 5.507211921742704 | -0.7 | 0.491 | 0.26 | 0.714 | 0.509 | -0.344 |
| 5.510353514396294 | -0.698 | 0.487 | 0.263 | 0.716 | 0.513 | -0.34 |
| 5.513495107049883 | -0.696 | 0.484 | 0.266 | 0.718 | 0.516 | -0.337 |
| 5.516636699703473 | -0.694 | 0.481 | 0.269 | 0.72 | 0.519 | -0.334 |
| 5.519778292357062 | -0.691 | 0.478 | 0.272 | 0.722 | 0.522 | -0.33 |
| 5.522919885010652 | -0.689 | 0.475 | 0.276 | 0.725 | 0.525 | -0.327 |
| 5.526061477664242 | -0.687 | 0.472 | 0.279 | 0.727 | 0.528 | -0.324 |
| 5.529203070317831 | -0.685 | 0.469 | 0.282 | 0.729 | 0.531 | -0.321 |
| 5.532344662971421 | -0.682 | 0.465 | 0.286 | 0.731 | 0.535 | -0.318 |
| 5.535486255625011 | -0.68 | 0.462 | 0.289 | 0.733 | 0.538 | -0.314 |
| 5.5386278482786 | -0.678 | 0.459 | 0.292 | 0.735 | 0.541 | -0.311 |
| 5.54176944093219 | -0.675 | 0.456 | 0.296 | 0.738 | 0.544 | -0.308 |
| 5.544911033585779 | -0.673 | 0.453 | 0.299 | 0.74 | 0.547 | -0.305 |
| 5.54805262623937 | -0.671 | 0.45 | 0.303 | 0.742 | 0.55 | -0.302 |
| 5.551194218892959 | -0.668 | 0.447 | 0.306 | 0.744 | 0.553 | -0.299 |
| 5.554335811546548 | -0.666 | 0.444 | 0.31 | 0.746 | 0.556 | -0.295 |
| 5.557477404200137 | -0.664 | 0.44 | 0.313 | 0.748 | 0.56 | -0.292 |
| 5.560618996853727 | -0.661 | 0.437 | 0.317 | 0.75 | 0.563 | -0.289 |
| 5.563760589507317 | -0.659 | 0.434 | 0.32 | 0.752 | 0.566 | -0.286 |
| 5.566902182160906 | -0.657 | 0.431 | 0.324 | 0.754 | 0.569 | -0.283 |
| 5.570043774814496 | -0.654 | 0.428 | 0.327 | 0.756 | 0.572 | -0.28 |
| 5.573185367468086 | -0.652 | 0.425 | 0.331 | 0.758 | 0.575 | -0.277 |
| 5.576326960121675 | -0.649 | 0.422 | 0.334 | 0.76 | 0.578 | -0.274 |
| 5.579468552775264 | -0.647 | 0.419 | 0.338 | 0.762 | 0.581 | -0.271 |
| 5.582610145428854 | -0.645 | 0.416 | 0.342 | 0.764 | 0.584 | -0.268 |
| 5.585751738082444 | -0.642 | 0.412 | 0.345 | 0.766 | 0.588 | -0.265 |
| 5.588893330736034 | -0.64 | 0.409 | 0.349 | 0.769 | 0.591 | -0.262 |
| 5.592034923389623 | -0.637 | 0.406 | 0.352 | 0.771 | 0.594 | -0.259 |
| 5.595176516043213 | -0.635 | 0.403 | 0.356 | 0.773 | 0.597 | -0.256 |
| 5.598318108696803 | -0.633 | 0.4 | 0.36 | 0.775 | 0.6 | -0.253 |
| 5.601459701350392 | -0.63 | 0.397 | 0.364 | 0.776 | 0.603 | -0.25 |
| 5.604601294003982 | -0.628 | 0.394 | 0.367 | 0.778 | 0.606 | -0.247 |
| 5.607742886657571 | -0.625 | 0.391 | 0.371 | 0.78 | 0.609 | -0.244 |
| 5.610884479311161 | -0.623 | 0.388 | 0.375 | 0.782 | 0.612 | -0.242 |
| 5.61402607196475 | -0.62 | 0.385 | 0.378 | 0.784 | 0.615 | -0.239 |
| 5.61716766461834 | -0.618 | 0.382 | 0.382 | 0.786 | 0.618 | -0.236 |
| 5.62030925727193 | -0.615 | 0.379 | 0.386 | 0.788 | 0.621 | -0.233 |
| 5.623450849925519 | -0.613 | 0.376 | 0.39 | 0.79 | 0.624 | -0.23 |
| 5.626592442579109 | -0.61 | 0.373 | 0.394 | 0.792 | 0.627 | -0.227 |
| 5.629734035232698 | -0.608 | 0.37 | 0.397 | 0.794 | 0.63 | -0.225 |
| 5.632875627886288 | -0.605 | 0.367 | 0.401 | 0.796 | 0.633 | -0.222 |
| 5.636017220539878 | -0.603 | 0.364 | 0.405 | 0.798 | 0.636 | -0.219 |
| 5.639158813193467 | -0.6 | 0.361 | 0.409 | 0.8 | 0.639 | -0.216 |
| 5.642300405847057 | -0.598 | 0.357 | 0.413 | 0.802 | 0.643 | -0.214 |
| 5.645441998500646 | -0.595 | 0.354 | 0.417 | 0.803 | 0.646 | -0.211 |
| 5.648583591154236 | -0.593 | 0.351 | 0.421 | 0.805 | 0.649 | -0.208 |
| 5.651725183807825 | -0.59 | 0.348 | 0.424 | 0.807 | 0.652 | -0.206 |
| 5.654866776461415 | -0.588 | 0.345 | 0.428 | 0.809 | 0.655 | -0.203 |
| 5.658008369115005 | -0.585 | 0.343 | 0.432 | 0.811 | 0.657 | -0.2 |
| 5.661149961768594 | -0.583 | 0.34 | 0.436 | 0.813 | 0.66 | -0.198 |
| 5.664291554422184 | -0.58 | 0.337 | 0.44 | 0.815 | 0.663 | -0.195 |
| 5.667433147075774 | -0.578 | 0.334 | 0.444 | 0.816 | 0.666 | -0.193 |
| 5.670574739729363 | -0.575 | 0.331 | 0.448 | 0.818 | 0.669 | -0.19 |
| 5.673716332382953 | -0.572 | 0.328 | 0.452 | 0.82 | 0.672 | -0.188 |
| 5.676857925036542 | -0.57 | 0.325 | 0.456 | 0.822 | 0.675 | -0.185 |
| 5.679999517690132 | -0.567 | 0.322 | 0.46 | 0.824 | 0.678 | -0.183 |
| 5.683141110343721 | -0.565 | 0.319 | 0.464 | 0.825 | 0.681 | -0.18 |
| 5.686282702997311 | -0.562 | 0.316 | 0.468 | 0.827 | 0.684 | -0.178 |
| 5.689424295650901 | -0.559 | 0.313 | 0.472 | 0.829 | 0.687 | -0.175 |
| 5.69256588830449 | -0.557 | 0.31 | 0.476 | 0.831 | 0.69 | -0.173 |
| 5.69570748095808 | -0.554 | 0.307 | 0.48 | 0.832 | 0.693 | -0.17 |
| 5.69884907361167 | -0.552 | 0.304 | 0.484 | 0.834 | 0.696 | -0.168 |
| 5.701990666265259 | -0.549 | 0.301 | 0.488 | 0.836 | 0.699 | -0.165 |
| 5.705132258918849 | -0.546 | 0.299 | 0.492 | 0.838 | 0.701 | -0.163 |
| 5.708273851572438 | -0.544 | 0.296 | 0.496 | 0.839 | 0.704 | -0.161 |
| 5.711415444226028 | -0.541 | 0.293 | 0.5 | 0.841 | 0.707 | -0.158 |
| 5.714557036879618 | -0.538 | 0.29 | 0.504 | 0.843 | 0.71 | -0.156 |
| 5.717698629533207 | -0.536 | 0.287 | 0.508 | 0.844 | 0.713 | -0.154 |
| 5.720840222186797 | -0.533 | 0.284 | 0.512 | 0.846 | 0.716 | -0.152 |
| 5.723981814840386 | -0.531 | 0.281 | 0.516 | 0.848 | 0.719 | -0.149 |
| 5.727123407493976 | -0.528 | 0.279 | 0.52 | 0.849 | 0.721 | -0.147 |
| 5.730265000147565 | -0.525 | 0.276 | 0.524 | 0.851 | 0.724 | -0.145 |
| 5.733406592801155 | -0.522 | 0.273 | 0.529 | 0.853 | 0.727 | -0.143 |
| 5.736548185454744 | -0.52 | 0.27 | 0.533 | 0.854 | 0.73 | -0.14 |
| 5.739689778108334 | -0.517 | 0.267 | 0.537 | 0.856 | 0.733 | -0.138 |
| 5.742831370761924 | -0.514 | 0.265 | 0.541 | 0.858 | 0.735 | -0.136 |
| 5.745972963415514 | -0.512 | 0.262 | 0.545 | 0.859 | 0.738 | -0.134 |
| 5.749114556069103 | -0.509 | 0.259 | 0.549 | 0.861 | 0.741 | -0.132 |
| 5.752256148722693 | -0.506 | 0.256 | 0.553 | 0.862 | 0.744 | -0.13 |
| 5.755397741376282 | -0.504 | 0.254 | 0.557 | 0.864 | 0.746 | -0.128 |
| 5.758539334029872 | -0.501 | 0.251 | 0.561 | 0.866 | 0.749 | -0.126 |
| 5.761680926683462 | -0.498 | 0.248 | 0.565 | 0.867 | 0.752 | -0.124 |
| 5.764822519337051 | -0.495 | 0.245 | 0.569 | 0.869 | 0.755 | -0.122 |
| 5.767964111990641 | -0.493 | 0.243 | 0.573 | 0.87 | 0.757 | -0.12 |
| 5.77110570464423 | -0.49 | 0.24 | 0.577 | 0.872 | 0.76 | -0.118 |
| 5.77424729729782 | -0.487 | 0.237 | 0.582 | 0.873 | 0.763 | -0.116 |
| 5.77738888995141 | -0.485 | 0.235 | 0.586 | 0.875 | 0.765 | -0.114 |
| 5.780530482605 | -0.482 | 0.232 | 0.59 | 0.876 | 0.768 | -0.112 |
| 5.783672075258588 | -0.479 | 0.229 | 0.594 | 0.878 | 0.771 | -0.11 |
| 5.786813667912178 | -0.476 | 0.227 | 0.598 | 0.879 | 0.773 | -0.108 |
| 5.789955260565768 | -0.473 | 0.224 | 0.602 | 0.881 | 0.776 | -0.106 |
| 5.793096853219358 | -0.471 | 0.222 | 0.606 | 0.882 | 0.778 | -0.104 |
| 5.796238445872947 | -0.468 | 0.219 | 0.61 | 0.884 | 0.781 | -0.102 |
| 5.799380038526537 | -0.465 | 0.216 | 0.614 | 0.885 | 0.784 | -0.101 |
| 5.802521631180126 | -0.462 | 0.214 | 0.618 | 0.887 | 0.786 | -0.099 |
| 5.805663223833715 | -0.46 | 0.211 | 0.622 | 0.888 | 0.789 | -0.097 |
| 5.808804816487306 | -0.457 | 0.209 | 0.626 | 0.89 | 0.791 | -0.095 |
| 5.811946409140895 | -0.454 | 0.206 | 0.63 | 0.891 | 0.794 | -0.094 |
| 5.815088001794485 | -0.451 | 0.204 | 0.634 | 0.892 | 0.796 | -0.092 |
| 5.818229594448074 | -0.448 | 0.201 | 0.638 | 0.894 | 0.799 | -0.09 |
| 5.821371187101663 | -0.446 | 0.199 | 0.642 | 0.895 | 0.801 | -0.088 |
| 5.824512779755254 | -0.443 | 0.196 | 0.646 | 0.897 | 0.804 | -0.087 |
| 5.827654372408843 | -0.44 | 0.194 | 0.65 | 0.898 | 0.806 | -0.085 |
| 5.830795965062433 | -0.437 | 0.191 | 0.654 | 0.899 | 0.809 | -0.084 |
| 5.833937557716022 | -0.434 | 0.189 | 0.658 | 0.901 | 0.811 | -0.082 |
| 5.837079150369612 | -0.431 | 0.186 | 0.662 | 0.902 | 0.814 | -0.08 |
| 5.840220743023201 | -0.429 | 0.184 | 0.666 | 0.903 | 0.816 | -0.079 |
| 5.843362335676791 | -0.426 | 0.181 | 0.67 | 0.905 | 0.819 | -0.077 |
| 5.846503928330381 | -0.423 | 0.179 | 0.674 | 0.906 | 0.821 | -0.076 |
| 5.84964552098397 | -0.42 | 0.176 | 0.678 | 0.907 | 0.824 | -0.074 |
| 5.85278711363756 | -0.417 | 0.174 | 0.682 | 0.909 | 0.826 | -0.073 |
| 5.85592870629115 | -0.414 | 0.172 | 0.686 | 0.91 | 0.828 | -0.071 |
| 5.85907029894474 | -0.412 | 0.169 | 0.69 | 0.911 | 0.831 | -0.07 |
| 5.862211891598329 | -0.409 | 0.167 | 0.694 | 0.913 | 0.833 | -0.068 |
| 5.865353484251918 | -0.406 | 0.165 | 0.698 | 0.914 | 0.835 | -0.067 |
| 5.868495076905508 | -0.403 | 0.162 | 0.702 | 0.915 | 0.838 | -0.065 |
| 5.871636669559098 | -0.4 | 0.16 | 0.706 | 0.917 | 0.84 | -0.064 |
| 5.874778262212687 | -0.397 | 0.158 | 0.709 | 0.918 | 0.842 | -0.063 |
| 5.877919854866277 | -0.394 | 0.155 | 0.713 | 0.919 | 0.845 | -0.061 |
| 5.881061447519866 | -0.391 | 0.153 | 0.717 | 0.92 | 0.847 | -0.06 |
| 5.884203040173456 | -0.388 | 0.151 | 0.721 | 0.921 | 0.849 | -0.059 |
| 5.887344632827046 | -0.386 | 0.149 | 0.725 | 0.923 | 0.851 | -0.057 |
| 5.890486225480635 | -0.383 | 0.146 | 0.729 | 0.924 | 0.854 | -0.056 |
| 5.893627818134224 | -0.38 | 0.144 | 0.732 | 0.925 | 0.856 | -0.055 |
| 5.896769410787814 | -0.377 | 0.142 | 0.736 | 0.926 | 0.858 | -0.054 |
| 5.899911003441404 | -0.374 | 0.14 | 0.74 | 0.927 | 0.86 | -0.052 |
| 5.903052596094994 | -0.371 | 0.138 | 0.744 | 0.929 | 0.862 | -0.051 |
| 5.906194188748583 | -0.368 | 0.136 | 0.747 | 0.93 | 0.864 | -0.05 |
| 5.909335781402172 | -0.365 | 0.133 | 0.751 | 0.931 | 0.867 | -0.049 |
| 5.912477374055762 | -0.362 | 0.131 | 0.755 | 0.932 | 0.869 | -0.048 |
| 5.915618966709352 | -0.359 | 0.129 | 0.758 | 0.933 | 0.871 | -0.046 |
| 5.918760559362942 | -0.356 | 0.127 | 0.762 | 0.934 | 0.873 | -0.045 |
| 5.921902152016531 | -0.353 | 0.125 | 0.766 | 0.935 | 0.875 | -0.044 |
| 5.92504374467012 | -0.351 | 0.123 | 0.769 | 0.937 | 0.877 | -0.043 |
| 5.92818533732371 | -0.348 | 0.121 | 0.773 | 0.938 | 0.879 | -0.042 |
| 5.9313269299773 | -0.345 | 0.119 | 0.777 | 0.939 | 0.881 | -0.041 |
| 5.93446852263089 | -0.342 | 0.117 | 0.78 | 0.94 | 0.883 | -0.04 |
| 5.93761011528448 | -0.339 | 0.115 | 0.784 | 0.941 | 0.885 | -0.039 |
| 5.940751707938068 | -0.336 | 0.113 | 0.787 | 0.942 | 0.887 | -0.038 |
| 5.943893300591658 | -0.333 | 0.111 | 0.791 | 0.943 | 0.889 | -0.037 |
| 5.947034893245248 | -0.33 | 0.109 | 0.794 | 0.944 | 0.891 | -0.036 |
| 5.950176485898837 | -0.327 | 0.107 | 0.798 | 0.945 | 0.893 | -0.035 |
| 5.953318078552427 | -0.324 | 0.105 | 0.801 | 0.946 | 0.895 | -0.034 |
| 5.956459671206017 | -0.321 | 0.103 | 0.805 | 0.947 | 0.897 | -0.033 |
| 5.959601263859606 | -0.318 | 0.101 | 0.808 | 0.948 | 0.899 | -0.032 |
| 5.962742856513196 | -0.315 | 0.099 | 0.811 | 0.949 | 0.901 | -0.031 |
| 5.965884449166785 | -0.312 | 0.097 | 0.815 | 0.95 | 0.903 | -0.03 |
| 5.969026041820375 | -0.309 | 0.095 | 0.818 | 0.951 | 0.905 | -0.03 |
| 5.972167634473964 | -0.306 | 0.094 | 0.821 | 0.952 | 0.906 | -0.029 |
| 5.975309227127554 | -0.303 | 0.092 | 0.825 | 0.953 | 0.908 | -0.028 |
| 5.978450819781144 | -0.3 | 0.09 | 0.828 | 0.954 | 0.91 | -0.027 |
| 5.981592412434733 | -0.297 | 0.088 | 0.831 | 0.955 | 0.912 | -0.026 |
| 5.984734005088323 | -0.294 | 0.086 | 0.835 | 0.956 | 0.914 | -0.025 |
| 5.987875597741913 | -0.291 | 0.085 | 0.838 | 0.957 | 0.915 | -0.025 |
| 5.991017190395502 | -0.288 | 0.083 | 0.841 | 0.958 | 0.917 | -0.024 |
| 5.994158783049092 | -0.285 | 0.081 | 0.844 | 0.959 | 0.919 | -0.023 |
| 5.997300375702681 | -0.282 | 0.08 | 0.847 | 0.959 | 0.92 | -0.022 |
| 6.000441968356271 | -0.279 | 0.078 | 0.85 | 0.96 | 0.922 | -0.022 |
| 6.003583561009861 | -0.276 | 0.076 | 0.853 | 0.961 | 0.924 | -0.021 |
| 6.00672515366345 | -0.273 | 0.075 | 0.857 | 0.962 | 0.925 | -0.02 |
| 6.00986674631704 | -0.27 | 0.073 | 0.86 | 0.963 | 0.927 | -0.02 |
| 6.01300833897063 | -0.267 | 0.071 | 0.863 | 0.964 | 0.929 | -0.019 |
| 6.01614993162422 | -0.264 | 0.07 | 0.866 | 0.965 | 0.93 | -0.018 |
| 6.019291524277808 | -0.261 | 0.068 | 0.869 | 0.965 | 0.932 | -0.018 |
| 6.022433116931398 | -0.258 | 0.066 | 0.871 | 0.966 | 0.934 | -0.017 |
| 6.025574709584988 | -0.255 | 0.065 | 0.874 | 0.967 | 0.935 | -0.017 |
| 6.028716302238577 | -0.252 | 0.063 | 0.877 | 0.968 | 0.937 | -0.016 |
| 6.031857894892167 | -0.249 | 0.062 | 0.88 | 0.969 | 0.938 | -0.015 |
| 6.034999487545757 | -0.246 | 0.06 | 0.883 | 0.969 | 0.94 | -0.015 |
| 6.038141080199346 | -0.243 | 0.059 | 0.886 | 0.97 | 0.941 | -0.014 |
| 6.041282672852935 | -0.24 | 0.057 | 0.889 | 0.971 | 0.943 | -0.014 |
| 6.044424265506525 | -0.236 | 0.056 | 0.891 | 0.972 | 0.944 | -0.013 |
| 6.047565858160115 | -0.233 | 0.054 | 0.894 | 0.972 | 0.946 | -0.013 |
| 6.050707450813704 | -0.23 | 0.053 | 0.897 | 0.973 | 0.947 | -0.012 |
| 6.053849043467294 | -0.227 | 0.052 | 0.899 | 0.974 | 0.948 | -0.012 |
| 6.056990636120884 | -0.224 | 0.05 | 0.902 | 0.975 | 0.95 | -0.011 |
| 6.060132228774473 | -0.221 | 0.049 | 0.905 | 0.975 | 0.951 | -0.011 |
| 6.063273821428063 | -0.218 | 0.048 | 0.907 | 0.976 | 0.952 | -0.01 |
| 6.066415414081653 | -0.215 | 0.046 | 0.91 | 0.977 | 0.954 | -0.01 |
| 6.069557006735242 | -0.212 | 0.045 | 0.912 | 0.977 | 0.955 | -0.01 |
| 6.072698599388831 | -0.209 | 0.044 | 0.915 | 0.978 | 0.956 | -0.009 |
| 6.07584019204242 | -0.206 | 0.042 | 0.917 | 0.979 | 0.958 | -0.009 |
| 6.078981784696011 | -0.203 | 0.041 | 0.919 | 0.979 | 0.959 | -0.008 |
| 6.082123377349601 | -0.2 | 0.04 | 0.922 | 0.98 | 0.96 | -0.008 |
| 6.08526497000319 | -0.197 | 0.039 | 0.924 | 0.98 | 0.961 | -0.008 |
| 6.08840656265678 | -0.194 | 0.037 | 0.926 | 0.981 | 0.963 | -0.007 |
| 6.09154815531037 | -0.19 | 0.036 | 0.929 | 0.982 | 0.964 | -0.007 |
| 6.094689747963959 | -0.187 | 0.035 | 0.931 | 0.982 | 0.965 | -0.007 |
| 6.097831340617549 | -0.184 | 0.034 | 0.933 | 0.983 | 0.966 | -0.006 |
| 6.100972933271138 | -0.181 | 0.033 | 0.935 | 0.983 | 0.967 | -0.006 |
| 6.104114525924728 | -0.178 | 0.032 | 0.938 | 0.984 | 0.968 | -0.006 |
| 6.107256118578317 | -0.175 | 0.031 | 0.94 | 0.985 | 0.969 | -0.005 |
| 6.110397711231907 | -0.172 | 0.03 | 0.942 | 0.985 | 0.97 | -0.005 |
| 6.113539303885497 | -0.169 | 0.029 | 0.944 | 0.986 | 0.971 | -0.005 |
| 6.116680896539086 | -0.166 | 0.027 | 0.946 | 0.986 | 0.973 | -0.005 |
| 6.119822489192675 | -0.163 | 0.026 | 0.948 | 0.987 | 0.974 | -0.004 |
| 6.122964081846265 | -0.16 | 0.025 | 0.95 | 0.987 | 0.975 | -0.004 |
| 6.126105674499855 | -0.156 | 0.024 | 0.952 | 0.988 | 0.976 | -0.004 |
| 6.129247267153445 | -0.153 | 0.024 | 0.954 | 0.988 | 0.976 | -0.004 |
| 6.132388859807034 | -0.15 | 0.023 | 0.955 | 0.989 | 0.977 | -0.003 |
| 6.135530452460624 | -0.147 | 0.022 | 0.957 | 0.989 | 0.978 | -0.003 |
| 6.138672045114213 | -0.144 | 0.021 | 0.959 | 0.99 | 0.979 | -0.003 |
| 6.141813637767803 | -0.141 | 0.02 | 0.961 | 0.99 | 0.98 | -0.003 |
| 6.144955230421393 | -0.138 | 0.019 | 0.962 | 0.99 | 0.981 | -0.003 |
| 6.148096823074982 | -0.135 | 0.018 | 0.964 | 0.991 | 0.982 | -0.002 |
| 6.151238415728571 | -0.132 | 0.017 | 0.966 | 0.991 | 0.983 | -0.002 |
| 6.154380008382161 | -0.128 | 0.016 | 0.967 | 0.992 | 0.984 | -0.002 |
| 6.157521601035751 | -0.125 | 0.016 | 0.969 | 0.992 | 0.984 | -0.002 |
| 6.16066319368934 | -0.122 | 0.015 | 0.97 | 0.993 | 0.985 | -0.002 |
| 6.16380478634293 | -0.119 | 0.014 | 0.972 | 0.993 | 0.986 | -0.002 |
| 6.16694637899652 | -0.116 | 0.013 | 0.973 | 0.993 | 0.987 | -0.002 |
| 6.170087971650109 | -0.113 | 0.013 | 0.975 | 0.994 | 0.987 | -0.001 |
| 6.173229564303698 | -0.11 | 0.012 | 0.976 | 0.994 | 0.988 | -0.001 |
| 6.176371156957289 | -0.107 | 0.011 | 0.977 | 0.994 | 0.989 | -0.001 |
| 6.179512749610878 | -0.103 | 0.011 | 0.979 | 0.995 | 0.989 | -0.001 |
| 6.182654342264468 | -0.1 | 0.01 | 0.98 | 0.995 | 0.99 | -0.001 |
| 6.185795934918057 | -0.097 | 0.009 | 0.981 | 0.995 | 0.991 | -0.001 |
| 6.188937527571647 | -0.094 | 0.009 | 0.982 | 0.996 | 0.991 | -0.001 |
| 6.192079120225237 | -0.091 | 0.008 | 0.984 | 0.996 | 0.992 | -0.001 |
| 6.195220712878826 | -0.088 | 0.008 | 0.985 | 0.996 | 0.992 | -0.001 |
| 6.198362305532415 | -0.085 | 0.007 | 0.986 | 0.996 | 0.993 | -0.001 |
| 6.201503898186005 | -0.082 | 0.007 | 0.987 | 0.997 | 0.993 | -0.001 |
| 6.204645490839594 | -0.078 | 0.006 | 0.988 | 0.997 | 0.994 | 0 |
| 6.207787083493184 | -0.075 | 0.006 | 0.989 | 0.997 | 0.994 | 0 |
| 6.210928676146774 | -0.072 | 0.005 | 0.99 | 0.997 | 0.995 | 0 |
| 6.214070268800364 | -0.069 | 0.005 | 0.99 | 0.998 | 0.995 | 0 |
| 6.217211861453953 | -0.066 | 0.004 | 0.991 | 0.998 | 0.996 | 0 |
| 6.220353454107543 | -0.063 | 0.004 | 0.992 | 0.998 | 0.996 | 0 |
| 6.223495046761133 | -0.06 | 0.004 | 0.993 | 0.998 | 0.996 | 0 |
| 6.226636639414722 | -0.057 | 0.003 | 0.994 | 0.998 | 0.997 | 0 |
| 6.229778232068312 | -0.053 | 0.003 | 0.994 | 0.999 | 0.997 | 0 |
| 6.232919824721901 | -0.05 | 0.003 | 0.995 | 0.999 | 0.997 | 0 |
| 6.236061417375491 | -0.047 | 0.002 | 0.996 | 0.999 | 0.998 | 0 |
| 6.23920301002908 | -0.044 | 0.002 | 0.996 | 0.999 | 0.998 | 0 |
| 6.24234460268267 | -0.041 | 0.002 | 0.997 | 0.999 | 0.998 | 0 |
| 6.24548619533626 | -0.038 | 0.001 | 0.997 | 0.999 | 0.999 | 0 |
| 6.24862778798985 | -0.035 | 0.001 | 0.998 | 0.999 | 0.999 | 0 |
| 6.251769380643438 | -0.031 | 0.001 | 0.998 | 1 | 0.999 | 0 |
| 6.254910973297028 | -0.028 | 0.001 | 0.998 | 1 | 0.999 | 0 |
| 6.258052565950618 | -0.025 | 0.001 | 0.999 | 1 | 0.999 | 0 |
| 6.261194158604208 | -0.022 | 0 | 0.999 | 1 | 1 | 0 |
| 6.264335751257797 | -0.019 | 0 | 0.999 | 1 | 1 | 0 |
| 6.267477343911387 | -0.016 | 0 | 1 | 1 | 1 | 0 |
| 6.270618936564976 | -0.013 | 0 | 1 | 1 | 1 | 0 |
| 6.273760529218566 | -0.009 | 0 | 1 | 1 | 1 | 0 |
| 6.276902121872155 | -0.006 | 0 | 1 | 1 | 1 | 0 |
| 6.280043714525745 | -0.003 | 0 | 1 | 1 | 1 | 0 |
| 6.283185307179335 | 0 | 0 | 1 | 1 | 1 | 0 |